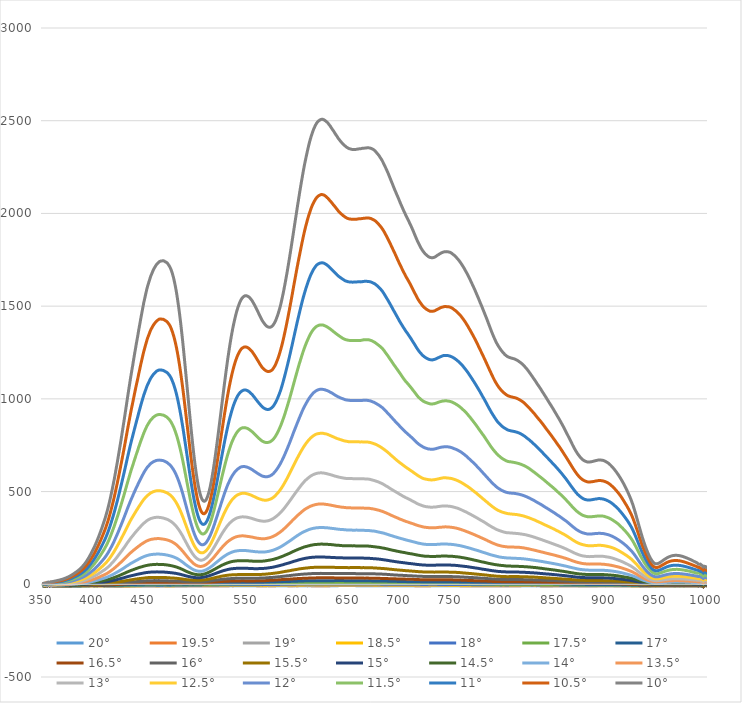
| Category | 20° | 19.5° | 19° | 18.5° | 18° | 17.5° | 17° | 16.5° | 16° | 15.5° | 15° | 14.5° | 14° | 13.5° | 13° | 12.5° | 12° | 11.5° | 11° | 10.5° | 10° |
|---|---|---|---|---|---|---|---|---|---|---|---|---|---|---|---|---|---|---|---|---|---|
| 350.0 | -10 | -11.02 | -11.71 | -10.6 | -11.24 | -12.84 | -10.41 | -9.84 | -10.38 | -9.68 | -8.54 | -9.34 | -8.19 | -7.99 | -8.82 | -6.83 | -7.26 | -1.53 | -5.43 | 0.02 | 2.93 |
| 351.0 | -9.22 | -9.49 | -9.49 | -7.64 | -9.81 | -8.31 | -7.84 | -7.64 | -9.61 | -7.09 | -6.87 | -6.73 | -6.76 | -6.06 | -5.84 | -4.16 | -2.84 | -2.92 | 0.99 | 2.59 | 5.61 |
| 352.0 | -9.07 | -8.38 | -10.74 | -9.99 | -7.34 | -9.9 | -7.33 | -8.97 | -9.09 | -8.37 | -6.91 | -6.82 | -4.83 | -6.4 | -1.57 | -4.04 | -0.53 | -0.83 | -0.29 | 3.73 | 6.51 |
| 353.0 | -8.75 | -9.77 | -7.89 | -10 | -11.17 | -8.79 | -8.24 | -8.46 | -7.64 | -8.14 | -6.86 | -8.42 | -6.86 | -5.61 | -4.22 | -3.83 | -2.38 | -0.36 | 0.94 | 6.61 | 5.08 |
| 354.0 | -11.13 | -10.84 | -10.36 | -9.51 | -10.81 | -9.68 | -8.02 | -9.39 | -7.99 | -9.81 | -8.4 | -10.52 | -7.86 | -7.68 | -4.73 | -2.63 | -4.05 | -0.04 | 0.52 | 3.36 | 6.55 |
| 355.0 | -7.14 | -8.62 | -5.9 | -6.95 | -7.66 | -5.05 | -7.15 | -7.69 | -4.98 | -7.45 | -5.7 | -5.26 | -4.68 | -1.62 | -2.18 | 1.18 | 1.76 | 1.74 | 7.07 | 8.83 | 11.26 |
| 356.0 | -5.54 | -6.26 | -5.9 | -4.74 | -5.83 | -4.41 | -5.54 | -6.29 | -5.62 | -5.87 | -5.06 | -3.06 | -3.85 | -3.06 | -0.77 | 0.75 | 2.08 | 4.98 | 3.74 | 8.46 | 11.79 |
| 357.0 | -7.53 | -7.83 | -9.19 | -6.79 | -8.82 | -6.94 | -7.97 | -8.34 | -6.84 | -7.04 | -7.78 | -4.25 | -5.36 | -5.21 | -2.69 | -2.32 | -0.36 | 2.26 | 5.22 | 7.84 | 10.57 |
| 358.0 | -4.87 | -5.07 | -5.77 | -5.09 | -6.64 | -3.98 | -7.79 | -4.24 | -4.15 | -5.12 | -3.23 | -3.58 | -2.86 | -2.5 | -1.37 | 0.8 | 1.37 | 6.04 | 6.92 | 11.02 | 13.13 |
| 359.0 | -7.29 | -7.72 | -8.25 | -6.79 | -6.98 | -6 | -7.44 | -7.22 | -4.8 | -6.59 | -6.78 | -5.27 | -5.24 | -3.77 | -2.53 | -0.76 | 0.6 | 4.78 | 5.71 | 10.49 | 13.89 |
| 360.0 | -8.21 | -8.77 | -8.54 | -7.88 | -8.45 | -8.07 | -8.2 | -7.99 | -7.18 | -6.98 | -6.59 | -6.07 | -5.13 | -4.1 | -2.24 | -0.16 | 1.67 | 5.13 | 6.71 | 10.71 | 14.66 |
| 361.0 | -8.07 | -8.67 | -8.37 | -7.85 | -8.34 | -7.85 | -8.02 | -7.88 | -6.99 | -6.86 | -6.47 | -5.84 | -4.86 | -3.81 | -1.67 | 0.41 | 2.32 | 5.8 | 7.78 | 11.82 | 15.9 |
| 362.0 | -8 | -8.61 | -8.39 | -7.87 | -8.35 | -7.83 | -8.07 | -7.97 | -6.82 | -6.91 | -6.43 | -5.75 | -4.74 | -3.53 | -1.4 | 0.72 | 2.9 | 6.63 | 8.57 | 12.82 | 17.07 |
| 363.0 | -7.93 | -8.53 | -8.19 | -7.63 | -8.4 | -7.68 | -8 | -7.79 | -6.59 | -6.7 | -6.26 | -5.63 | -4.62 | -3.18 | -1.18 | 1.3 | 3.47 | 7.39 | 9.58 | 13.9 | 18.34 |
| 364.0 | -7.99 | -8.49 | -8.31 | -7.61 | -8.3 | -7.71 | -8.08 | -7.82 | -6.63 | -6.66 | -6.15 | -5.45 | -4.51 | -2.98 | -0.87 | 1.7 | 3.99 | 8 | 10.55 | 14.75 | 19.69 |
| 365.0 | -7.8 | -8.28 | -8.14 | -7.38 | -8.13 | -7.47 | -7.99 | -7.62 | -6.52 | -6.44 | -5.87 | -5.02 | -4.2 | -2.5 | -0.27 | 2.28 | 4.8 | 8.94 | 11.62 | 16.03 | 21.07 |
| 366.0 | -7.96 | -8.36 | -8.33 | -7.53 | -8.26 | -7.67 | -8.08 | -7.69 | -6.65 | -6.43 | -5.9 | -5.08 | -4.19 | -2.47 | 0 | 2.47 | 5.25 | 9.73 | 12.33 | 17.05 | 22.22 |
| 367.0 | -8.13 | -8.55 | -8.52 | -7.69 | -8.39 | -7.87 | -8.2 | -7.64 | -6.8 | -6.52 | -5.94 | -5.23 | -4.11 | -2.4 | 0.14 | 2.72 | 5.72 | 10.37 | 13.43 | 18.09 | 23.37 |
| 368.0 | -8.21 | -8.55 | -8.49 | -7.73 | -8.42 | -7.92 | -8.2 | -7.54 | -6.84 | -6.53 | -5.78 | -5.22 | -3.94 | -2.13 | 0.5 | 3.28 | 6.47 | 11.21 | 14.43 | 19.42 | 24.88 |
| 369.0 | -8.35 | -8.64 | -8.59 | -7.83 | -8.46 | -8.13 | -8.13 | -7.66 | -6.93 | -6.58 | -5.73 | -5.25 | -3.84 | -1.9 | 0.84 | 3.74 | 7.21 | 12.1 | 15.62 | 20.7 | 26.47 |
| 370.0 | -8.43 | -8.71 | -8.58 | -7.97 | -8.54 | -8.3 | -8.18 | -7.73 | -7.03 | -6.54 | -5.69 | -5.15 | -3.75 | -1.67 | 1.22 | 4.14 | 7.93 | 13.03 | 16.86 | 22.11 | 28.16 |
| 371.0 | -8.28 | -8.61 | -8.5 | -7.96 | -8.42 | -8.35 | -7.98 | -7.62 | -6.96 | -6.44 | -5.61 | -4.84 | -3.47 | -1.26 | 1.78 | 4.94 | 8.8 | 14.15 | 18.35 | 23.85 | 30.21 |
| 372.0 | -8.3 | -8.65 | -8.51 | -7.9 | -8.43 | -8.31 | -7.93 | -7.56 | -6.93 | -6.41 | -5.41 | -4.58 | -3.09 | -0.89 | 2.32 | 5.59 | 9.7 | 15.41 | 20.04 | 25.59 | 32.4 |
| 373.0 | -8.28 | -8.62 | -8.51 | -7.88 | -8.39 | -8.35 | -7.93 | -7.45 | -6.89 | -6.43 | -5.31 | -4.4 | -2.71 | -0.48 | 2.88 | 6.48 | 10.58 | 16.75 | 21.68 | 27.48 | 34.53 |
| 374.0 | -8.31 | -8.61 | -8.47 | -7.94 | -8.38 | -8.22 | -7.86 | -7.47 | -6.82 | -6.3 | -5.12 | -4.18 | -2.39 | -0.02 | 3.49 | 7.3 | 11.68 | 18.18 | 23.08 | 29.51 | 36.93 |
| 375.0 | -8.38 | -8.55 | -8.49 | -7.96 | -8.53 | -8.18 | -7.84 | -7.42 | -6.82 | -6.31 | -5.04 | -3.95 | -2.09 | 0.46 | 4.24 | 8.05 | 12.83 | 19.58 | 24.86 | 31.92 | 39.53 |
| 376.0 | -8.39 | -8.61 | -8.72 | -8.15 | -8.71 | -8.26 | -8.03 | -7.45 | -6.96 | -6.44 | -5.15 | -3.84 | -1.92 | 0.73 | 4.97 | 8.83 | 13.99 | 21.03 | 26.6 | 34.08 | 42.01 |
| 377.0 | -8.38 | -8.5 | -8.69 | -8.18 | -8.6 | -8.13 | -8.02 | -7.47 | -6.93 | -6.41 | -4.87 | -3.5 | -1.57 | 1.26 | 5.56 | 9.7 | 15.29 | 22.67 | 28.79 | 36.78 | 45.04 |
| 378.0 | -8.36 | -8.45 | -8.72 | -8.11 | -8.57 | -8.04 | -7.92 | -7.4 | -6.89 | -6.27 | -4.64 | -3.22 | -1.06 | 1.85 | 6.34 | 10.82 | 16.52 | 24.32 | 30.92 | 39.45 | 48.13 |
| 379.0 | -8.29 | -8.39 | -8.56 | -8 | -8.45 | -7.95 | -7.76 | -7.16 | -6.73 | -6.08 | -4.36 | -2.8 | -0.54 | 2.55 | 7.21 | 12.01 | 18.15 | 26.27 | 33.34 | 42.18 | 51.51 |
| 380.0 | -8.37 | -8.41 | -8.49 | -7.93 | -8.45 | -7.85 | -7.72 | -7.09 | -6.63 | -5.86 | -3.98 | -2.48 | -0.13 | 3.21 | 8.1 | 13.15 | 19.61 | 28.21 | 35.89 | 45.12 | 55.15 |
| 381.0 | -8.41 | -8.35 | -8.46 | -8.03 | -8.35 | -7.72 | -7.57 | -7.04 | -6.48 | -5.62 | -3.71 | -2.27 | 0.37 | 3.99 | 8.98 | 14.38 | 21.26 | 30.29 | 38.53 | 47.96 | 58.83 |
| 382.0 | -8.52 | -8.36 | -8.51 | -7.99 | -8.27 | -7.64 | -7.58 | -6.99 | -6.36 | -5.38 | -3.54 | -1.94 | 0.83 | 4.62 | 9.84 | 15.62 | 22.95 | 32.54 | 41.16 | 50.94 | 62.66 |
| 383.0 | -8.5 | -8.28 | -8.34 | -7.99 | -8.16 | -7.71 | -7.53 | -6.8 | -6.2 | -5.12 | -3.21 | -1.54 | 1.37 | 5.28 | 10.89 | 17.02 | 24.72 | 34.56 | 43.81 | 54.06 | 66.44 |
| 384.0 | -8.61 | -8.41 | -8.41 | -8.2 | -8.09 | -7.74 | -7.59 | -6.82 | -6.25 | -5.12 | -3.15 | -1.19 | 1.85 | 5.94 | 11.86 | 18.16 | 26.51 | 36.75 | 46.59 | 57.65 | 70.42 |
| 385.0 | -8.67 | -8.46 | -8.39 | -8.18 | -8.11 | -7.65 | -7.48 | -6.73 | -6.12 | -4.95 | -2.95 | -0.78 | 2.41 | 6.79 | 12.91 | 19.69 | 28.43 | 39.34 | 49.58 | 61.47 | 74.77 |
| 386.0 | -8.74 | -8.59 | -8.52 | -8.35 | -8.19 | -7.84 | -7.55 | -6.66 | -6.11 | -4.84 | -2.8 | -0.51 | 2.99 | 7.51 | 13.86 | 21.07 | 30.38 | 41.78 | 52.71 | 65.35 | 79.41 |
| 387.0 | -8.73 | -8.51 | -8.52 | -8.22 | -8.08 | -7.76 | -7.42 | -6.63 | -6.01 | -4.66 | -2.56 | -0.08 | 3.63 | 8.36 | 15.02 | 22.82 | 32.4 | 44.36 | 56.09 | 69.47 | 84.38 |
| 388.0 | -8.59 | -8.29 | -8.35 | -8.12 | -7.9 | -7.59 | -7.24 | -6.56 | -5.69 | -4.34 | -1.99 | 0.58 | 4.49 | 9.61 | 16.53 | 24.81 | 34.86 | 47.45 | 59.82 | 74.12 | 90.1 |
| 389.0 | -8.47 | -8.25 | -8.26 | -8.08 | -7.74 | -7.44 | -7.1 | -6.4 | -5.42 | -3.89 | -1.61 | 1.23 | 5.34 | 10.66 | 18.16 | 26.8 | 37.5 | 50.83 | 63.76 | 78.83 | 95.84 |
| 390.0 | -8.49 | -8.25 | -8.15 | -8.12 | -7.69 | -7.39 | -7.21 | -6.29 | -5.35 | -3.6 | -1.28 | 1.82 | 6.04 | 11.72 | 19.8 | 28.84 | 40.11 | 54.4 | 68.12 | 84.13 | 102.12 |
| 391.0 | -8.55 | -8.21 | -8.14 | -8.07 | -7.62 | -7.36 | -7.17 | -6.18 | -5.19 | -3.44 | -0.84 | 2.43 | 6.93 | 12.89 | 21.48 | 31.18 | 42.99 | 58.14 | 72.71 | 89.65 | 108.72 |
| 392.0 | -8.52 | -8.18 | -8.15 | -7.98 | -7.63 | -7.26 | -7.08 | -6.03 | -5.09 | -3.14 | -0.39 | 3.12 | 7.77 | 14.27 | 23.3 | 33.52 | 46.19 | 62.31 | 77.61 | 95.75 | 115.93 |
| 393.0 | -8.39 | -8.2 | -8.07 | -7.95 | -7.54 | -7.32 | -6.98 | -5.98 | -4.91 | -2.9 | -0.07 | 3.72 | 8.56 | 15.55 | 25.41 | 36.07 | 49.4 | 66.69 | 82.79 | 102.26 | 123.86 |
| 394.0 | -8.26 | -8.26 | -7.96 | -7.86 | -7.51 | -7.21 | -6.82 | -5.86 | -4.69 | -2.57 | 0.42 | 4.5 | 9.53 | 17.02 | 27.44 | 38.77 | 52.95 | 71.4 | 88.55 | 109.32 | 132.48 |
| 395.0 | -8.23 | -8.29 | -7.92 | -7.87 | -7.41 | -7.3 | -6.88 | -5.67 | -4.53 | -2.42 | 0.88 | 5.15 | 10.46 | 18.34 | 29.75 | 41.72 | 56.75 | 76.17 | 94.82 | 116.62 | 141.45 |
| 396.0 | -8.17 | -8.25 | -7.94 | -7.79 | -7.31 | -7.23 | -6.85 | -5.56 | -4.25 | -2.14 | 1.53 | 5.99 | 11.7 | 20.1 | 31.98 | 45.13 | 60.74 | 81.65 | 101.73 | 124.71 | 151.11 |
| 397.0 | -8.24 | -8.23 | -7.72 | -7.74 | -7.2 | -7.12 | -6.61 | -5.37 | -3.93 | -1.77 | 2.21 | 6.9 | 12.98 | 21.83 | 34.35 | 48.4 | 64.97 | 87.29 | 108.75 | 133.13 | 161.36 |
| 398.0 | -8.24 | -8.27 | -7.67 | -7.64 | -7.16 | -7.14 | -6.5 | -5.17 | -3.54 | -1.3 | 2.76 | 7.79 | 14.27 | 23.71 | 37.13 | 51.89 | 69.34 | 93.18 | 116.22 | 141.89 | 171.87 |
| 399.0 | -8.31 | -8.22 | -7.74 | -7.68 | -7.12 | -7.12 | -6.49 | -5.11 | -3.32 | -0.97 | 3.39 | 8.72 | 15.49 | 25.53 | 39.81 | 55.44 | 73.82 | 99.42 | 123.66 | 150.76 | 182.78 |
| 400.0 | -8.48 | -8.3 | -7.95 | -7.8 | -7.29 | -7.34 | -6.66 | -5.23 | -3.28 | -0.72 | 3.83 | 9.52 | 16.56 | 27.2 | 42.32 | 58.88 | 78.25 | 105.79 | 131.43 | 160.33 | 193.75 |
| 401.0 | -8.47 | -8.28 | -7.99 | -7.76 | -7.25 | -7.39 | -6.69 | -5.17 | -3.22 | -0.55 | 4.34 | 10.46 | 17.95 | 29 | 45.29 | 62.71 | 83.45 | 112.53 | 139.75 | 170.31 | 205.61 |
| 402.0 | -8.4 | -8.29 | -7.96 | -7.69 | -7.19 | -7.32 | -6.5 | -5.01 | -2.93 | -0.2 | 4.96 | 11.46 | 19.45 | 31.08 | 48.21 | 66.68 | 88.79 | 119.58 | 148.3 | 180.87 | 217.96 |
| 403.0 | -8.41 | -8.27 | -7.94 | -7.64 | -7.24 | -7.37 | -6.43 | -4.99 | -2.85 | 0.1 | 5.71 | 12.48 | 20.82 | 33.15 | 51.05 | 70.89 | 94.2 | 126.75 | 157.27 | 191.89 | 230.7 |
| 404.0 | -8.53 | -8.35 | -8.03 | -7.69 | -7.24 | -7.26 | -6.36 | -4.95 | -2.72 | 0.54 | 6.35 | 13.42 | 22.29 | 35.34 | 54.11 | 75.33 | 99.79 | 134.47 | 166.56 | 203.39 | 244.4 |
| 405.0 | -8.37 | -8.23 | -8 | -7.51 | -7.2 | -7.09 | -6.2 | -4.8 | -2.35 | 1 | 7.11 | 14.57 | 23.97 | 37.71 | 57.5 | 79.89 | 105.55 | 142.55 | 176.32 | 214.93 | 258.54 |
| 406.0 | -8.26 | -8.08 | -7.93 | -7.39 | -7.06 | -7.04 | -6.1 | -4.53 | -1.92 | 1.54 | 8 | 15.75 | 25.95 | 40.25 | 61.24 | 84.8 | 111.87 | 150.82 | 186.53 | 227.12 | 273.32 |
| 407.0 | -8.34 | -8.1 | -7.89 | -7.4 | -7.04 | -6.99 | -6.06 | -4.53 | -1.69 | 2 | 8.76 | 16.79 | 27.63 | 42.68 | 64.66 | 89.42 | 118 | 159.2 | 196.92 | 239.66 | 287.87 |
| 408.0 | -8.23 | -8.14 | -7.76 | -7.41 | -6.97 | -7 | -5.99 | -4.22 | -1.4 | 2.42 | 9.64 | 18.02 | 29.37 | 45.17 | 68.5 | 94.43 | 124.43 | 167.93 | 207.63 | 252.5 | 303.32 |
| 409.0 | -8.41 | -8.38 | -7.98 | -7.56 | -7.17 | -7.14 | -6.1 | -4.26 | -1.28 | 2.71 | 10.17 | 19.13 | 30.86 | 47.51 | 72.22 | 99.48 | 131.04 | 176.97 | 218.43 | 265.85 | 319.11 |
| 410.0 | -8.56 | -8.48 | -8.13 | -7.71 | -7.38 | -7.28 | -6.2 | -4.17 | -1.02 | 2.83 | 10.72 | 20.13 | 32.48 | 49.99 | 75.7 | 104.68 | 137.57 | 185.88 | 229.81 | 279.33 | 335.62 |
| 411.0 | -8.6 | -8.49 | -8.15 | -7.7 | -7.37 | -7.24 | -5.96 | -4.05 | -0.61 | 3.31 | 11.6 | 21.49 | 34.41 | 52.77 | 79.41 | 110.11 | 144.78 | 195.41 | 241.49 | 293.5 | 352.59 |
| 412.0 | -8.48 | -8.49 | -8.11 | -7.65 | -7.32 | -7.13 | -5.72 | -3.81 | -0.28 | 3.96 | 12.57 | 22.75 | 36.3 | 55.67 | 83.49 | 115.97 | 152.41 | 205.62 | 254.24 | 308.61 | 371.05 |
| 413.0 | -8.65 | -8.51 | -8.14 | -7.69 | -7.28 | -7.15 | -5.72 | -3.66 | 0.01 | 4.31 | 13.51 | 24.09 | 38.39 | 58.55 | 88.02 | 121.91 | 160.41 | 216.21 | 267.66 | 324.49 | 390.23 |
| 414.0 | -8.79 | -8.51 | -8.25 | -7.85 | -7.36 | -7.07 | -5.66 | -3.46 | 0.37 | 5.01 | 14.56 | 25.63 | 40.63 | 61.92 | 92.6 | 128.52 | 169.32 | 228.06 | 282.08 | 341.87 | 411.16 |
| 415.0 | -9.01 | -8.55 | -8.42 | -7.97 | -7.42 | -7.01 | -5.63 | -3.32 | 0.62 | 5.58 | 15.65 | 27.13 | 42.83 | 65.33 | 97.66 | 135.58 | 178.56 | 240.25 | 297.14 | 360.32 | 433.15 |
| 416.0 | -9.01 | -8.53 | -8.42 | -7.9 | -7.42 | -6.81 | -5.32 | -3.01 | 1 | 6.25 | 16.86 | 28.88 | 45.44 | 69.3 | 103.06 | 143.01 | 188.38 | 253.5 | 313.31 | 380.03 | 456.79 |
| 417.0 | -8.84 | -8.51 | -8.38 | -8.02 | -7.35 | -6.65 | -5.09 | -2.67 | 1.49 | 7.1 | 18.12 | 30.82 | 48.16 | 73.24 | 109.06 | 151.07 | 198.92 | 267.69 | 330.7 | 400.84 | 482.42 |
| 418.0 | -8.78 | -8.5 | -8.44 | -8.01 | -7.29 | -6.54 | -4.92 | -2.44 | 1.99 | 7.75 | 19.4 | 32.5 | 50.86 | 77.29 | 114.88 | 159.43 | 209.39 | 282.11 | 348.67 | 422.15 | 508.29 |
| 419.0 | -8.77 | -8.5 | -8.39 | -8.07 | -7.32 | -6.46 | -4.82 | -2.2 | 2.4 | 8.29 | 20.58 | 34.32 | 53.51 | 81.48 | 120.92 | 167.98 | 220.44 | 296.89 | 366.71 | 444.31 | 535.1 |
| 420.0 | -8.94 | -8.65 | -8.54 | -8.22 | -7.35 | -6.53 | -4.8 | -2.1 | 2.81 | 8.95 | 21.64 | 36.15 | 56.42 | 85.77 | 127.1 | 176.42 | 231.9 | 311.57 | 386.01 | 467.38 | 562.7 |
| 421.0 | -8.92 | -8.67 | -8.46 | -8.2 | -7.26 | -6.35 | -4.59 | -1.78 | 3.42 | 9.75 | 22.97 | 38.27 | 59.62 | 90.58 | 133.64 | 185.85 | 244.12 | 327.79 | 406.04 | 492.12 | 592.92 |
| 422.0 | -9.04 | -8.79 | -8.57 | -8.26 | -7.39 | -6.37 | -4.5 | -1.53 | 3.95 | 10.56 | 24.38 | 40.33 | 62.71 | 95.38 | 140.5 | 195.78 | 256.7 | 344.58 | 426.87 | 517.96 | 623.61 |
| 423.0 | -9.25 | -8.81 | -8.62 | -8.41 | -7.45 | -6.38 | -4.54 | -1.26 | 4.33 | 11.41 | 25.77 | 42.41 | 65.64 | 100.28 | 147.42 | 205.4 | 269.04 | 361 | 447.38 | 543.47 | 654.5 |
| 424.0 | -9.21 | -8.79 | -8.65 | -8.37 | -7.36 | -6.24 | -4.27 | -0.74 | 5.12 | 12.36 | 27.17 | 44.62 | 68.97 | 105.44 | 154.76 | 215.31 | 281.98 | 378.15 | 469.21 | 570.35 | 686.9 |
| 425.0 | -9.13 | -8.8 | -8.59 | -8.29 | -7.32 | -6.09 | -4.05 | -0.3 | 5.67 | 13.32 | 28.69 | 47.14 | 72.41 | 110.41 | 162.22 | 225.4 | 295.54 | 396.19 | 491.67 | 597.69 | 720.03 |
| 426.0 | -9.28 | -8.93 | -8.59 | -8.42 | -7.34 | -6.19 | -3.93 | -0.02 | 6.11 | 14.18 | 30.21 | 49.51 | 75.62 | 115.63 | 169.59 | 235.57 | 309.04 | 414.36 | 514.56 | 625.34 | 753.63 |
| 427.0 | -9.33 | -9.04 | -8.57 | -8.5 | -7.43 | -6.1 | -3.81 | 0.22 | 6.44 | 15.01 | 31.48 | 51.75 | 78.76 | 120.65 | 176.95 | 246.04 | 322.35 | 432.47 | 537.51 | 653.32 | 787.29 |
| 428.0 | -9.12 | -8.85 | -8.49 | -8.36 | -7.21 | -5.81 | -3.44 | 0.79 | 7.16 | 15.93 | 33 | 54.39 | 82.27 | 126.04 | 184.58 | 257.12 | 336.43 | 450.96 | 560.88 | 682.07 | 822.27 |
| 429.0 | -9.2 | -8.92 | -8.59 | -8.48 | -7.25 | -5.9 | -3.32 | 1.03 | 7.62 | 16.84 | 34.29 | 56.68 | 85.74 | 131.38 | 192.12 | 267.74 | 350.26 | 469.47 | 584.53 | 711.12 | 857.51 |
| 430.0 | -9.15 | -8.77 | -8.47 | -8.36 | -7.17 | -5.76 | -3.06 | 1.45 | 8.25 | 17.73 | 35.91 | 59.05 | 89.45 | 136.57 | 199.73 | 278.48 | 364.34 | 488.22 | 608.23 | 739.86 | 892.42 |
| 431.0 | -9.09 | -8.75 | -8.37 | -8.17 | -6.96 | -5.65 | -2.84 | 1.72 | 8.76 | 18.88 | 37.76 | 61.71 | 93.39 | 142.56 | 207.74 | 289.53 | 378.87 | 508.27 | 632.82 | 770.7 | 929.16 |
| 432.0 | -9.06 | -8.74 | -8.42 | -8.07 | -6.87 | -5.47 | -2.62 | 2.14 | 9.32 | 19.82 | 39.31 | 64.11 | 97.05 | 147.94 | 215.82 | 300.79 | 393.21 | 527.4 | 657.26 | 800.83 | 966.07 |
| 433.0 | -9.08 | -8.7 | -8.45 | -8.01 | -6.88 | -5.36 | -2.49 | 2.46 | 9.87 | 20.66 | 40.92 | 66.58 | 100.63 | 153.62 | 224.14 | 311.89 | 408.11 | 547.29 | 682.06 | 831.96 | 1003.26 |
| 434.0 | -8.97 | -8.79 | -8.45 | -8.03 | -6.9 | -5.13 | -2.27 | 2.75 | 10.43 | 21.85 | 42.37 | 68.82 | 104.08 | 158.94 | 231.61 | 322.7 | 421.98 | 566.06 | 706.05 | 861.46 | 1039.29 |
| 435.0 | -8.88 | -8.63 | -8.4 | -7.91 | -6.83 | -4.95 | -2.02 | 3.24 | 11.1 | 22.79 | 43.71 | 71.03 | 107.71 | 164.16 | 239.19 | 333.22 | 435.43 | 584.69 | 729.32 | 890.54 | 1074.36 |
| 436.0 | -8.78 | -8.56 | -8.31 | -7.93 | -6.66 | -4.9 | -1.79 | 3.61 | 11.69 | 23.76 | 45.06 | 73.42 | 111.38 | 169.46 | 247.08 | 343.85 | 449.38 | 603.84 | 753.12 | 920.32 | 1110.18 |
| 437.0 | -8.73 | -8.51 | -8.27 | -7.88 | -6.57 | -4.68 | -1.6 | 3.93 | 12.25 | 24.67 | 46.47 | 75.51 | 114.71 | 174.48 | 253.93 | 353.67 | 462.28 | 621.26 | 775.59 | 948.15 | 1143.56 |
| 438.0 | -8.95 | -8.57 | -8.29 | -7.8 | -6.62 | -4.68 | -1.5 | 4.04 | 12.51 | 25.25 | 47.64 | 77.34 | 117.4 | 178.81 | 260.44 | 362.74 | 474.58 | 637.86 | 796.57 | 974.84 | 1175.53 |
| 439.0 | -8.87 | -8.38 | -8.26 | -7.72 | -6.57 | -4.6 | -1.29 | 4.33 | 13.07 | 26.25 | 49.01 | 79.58 | 120.54 | 183.79 | 267.59 | 372.26 | 487.56 | 655.07 | 818.18 | 1002.44 | 1208.97 |
| 440.0 | -8.81 | -8.35 | -8.29 | -7.62 | -6.46 | -4.47 | -1.15 | 4.61 | 13.53 | 27.14 | 50.26 | 81.56 | 123.59 | 188.14 | 274.32 | 381.37 | 499.84 | 672.09 | 839.51 | 1029.28 | 1241.9 |
| 441.0 | -8.57 | -8.31 | -8.11 | -7.44 | -6.31 | -4.31 | -0.84 | 5.12 | 14.1 | 28.01 | 51.68 | 83.74 | 126.73 | 192.47 | 280.94 | 390.74 | 512.28 | 689.48 | 860.4 | 1056.42 | 1274.85 |
| 442.0 | -8.48 | -8.2 | -8.04 | -7.4 | -6.27 | -4.18 | -0.59 | 5.54 | 14.49 | 28.82 | 53.12 | 85.73 | 129.64 | 196.87 | 287.57 | 399.73 | 524.49 | 706.1 | 881.66 | 1081.83 | 1306.61 |
| 443.0 | -8.42 | -8.04 | -7.9 | -7.31 | -6.06 | -4.02 | -0.27 | 5.89 | 15.02 | 29.54 | 54.24 | 87.62 | 132.53 | 201.11 | 293.71 | 407.95 | 535.44 | 721.97 | 901.35 | 1106.34 | 1336.6 |
| 444.0 | -8.35 | -8.09 | -7.84 | -7.29 | -6.03 | -3.88 | -0.02 | 6.11 | 15.58 | 30.23 | 55.5 | 89.58 | 135.75 | 205.37 | 300.2 | 417.1 | 547.74 | 739.34 | 923.7 | 1133.71 | 1369.85 |
| 445.0 | -8.4 | -8.19 | -7.74 | -7.38 | -6.02 | -3.8 | 0.07 | 6.2 | 15.73 | 30.87 | 56.56 | 91.35 | 138.43 | 209.35 | 306.04 | 425.17 | 558.68 | 754.89 | 943.19 | 1158.3 | 1399.63 |
| 446.0 | -8.44 | -8.2 | -7.88 | -7.36 | -5.94 | -3.72 | 0.22 | 6.25 | 16.15 | 31.49 | 57.53 | 92.96 | 141.26 | 213.76 | 312.2 | 433.98 | 569.95 | 771.04 | 964.04 | 1184.5 | 1431.14 |
| 447.0 | -8.29 | -8.02 | -7.91 | -7.21 | -5.92 | -3.5 | 0.37 | 6.54 | 16.58 | 32.11 | 58.72 | 94.51 | 143.93 | 217.37 | 317.99 | 442.09 | 580.45 | 785.74 | 983.06 | 1208.73 | 1460.84 |
| 448.0 | -8.25 | -8.07 | -7.97 | -7.23 | -5.89 | -3.43 | 0.43 | 6.73 | 17.08 | 32.59 | 59.85 | 96.17 | 146.38 | 220.86 | 323.62 | 449.76 | 591.03 | 800.74 | 1001.96 | 1232.77 | 1490.06 |
| 449.0 | -8.28 | -8.1 | -7.9 | -7.21 | -5.9 | -3.45 | 0.65 | 6.81 | 17.46 | 33.32 | 60.95 | 97.79 | 148.87 | 224.51 | 329.25 | 457.39 | 601.43 | 815.4 | 1020.36 | 1255.92 | 1519.2 |
| 450.0 | -8.14 | -7.93 | -7.79 | -7.06 | -5.84 | -3.07 | 0.81 | 7.03 | 17.99 | 34.02 | 61.95 | 99.13 | 150.95 | 227.83 | 333.63 | 463.81 | 610.86 | 828.38 | 1036.07 | 1276.07 | 1543.61 |
| 451.0 | -8.02 | -7.84 | -7.73 | -6.99 | -5.7 | -2.85 | 1 | 7.33 | 18.36 | 34.84 | 62.82 | 100.51 | 152.78 | 231.21 | 338.2 | 469.78 | 619.33 | 840.77 | 1051.52 | 1295.83 | 1568.33 |
| 452.0 | -7.89 | -7.68 | -7.66 | -7.02 | -5.55 | -2.63 | 1.24 | 7.63 | 18.83 | 35.53 | 63.65 | 101.74 | 154.71 | 233.82 | 342.66 | 475.88 | 627.95 | 852.3 | 1067.03 | 1315.18 | 1592.54 |
| 453.0 | -7.87 | -7.8 | -7.79 | -7.08 | -5.74 | -2.75 | 1.18 | 7.69 | 18.88 | 35.9 | 64.23 | 102.79 | 156.32 | 236.33 | 346.49 | 480.81 | 635.18 | 862.59 | 1079.81 | 1331.97 | 1612.67 |
| 454.0 | -7.91 | -7.82 | -7.71 | -7.16 | -5.7 | -2.66 | 1.27 | 7.89 | 19.19 | 36.2 | 64.77 | 103.82 | 157.9 | 238.31 | 349.56 | 484.94 | 640.59 | 871.05 | 1091.15 | 1346.02 | 1630.24 |
| 455.0 | -7.87 | -7.74 | -7.7 | -7.15 | -5.69 | -2.73 | 1.21 | 8.05 | 19.31 | 36.32 | 65.29 | 104.71 | 159.13 | 240.35 | 352.47 | 489.36 | 646.54 | 879.97 | 1102.46 | 1361.18 | 1648.06 |
| 456.0 | -7.84 | -7.87 | -7.69 | -7.12 | -5.67 | -2.8 | 1.25 | 8.02 | 19.31 | 36.46 | 65.82 | 105.54 | 160.06 | 242.01 | 354.87 | 493.32 | 652.16 | 887.56 | 1113.33 | 1374.6 | 1664.66 |
| 457.0 | -7.88 | -7.91 | -7.71 | -7.1 | -5.69 | -2.81 | 1.38 | 8.05 | 19.48 | 36.52 | 66.19 | 105.88 | 160.64 | 243.07 | 356.23 | 495.91 | 655.8 | 892.82 | 1121.08 | 1384.07 | 1677.42 |
| 458.0 | -8 | -7.98 | -7.71 | -7.18 | -5.77 | -3.02 | 1.31 | 8.04 | 19.6 | 36.54 | 66.5 | 106.47 | 161.32 | 243.81 | 358.02 | 499 | 659.78 | 899.12 | 1129.17 | 1394.28 | 1691.33 |
| 459.0 | -7.89 | -7.87 | -7.64 | -7.16 | -5.68 | -2.98 | 1.46 | 8.27 | 19.89 | 36.75 | 66.62 | 107 | 162.14 | 244.89 | 359.38 | 500.75 | 662.76 | 903.83 | 1135.52 | 1402.48 | 1702.29 |
| 460.0 | -8 | -8.1 | -7.79 | -7.22 | -5.77 | -3.06 | 1.27 | 8.3 | 19.71 | 36.79 | 66.56 | 107.13 | 162.22 | 245.07 | 360.08 | 502.29 | 664.9 | 907.49 | 1141.01 | 1409.7 | 1711.79 |
| 461.0 | -8.13 | -8.04 | -7.86 | -7.31 | -5.89 | -3.06 | 1.33 | 8.35 | 19.76 | 36.94 | 66.81 | 107.38 | 162.64 | 245.82 | 360.93 | 503.63 | 667.24 | 911.24 | 1146.66 | 1416.59 | 1720.88 |
| 462.0 | -8.22 | -7.99 | -7.86 | -7.3 | -5.89 | -2.95 | 1.17 | 8.22 | 19.68 | 36.93 | 67.03 | 107.45 | 162.81 | 246.36 | 360.98 | 504.35 | 668.58 | 913.38 | 1151.21 | 1421.59 | 1728.06 |
| 463.0 | -8.19 | -8.05 | -7.89 | -7.28 | -5.93 | -2.97 | 1.17 | 8.1 | 19.75 | 36.96 | 66.79 | 107.34 | 162.83 | 246.32 | 361.06 | 504.51 | 669.14 | 914.63 | 1153.69 | 1426 | 1733.65 |
| 464.0 | -8.2 | -8.02 | -7.89 | -7.31 | -5.95 | -2.87 | 1.14 | 8.07 | 19.78 | 37.1 | 66.66 | 107.34 | 162.8 | 246.4 | 360.85 | 504.57 | 669.81 | 915.73 | 1155.91 | 1429.74 | 1739.45 |
| 465.0 | -8.13 | -7.91 | -7.89 | -7.2 | -5.92 | -2.89 | 1.13 | 8.05 | 19.64 | 37.03 | 66.44 | 107.22 | 162.44 | 245.87 | 360.29 | 504 | 669.15 | 915.19 | 1155.96 | 1430.59 | 1741.73 |
| 466.0 | -8.13 | -7.88 | -7.95 | -7.19 | -5.86 | -2.96 | 1.09 | 8.08 | 19.61 | 36.92 | 66.4 | 106.84 | 162.06 | 245.11 | 359.39 | 503.57 | 668.68 | 914.8 | 1155.76 | 1430.54 | 1744.06 |
| 467.0 | -8.1 | -7.83 | -7.83 | -7.14 | -5.95 | -2.83 | 1.23 | 8.18 | 19.49 | 36.86 | 66.27 | 106.61 | 161.38 | 244.13 | 358.34 | 502.1 | 667.58 | 913.05 | 1154.21 | 1428.97 | 1744.09 |
| 468.0 | -8.06 | -7.88 | -7.77 | -7.19 | -5.88 | -2.87 | 1.18 | 8.12 | 19.45 | 36.79 | 66.06 | 106.45 | 161.04 | 243.57 | 357.44 | 501.07 | 666.82 | 912.37 | 1153.52 | 1429.11 | 1744.99 |
| 469.0 | -8.02 | -7.78 | -7.78 | -7.13 | -5.72 | -2.8 | 1.25 | 8.17 | 19.31 | 36.78 | 65.73 | 105.98 | 160.31 | 242.68 | 355.5 | 499.04 | 664.64 | 910.05 | 1150.63 | 1426.19 | 1743.03 |
| 470.0 | -8.03 | -7.88 | -7.91 | -7.3 | -5.84 | -2.85 | 0.94 | 7.99 | 19.11 | 36.47 | 65.29 | 105.27 | 159.11 | 241.4 | 353.54 | 496.49 | 661.69 | 906.64 | 1147.32 | 1422.15 | 1738.78 |
| 471.0 | -8.16 | -8.04 | -8.05 | -7.34 | -5.86 | -2.99 | 0.88 | 7.92 | 18.88 | 36.06 | 65.01 | 104.73 | 158.36 | 240.28 | 352.05 | 494.7 | 659.14 | 903.63 | 1144.6 | 1419.15 | 1736.71 |
| 472.0 | -8.29 | -8.24 | -8.16 | -7.49 | -5.92 | -3.21 | 0.71 | 7.61 | 18.7 | 35.57 | 64.45 | 104.05 | 157.34 | 238.88 | 350.02 | 492.14 | 655.65 | 899.47 | 1140.63 | 1414.55 | 1732.26 |
| 473.0 | -8.41 | -8.39 | -8.21 | -7.59 | -6.07 | -3.32 | 0.63 | 7.37 | 18.39 | 35.09 | 63.7 | 103.1 | 155.85 | 237.02 | 347.19 | 488.64 | 651.04 | 893.96 | 1134.19 | 1407.25 | 1724.04 |
| 474.0 | -8.5 | -8.32 | -8.08 | -7.64 | -6 | -3.15 | 0.73 | 7.22 | 18.39 | 34.75 | 63.29 | 102.17 | 154.52 | 235.27 | 344.18 | 484.95 | 646.37 | 887.95 | 1127.94 | 1399.64 | 1716.38 |
| 475.0 | -8.38 | -8.23 | -8.12 | -7.51 | -5.92 | -3.15 | 0.7 | 7.18 | 18.27 | 34.48 | 62.75 | 101.08 | 153.09 | 232.93 | 340.74 | 480.67 | 641 | 880.44 | 1119.06 | 1389.37 | 1705.58 |
| 476.0 | -8.47 | -8.12 | -8.1 | -7.47 | -5.88 | -3.17 | 0.9 | 7.13 | 18.24 | 34.29 | 62.18 | 100.06 | 151.6 | 230.51 | 337.12 | 475.61 | 634.81 | 871.81 | 1108.5 | 1376.22 | 1691.98 |
| 477.0 | -8.49 | -8.06 | -8.09 | -7.47 | -5.84 | -3.2 | 0.87 | 6.99 | 18.13 | 33.86 | 61.54 | 98.85 | 149.72 | 227.57 | 332.92 | 469.65 | 626.92 | 861.07 | 1095.18 | 1360.51 | 1674.79 |
| 478.0 | -8.5 | -8.12 | -8.08 | -7.36 | -5.87 | -3.24 | 0.74 | 6.84 | 17.8 | 33.43 | 60.76 | 97.58 | 147.78 | 224.34 | 328.24 | 462.95 | 618.72 | 849.62 | 1081.01 | 1343.5 | 1654.66 |
| 479.0 | -8.53 | -8.09 | -8.13 | -7.27 | -5.79 | -3.17 | 0.85 | 6.74 | 17.65 | 33.21 | 59.93 | 96.11 | 145.57 | 220.91 | 323.04 | 455.01 | 608.9 | 835.82 | 1064.13 | 1323.08 | 1630.62 |
| 480.0 | -8.48 | -7.97 | -8.1 | -7.16 | -5.79 | -3.08 | 0.88 | 6.6 | 17.4 | 32.76 | 59.12 | 94.52 | 143.03 | 216.81 | 317.15 | 446.98 | 598.13 | 820.81 | 1045.47 | 1300.34 | 1603.59 |
| 481.0 | -8.27 | -7.89 | -8.01 | -7.05 | -5.63 | -3.02 | 1.07 | 6.56 | 17.26 | 32.24 | 58.18 | 92.89 | 140.55 | 212.67 | 310.66 | 437.77 | 586.17 | 804.42 | 1024.65 | 1274.66 | 1572.69 |
| 482.0 | -8.2 | -7.9 | -7.81 | -6.89 | -5.51 | -3.02 | 1.04 | 6.55 | 17.05 | 31.67 | 57.09 | 90.87 | 137.61 | 207.88 | 303.39 | 427.83 | 572.85 | 785.62 | 1000.72 | 1245.58 | 1537.07 |
| 483.0 | -8.13 | -7.82 | -7.65 | -6.88 | -5.5 | -3 | 1.17 | 6.54 | 16.83 | 31.15 | 55.84 | 88.81 | 134.29 | 202.63 | 295.94 | 417.22 | 558.53 | 765.62 | 974.68 | 1214.01 | 1498.68 |
| 484.0 | -8.17 | -7.83 | -7.61 | -6.98 | -5.5 | -2.95 | 1.12 | 6.56 | 16.45 | 30.44 | 54.63 | 86.89 | 130.96 | 197.02 | 287.78 | 405.53 | 542.91 | 743.95 | 947.02 | 1179.53 | 1456.68 |
| 485.0 | -8.14 | -7.87 | -7.53 | -7.02 | -5.54 | -2.99 | 0.98 | 6.31 | 15.96 | 29.68 | 53.42 | 84.5 | 127.22 | 191.06 | 279.02 | 392.89 | 526.46 | 720.51 | 917.06 | 1142.05 | 1411.15 |
| 486.0 | -8.29 | -7.98 | -7.52 | -6.99 | -5.6 | -2.92 | 0.87 | 6.11 | 15.63 | 28.89 | 51.9 | 82.01 | 123.14 | 184.82 | 269.49 | 379.48 | 508.49 | 695.84 | 884.82 | 1102.04 | 1361.95 |
| 487.0 | -8.3 | -7.91 | -7.49 | -6.81 | -5.67 | -2.87 | 0.84 | 5.93 | 15.38 | 28.13 | 50.33 | 79.7 | 119.12 | 178.66 | 260.29 | 365.64 | 490.33 | 670.06 | 852.22 | 1061.19 | 1311.17 |
| 488.0 | -8.22 | -7.9 | -7.46 | -6.75 | -5.59 | -3.03 | 0.68 | 5.79 | 15.1 | 27.22 | 48.88 | 76.97 | 114.96 | 171.96 | 249.91 | 351.17 | 470.38 | 642.64 | 816.74 | 1017.12 | 1256.53 |
| 489.0 | -8.34 | -7.98 | -7.46 | -6.77 | -5.65 | -3.14 | 0.62 | 5.67 | 14.65 | 26.44 | 47.23 | 74.17 | 110.53 | 165.19 | 239.38 | 336.13 | 449.89 | 613.89 | 779.76 | 970.48 | 1199.38 |
| 490.0 | -8.4 | -8 | -7.38 | -6.72 | -5.72 | -3.26 | 0.68 | 5.5 | 14.29 | 25.66 | 45.76 | 71.53 | 106.22 | 158.42 | 229.23 | 321.28 | 429.45 | 585.15 | 743.15 | 924.32 | 1142.16 |
| 491.0 | -8.41 | -8.02 | -7.33 | -6.56 | -5.63 | -3.27 | 0.73 | 5.37 | 13.87 | 24.85 | 44.32 | 68.86 | 102.18 | 151.5 | 218.81 | 306.07 | 408.77 | 556.19 | 705.47 | 877.19 | 1084 |
| 492.0 | -8.37 | -7.86 | -7.15 | -6.48 | -5.46 | -3.05 | 0.75 | 5.27 | 13.56 | 24.37 | 43.01 | 66.65 | 98.38 | 144.68 | 208.56 | 291.21 | 388.29 | 527.27 | 668.41 | 829.98 | 1025.29 |
| 493.0 | -8.29 | -7.7 | -6.88 | -6.25 | -5.31 | -2.8 | 0.92 | 5.43 | 13.32 | 23.93 | 41.91 | 64.42 | 94.43 | 138.1 | 198.49 | 276.64 | 368.58 | 498.72 | 631.2 | 782.99 | 966.58 |
| 494.0 | -8.37 | -7.65 | -6.87 | -6.13 | -5.15 | -2.67 | 0.92 | 5.39 | 12.92 | 23.32 | 40.79 | 62.15 | 90.7 | 131.78 | 188.7 | 262.24 | 348.63 | 470.4 | 593.87 | 735.53 | 908.18 |
| 495.0 | -8.17 | -7.63 | -6.87 | -6.03 | -5.04 | -2.67 | 0.93 | 5.41 | 12.74 | 22.89 | 39.5 | 60.05 | 87.11 | 125.83 | 179.42 | 248.6 | 329.51 | 443.16 | 557.85 | 689.84 | 850.91 |
| 496.0 | -8.21 | -7.73 | -6.83 | -6.15 | -5.09 | -2.75 | 0.89 | 5.22 | 12.45 | 22.44 | 38.37 | 58.13 | 83.58 | 120.36 | 170.65 | 235.71 | 311.6 | 417.65 | 524.02 | 646.99 | 796.77 |
| 497.0 | -8.13 | -7.84 | -6.77 | -6.14 | -4.99 | -2.62 | 0.8 | 5.18 | 12.2 | 21.98 | 37.51 | 56.35 | 80.42 | 115.09 | 162.56 | 223.39 | 294.09 | 392.97 | 491.41 | 605.72 | 744.15 |
| 498.0 | -8.09 | -7.89 | -6.73 | -6.1 | -4.94 | -2.44 | 0.88 | 5.21 | 12.12 | 21.67 | 36.7 | 54.95 | 77.57 | 110.45 | 155.15 | 211.91 | 278.07 | 370.56 | 461.39 | 567.09 | 694.6 |
| 499.0 | -8.02 | -7.67 | -6.68 | -6.07 | -4.78 | -2.25 | 1.09 | 5.36 | 12.24 | 21.49 | 36.23 | 53.95 | 75.41 | 106.6 | 148.94 | 202.06 | 263.68 | 349.79 | 434.03 | 531.65 | 649.67 |
| 500.0 | -7.94 | -7.72 | -6.69 | -6.12 | -4.73 | -2.18 | 0.99 | 5.39 | 12.17 | 21.2 | 35.75 | 52.91 | 73.47 | 103.24 | 143.27 | 193.36 | 250.95 | 331.36 | 409.03 | 499.57 | 608.12 |
| 501.0 | -7.99 | -7.9 | -6.66 | -6.2 | -4.7 | -2.18 | 0.92 | 5.48 | 12.27 | 21.15 | 35.56 | 52.14 | 72.04 | 100.68 | 138.72 | 186.02 | 240.19 | 315.53 | 387.59 | 471.17 | 571.5 |
| 502.0 | -8.1 | -7.86 | -6.7 | -6.21 | -4.7 | -2.08 | 1.03 | 5.6 | 12.32 | 21.11 | 35.41 | 51.68 | 70.97 | 98.51 | 135.07 | 179.76 | 231.3 | 301.42 | 368.54 | 446.06 | 538.51 |
| 503.0 | -8.14 | -7.9 | -6.93 | -6.37 | -4.79 | -2.06 | 1.01 | 5.59 | 12.32 | 21.23 | 35.54 | 51.6 | 70.29 | 96.99 | 132.18 | 174.71 | 223.83 | 289.99 | 352.6 | 424.83 | 511.15 |
| 504.0 | -8.22 | -8.04 | -7.01 | -6.33 | -4.81 | -2.01 | 1.12 | 5.65 | 12.53 | 21.4 | 35.67 | 51.72 | 70.04 | 96.24 | 130.48 | 171.29 | 218.09 | 281.43 | 340.22 | 407.63 | 488.54 |
| 505.0 | -8.23 | -8 | -7.04 | -6.2 | -4.69 | -1.92 | 1.17 | 5.74 | 12.78 | 21.85 | 36.23 | 51.99 | 70.2 | 96.37 | 129.79 | 169.5 | 214.75 | 275.28 | 330.77 | 394.57 | 470.48 |
| 506.0 | -8.11 | -7.98 | -7.05 | -6.06 | -4.5 | -1.77 | 1.54 | 6.17 | 13.3 | 22.34 | 36.97 | 52.8 | 70.99 | 97.13 | 130.41 | 169.41 | 212.93 | 272.03 | 325.22 | 385.76 | 457.86 |
| 507.0 | -8 | -7.97 | -7.01 | -6.07 | -4.34 | -1.74 | 1.85 | 6.59 | 13.75 | 22.98 | 37.85 | 53.8 | 72.2 | 98.59 | 131.96 | 170.51 | 213.46 | 271.02 | 322.87 | 381.13 | 450.63 |
| 508.0 | -7.8 | -7.92 | -6.85 | -5.98 | -4.1 | -1.51 | 2.28 | 7.13 | 14.25 | 23.7 | 39.1 | 55.27 | 74.11 | 100.7 | 134.32 | 173.06 | 215.41 | 272.83 | 323.53 | 380.44 | 447.64 |
| 509.0 | -7.78 | -7.87 | -6.82 | -6.1 | -3.99 | -1.35 | 2.6 | 7.49 | 14.75 | 24.51 | 40.24 | 56.96 | 76.13 | 103.44 | 138.01 | 177.02 | 219.32 | 277.16 | 327.59 | 383.88 | 449.96 |
| 510.0 | -7.87 | -7.85 | -6.9 | -6.03 | -3.89 | -1.18 | 2.87 | 7.66 | 15.34 | 25.22 | 41.4 | 58.82 | 78.53 | 106.48 | 142.03 | 182.06 | 225.1 | 283.52 | 334.43 | 390.97 | 456.3 |
| 511.0 | -7.67 | -7.72 | -6.8 | -5.91 | -3.68 | -0.9 | 3.17 | 8.15 | 16.18 | 26.34 | 43.09 | 61.06 | 81.56 | 110.61 | 147.32 | 188.27 | 233.26 | 292.53 | 344.34 | 401.95 | 468.25 |
| 512.0 | -7.71 | -7.69 | -6.81 | -5.96 | -3.56 | -0.72 | 3.49 | 8.65 | 16.8 | 27.51 | 44.52 | 63.47 | 84.91 | 115.07 | 153.34 | 195.86 | 242.37 | 303.91 | 357.1 | 416.66 | 484.09 |
| 513.0 | -7.58 | -7.69 | -6.89 | -5.86 | -3.53 | -0.66 | 3.84 | 9.13 | 17.5 | 28.62 | 46.22 | 65.97 | 87.98 | 120.15 | 160.3 | 204.03 | 252.64 | 317.1 | 372.37 | 434.52 | 504.07 |
| 514.0 | -7.64 | -7.64 | -7 | -5.93 | -3.5 | -0.54 | 4.07 | 9.46 | 18.17 | 29.74 | 48.04 | 68.42 | 91.82 | 125.22 | 167.43 | 213.55 | 264.44 | 331.77 | 390.23 | 455.66 | 528.2 |
| 515.0 | -7.52 | -7.51 | -7 | -5.91 | -3.51 | -0.42 | 4.41 | 9.95 | 19.04 | 31.02 | 50.01 | 71.29 | 95.69 | 130.75 | 175.57 | 224.03 | 277.8 | 348.74 | 410.63 | 480.02 | 555.81 |
| 516.0 | -7.71 | -7.64 | -7.04 | -5.86 | -3.45 | -0.32 | 4.62 | 10.46 | 19.73 | 32.17 | 52.01 | 74.32 | 99.61 | 136.44 | 184.18 | 234.92 | 291.93 | 367.09 | 432.71 | 506.17 | 586.93 |
| 517.0 | -7.81 | -7.67 | -7.09 | -5.78 | -3.44 | -0.08 | 4.96 | 11.02 | 20.44 | 33.53 | 54 | 77.41 | 104.17 | 142.75 | 193.16 | 246.72 | 306.98 | 387.28 | 456.99 | 535.33 | 620.97 |
| 518.0 | -7.97 | -7.78 | -7.17 | -5.77 | -3.42 | 0.12 | 5.33 | 11.4 | 21.14 | 34.77 | 56.03 | 80.58 | 108.84 | 149.34 | 202.46 | 259.03 | 323.1 | 408.24 | 483.09 | 566.24 | 657.63 |
| 519.0 | -8.01 | -7.78 | -7.18 | -5.61 | -3.44 | 0.25 | 5.59 | 11.83 | 21.88 | 36.15 | 58.19 | 83.48 | 113.62 | 156.03 | 211.85 | 271.92 | 339.86 | 430 | 509.67 | 598.88 | 696.56 |
| 520.0 | -8.01 | -7.84 | -7.13 | -5.55 | -3.42 | 0.44 | 5.88 | 12.45 | 22.72 | 37.54 | 60.28 | 86.52 | 118.22 | 162.81 | 221.37 | 285.13 | 356.87 | 452.79 | 537.37 | 633.17 | 737.1 |
| 521.0 | -8.05 | -7.77 | -7.1 | -5.49 | -3.37 | 0.6 | 6.31 | 12.94 | 23.27 | 38.73 | 62.23 | 89.69 | 122.6 | 169.42 | 230.76 | 298.46 | 373.96 | 475.94 | 566.07 | 668.4 | 779.02 |
| 522.0 | -8 | -7.69 | -7.13 | -5.38 | -3.26 | 0.86 | 6.68 | 13.39 | 23.99 | 39.88 | 64.19 | 92.71 | 127.13 | 176.37 | 240.56 | 311.77 | 390.97 | 499.25 | 595.52 | 704.69 | 822.19 |
| 523.0 | -7.96 | -7.69 | -7.02 | -5.33 | -3.18 | 1.12 | 6.89 | 13.8 | 24.79 | 41.1 | 66.31 | 95.64 | 131.74 | 183.12 | 250.08 | 325.15 | 407.83 | 522.87 | 625.24 | 740.86 | 866.65 |
| 524.0 | -7.84 | -7.53 | -6.75 | -5.15 | -2.88 | 1.42 | 7.53 | 14.32 | 25.79 | 42.46 | 68.43 | 98.76 | 136.34 | 189.65 | 259.78 | 338.42 | 425.08 | 546.6 | 654.82 | 777.28 | 910.88 |
| 525.0 | -7.83 | -7.5 | -6.78 | -5.14 | -2.79 | 1.52 | 7.76 | 14.76 | 26.4 | 43.62 | 70.25 | 101.52 | 140.67 | 196.04 | 269.04 | 351.24 | 442.46 | 570.18 | 683.79 | 813.97 | 955.42 |
| 526.0 | -7.76 | -7.42 | -6.79 | -5.05 | -2.69 | 1.74 | 8.05 | 15.26 | 27.18 | 44.58 | 72.01 | 104.22 | 144.91 | 202.3 | 278.09 | 363.72 | 459.04 | 593.16 | 713.09 | 849.93 | 1000 |
| 527.0 | -7.86 | -7.43 | -6.89 | -4.98 | -2.68 | 1.9 | 8.15 | 15.65 | 27.88 | 45.65 | 73.71 | 106.83 | 148.74 | 208.39 | 286.65 | 375.92 | 475.66 | 615.6 | 741.93 | 885.87 | 1044.37 |
| 528.0 | -7.95 | -7.43 | -7.01 | -4.99 | -2.74 | 2.01 | 8.23 | 15.95 | 28.45 | 46.51 | 75.1 | 109.18 | 152.51 | 214.14 | 294.88 | 387.89 | 491.69 | 637.73 | 769.93 | 921.08 | 1087.8 |
| 529.0 | -8.12 | -7.4 | -7.16 | -5.16 | -2.8 | 1.98 | 8.19 | 16.08 | 28.85 | 47.31 | 76.58 | 111.44 | 156.01 | 219.67 | 302.8 | 399.04 | 507.18 | 659.14 | 797.43 | 955.49 | 1130.91 |
| 530.0 | -8.24 | -7.52 | -7.2 | -5.11 | -2.76 | 1.97 | 8.26 | 16.31 | 29.18 | 48.09 | 78.09 | 113.6 | 159.56 | 224.79 | 310.27 | 409.55 | 522.07 | 679.5 | 823.78 | 988.74 | 1172.23 |
| 531.0 | -8.05 | -7.42 | -7.02 | -4.93 | -2.59 | 2.15 | 8.38 | 16.82 | 29.56 | 48.94 | 79.62 | 115.77 | 162.85 | 229.47 | 317.62 | 419.74 | 535.77 | 699.13 | 849.12 | 1020.23 | 1212.25 |
| 532.0 | -8.17 | -7.4 | -7.15 | -5.03 | -2.73 | 2.11 | 8.47 | 16.91 | 29.66 | 49.45 | 80.61 | 117.69 | 165.76 | 233.77 | 323.92 | 429.21 | 548.07 | 717.29 | 873.17 | 1050.44 | 1249.59 |
| 533.0 | -8.06 | -7.18 | -6.91 | -4.84 | -2.67 | 2.31 | 8.66 | 17.22 | 30.25 | 50.03 | 81.99 | 119.42 | 168.28 | 237.89 | 329.86 | 438.05 | 559.94 | 734.15 | 895.41 | 1078.24 | 1285.47 |
| 534.0 | -8.19 | -7.19 | -6.83 | -4.87 | -2.74 | 2.24 | 8.71 | 17.47 | 30.54 | 50.43 | 82.99 | 120.86 | 170.67 | 241.21 | 335.09 | 446.29 | 570.98 | 750.08 | 915.73 | 1104.46 | 1319.48 |
| 535.0 | -8.2 | -7.19 | -6.83 | -4.88 | -2.74 | 2.23 | 8.94 | 17.68 | 30.89 | 50.89 | 83.66 | 122.37 | 172.9 | 244.89 | 340.44 | 453.85 | 581.31 | 765.1 | 935.54 | 1129.4 | 1351.51 |
| 536.0 | -8.21 | -7.35 | -6.83 | -4.91 | -2.75 | 2.18 | 8.93 | 17.89 | 31.12 | 51.11 | 84.3 | 123.46 | 174.82 | 248.24 | 344.61 | 459.92 | 589.97 | 777.85 | 953.15 | 1151.98 | 1380.46 |
| 537.0 | -8.1 | -7.22 | -6.7 | -4.89 | -2.68 | 2.3 | 9.03 | 17.82 | 31.39 | 51.3 | 84.8 | 124.35 | 176.89 | 250.9 | 348.29 | 465.97 | 598.07 | 790.02 | 969.48 | 1173.13 | 1407.27 |
| 538.0 | -7.89 | -7.03 | -6.58 | -4.74 | -2.52 | 2.52 | 9.18 | 17.92 | 31.74 | 51.46 | 85.39 | 125.07 | 178.34 | 253.3 | 351.81 | 471.55 | 605.56 | 800.48 | 984.04 | 1192.05 | 1431.8 |
| 539.0 | -7.82 | -6.87 | -6.5 | -4.69 | -2.35 | 2.48 | 9.15 | 18.13 | 32.02 | 51.76 | 85.79 | 125.59 | 179.41 | 255.41 | 354.8 | 476.07 | 611.98 | 810.23 | 996.78 | 1209.2 | 1454.58 |
| 540.0 | -7.76 | -6.77 | -6.43 | -4.85 | -2.23 | 2.5 | 9.26 | 18.24 | 32.12 | 52.01 | 85.94 | 126.33 | 180.29 | 257.05 | 357.31 | 479.98 | 617.56 | 818.54 | 1008.73 | 1224.44 | 1475 |
| 541.0 | -7.69 | -6.77 | -6.36 | -4.91 | -2.16 | 2.48 | 9.3 | 18.16 | 32.05 | 52.21 | 86.01 | 126.61 | 180.91 | 258.33 | 359.2 | 483.18 | 621.97 | 825.86 | 1018.49 | 1237.67 | 1492.89 |
| 542.0 | -7.72 | -6.68 | -6.34 | -4.88 | -2.19 | 2.47 | 9.25 | 18.24 | 32.28 | 52.42 | 86.19 | 126.98 | 181.63 | 259.42 | 360.74 | 485.31 | 626 | 831.72 | 1026.55 | 1249.13 | 1508.32 |
| 543.0 | -7.75 | -6.74 | -6.37 | -4.99 | -2.28 | 2.38 | 9.21 | 18.2 | 32.32 | 52.7 | 86.17 | 127.14 | 182.09 | 260.18 | 361.79 | 487.44 | 629.88 | 836.93 | 1033.57 | 1258.92 | 1522.53 |
| 544.0 | -7.53 | -6.58 | -6.26 | -4.79 | -2.12 | 2.53 | 9.39 | 18.4 | 32.46 | 52.95 | 86.44 | 127.52 | 182.44 | 260.89 | 362.88 | 489.27 | 632.79 | 840.83 | 1038.69 | 1266.93 | 1533.92 |
| 545.0 | -7.6 | -6.73 | -6.26 | -4.81 | -2.24 | 2.51 | 9.21 | 18.44 | 32.32 | 52.67 | 86.29 | 127.48 | 182.28 | 261.27 | 363.54 | 490.36 | 634.25 | 843.18 | 1042.96 | 1272.69 | 1542.64 |
| 546.0 | -7.7 | -6.74 | -6.29 | -4.85 | -2.33 | 2.52 | 8.98 | 18.48 | 32.38 | 52.69 | 86.23 | 127.53 | 182.21 | 261.17 | 363.61 | 490.98 | 634.73 | 844.42 | 1045.86 | 1276.4 | 1548.83 |
| 547.0 | -7.81 | -6.8 | -6.21 | -4.93 | -2.33 | 2.4 | 9 | 18.44 | 32.24 | 52.65 | 86.17 | 127.39 | 181.92 | 260.89 | 363.38 | 491 | 635.19 | 844.87 | 1047.56 | 1279.2 | 1553.42 |
| 548.0 | -7.82 | -6.73 | -6.08 | -5.04 | -2.3 | 2.42 | 9.07 | 18.32 | 32.01 | 52.54 | 86.16 | 127.17 | 181.81 | 260.12 | 362.96 | 490.53 | 634.43 | 844.51 | 1047.98 | 1280.34 | 1555.84 |
| 549.0 | -7.79 | -6.7 | -6.17 | -5.04 | -2.23 | 2.4 | 9 | 18.28 | 31.93 | 52.52 | 86.31 | 127.08 | 181.61 | 259.42 | 362.4 | 489.3 | 633.17 | 843.1 | 1047.18 | 1279.59 | 1556.21 |
| 550.0 | -7.66 | -6.65 | -6.18 | -4.9 | -2.16 | 2.39 | 9.03 | 18.22 | 32.27 | 52.58 | 86.06 | 126.73 | 181.18 | 258.59 | 361.6 | 487.95 | 631.52 | 841.16 | 1045.21 | 1277.75 | 1554.93 |
| 551.0 | -7.69 | -6.56 | -6.19 | -4.8 | -2.23 | 2.55 | 9.06 | 18.19 | 32.33 | 52.57 | 85.81 | 126.47 | 180.6 | 257.93 | 360.36 | 486.34 | 629.56 | 838.56 | 1042.42 | 1274.69 | 1552.25 |
| 552.0 | -7.84 | -6.6 | -6.34 | -5.01 | -2.37 | 2.46 | 9.13 | 18.08 | 32.35 | 52.52 | 85.64 | 126 | 179.8 | 257.18 | 359.15 | 484.74 | 626.99 | 835.23 | 1038.37 | 1271.07 | 1548.22 |
| 553.0 | -7.9 | -6.69 | -6.21 | -5.01 | -2.29 | 2.62 | 9.13 | 18.26 | 32.53 | 52.55 | 85.48 | 125.48 | 179.01 | 256.19 | 357.8 | 482.78 | 624.32 | 831.17 | 1033.39 | 1265.72 | 1542.38 |
| 554.0 | -7.96 | -6.77 | -6.35 | -5.07 | -2.27 | 2.64 | 9.08 | 18.26 | 32.52 | 52.51 | 85.19 | 125.27 | 178.49 | 255.2 | 356.34 | 480.4 | 621.26 | 826.89 | 1028.27 | 1260.1 | 1535.9 |
| 555.0 | -7.97 | -6.85 | -6.4 | -5.02 | -2.18 | 2.86 | 9.15 | 18.12 | 32.6 | 52.58 | 84.77 | 124.92 | 178.01 | 254.47 | 354.61 | 477.86 | 617.97 | 822.39 | 1023.12 | 1253.72 | 1528.1 |
| 556.0 | -7.87 | -7 | -6.41 | -5.04 | -2.14 | 2.91 | 9.03 | 18.21 | 32.59 | 52.48 | 84.52 | 124.47 | 177.16 | 253.04 | 352.45 | 475.15 | 613.98 | 817.29 | 1015.97 | 1245.76 | 1518.46 |
| 557.0 | -7.85 | -6.99 | -6.33 | -4.99 | -1.94 | 3.09 | 9.2 | 18.19 | 32.68 | 52.66 | 84.29 | 124.29 | 176.61 | 251.83 | 350.9 | 472.78 | 610.28 | 811.88 | 1009.22 | 1237.57 | 1508.8 |
| 558.0 | -7.88 | -7.06 | -6.46 | -5.03 | -1.94 | 3.15 | 9.29 | 18.39 | 32.58 | 52.81 | 84.15 | 124.23 | 175.84 | 250.68 | 349.12 | 470.04 | 606.65 | 806.44 | 1001.94 | 1228.93 | 1498.33 |
| 559.0 | -8.07 | -7.25 | -6.61 | -5.19 | -1.96 | 2.97 | 9.29 | 18.46 | 32.47 | 52.92 | 84.04 | 124.14 | 175.42 | 249.46 | 347.34 | 467.35 | 602.76 | 801.11 | 994.79 | 1219.76 | 1487.45 |
| 560.0 | -8.01 | -7.23 | -6.53 | -5.14 | -1.97 | 3.14 | 9.5 | 18.55 | 32.7 | 53.07 | 84.2 | 124.17 | 174.99 | 248.46 | 345.61 | 464.82 | 599.21 | 795.17 | 987.68 | 1210.83 | 1475.9 |
| 561.0 | -7.98 | -7.23 | -6.45 | -5.06 | -1.85 | 3.34 | 9.62 | 18.74 | 33.1 | 53.25 | 84.42 | 124.07 | 174.68 | 247.73 | 344.27 | 462.71 | 595.65 | 790.06 | 980.8 | 1201.9 | 1464.39 |
| 562.0 | -8.07 | -7.31 | -6.59 | -5 | -1.9 | 3.39 | 9.6 | 18.78 | 33.21 | 53.22 | 84.63 | 124.11 | 174.3 | 246.92 | 343.17 | 460.29 | 592.14 | 784.66 | 974.22 | 1192.36 | 1452.75 |
| 563.0 | -8.12 | -7.35 | -6.56 | -4.99 | -1.83 | 3.47 | 9.74 | 18.91 | 33.41 | 53.36 | 84.98 | 124.23 | 174.07 | 246.44 | 342.21 | 458.79 | 589.12 | 779.97 | 967.94 | 1183.5 | 1441.7 |
| 564.0 | -8.3 | -7.4 | -6.51 | -4.94 | -1.79 | 3.63 | 9.87 | 19.17 | 33.63 | 53.42 | 85.39 | 124.69 | 173.94 | 245.87 | 341.26 | 456.86 | 585.88 | 775.29 | 961.59 | 1175.07 | 1430.31 |
| 565.0 | -8.57 | -7.54 | -6.6 | -5.1 | -1.89 | 3.57 | 9.84 | 19.15 | 33.81 | 53.53 | 85.2 | 124.75 | 173.75 | 245.62 | 340.64 | 455.14 | 583.42 | 771.39 | 956.15 | 1167.55 | 1420.3 |
| 566.0 | -8.49 | -7.39 | -6.61 | -4.99 | -1.72 | 3.7 | 10.12 | 19.43 | 34.03 | 54.06 | 85.53 | 125.21 | 173.97 | 245.61 | 340.19 | 454.28 | 581.97 | 768.94 | 951.55 | 1162.1 | 1412.26 |
| 567.0 | -8.42 | -7.37 | -6.55 | -5.06 | -1.62 | 3.82 | 10.43 | 19.54 | 34.13 | 54.28 | 86.02 | 125.8 | 174.32 | 245.97 | 340.33 | 453.62 | 580.86 | 766.52 | 948.32 | 1157.44 | 1404.69 |
| 568.0 | -8.31 | -7.36 | -6.62 | -4.91 | -1.58 | 4.01 | 10.62 | 19.7 | 34.58 | 54.74 | 86.44 | 126.54 | 174.79 | 246.35 | 340.59 | 453.4 | 579.68 | 765 | 945.47 | 1152.87 | 1397.81 |
| 569.0 | -8.2 | -7.3 | -6.66 | -4.75 | -1.42 | 4.17 | 10.88 | 20.13 | 35.1 | 55.28 | 87.08 | 127.43 | 175.58 | 247.51 | 341.05 | 453.78 | 579.76 | 764.47 | 943.52 | 1149.98 | 1392.66 |
| 570.0 | -8.12 | -7.21 | -6.46 | -4.63 | -1.32 | 4.32 | 11.21 | 20.36 | 35.58 | 55.87 | 87.85 | 128.35 | 176.42 | 248.68 | 342.1 | 454.65 | 580.5 | 764.53 | 942.68 | 1147.94 | 1388.7 |
| 571.0 | -8.04 | -7.25 | -6.26 | -4.5 | -1.18 | 4.57 | 11.48 | 20.92 | 35.8 | 56.37 | 88.63 | 129.48 | 177.54 | 250.04 | 343.48 | 456.14 | 582.02 | 765.89 | 943.23 | 1147.86 | 1386.86 |
| 572.0 | -7.94 | -7.26 | -6.25 | -4.44 | -1.11 | 4.68 | 11.57 | 21.22 | 36.18 | 56.8 | 89.48 | 130.38 | 178.68 | 251.26 | 345.48 | 457.95 | 583.48 | 767.32 | 944.41 | 1148.28 | 1385.83 |
| 573.0 | -7.89 | -7.29 | -6.16 | -4.4 | -0.94 | 4.79 | 11.79 | 21.5 | 36.61 | 57.41 | 90.21 | 131.31 | 180.16 | 252.92 | 347.43 | 460.16 | 586.48 | 770.27 | 947.79 | 1150.84 | 1386.94 |
| 574.0 | -7.84 | -7.34 | -6.21 | -4.32 | -0.91 | 4.81 | 11.98 | 21.68 | 36.9 | 58.02 | 91.09 | 132.46 | 181.75 | 254.99 | 349.96 | 462.66 | 589.41 | 774.32 | 951.71 | 1154.25 | 1390.29 |
| 575.0 | -7.87 | -7.38 | -6.22 | -4.34 | -0.87 | 4.89 | 12.33 | 21.88 | 37.19 | 58.68 | 91.85 | 133.46 | 183.2 | 257.29 | 352.72 | 465.93 | 593.79 | 779.09 | 956.97 | 1159.75 | 1395.04 |
| 576.0 | -7.84 | -7.41 | -6.14 | -4.34 | -0.75 | 5.04 | 12.43 | 22.32 | 37.72 | 59.28 | 93.09 | 134.97 | 185.13 | 259.65 | 356.19 | 470.22 | 599.21 | 784.92 | 963.52 | 1167.59 | 1402.39 |
| 577.0 | -7.9 | -7.24 | -6.13 | -4.23 | -0.72 | 5.04 | 12.72 | 22.6 | 38.31 | 60.07 | 94.42 | 136.67 | 187.33 | 262.52 | 360.1 | 475.01 | 605.45 | 792.3 | 972.58 | 1176.87 | 1412.27 |
| 578.0 | -8.08 | -7.25 | -6.16 | -4.14 | -0.82 | 5.14 | 12.87 | 22.9 | 38.76 | 60.66 | 95.68 | 138.3 | 189.41 | 265.37 | 364.06 | 480.5 | 612.34 | 801.01 | 982.09 | 1187.96 | 1423.71 |
| 579.0 | -7.99 | -7.14 | -5.94 | -3.93 | -0.64 | 5.32 | 13.13 | 23.37 | 39.4 | 61.56 | 97.14 | 139.85 | 191.82 | 269.03 | 368.66 | 486.7 | 619.78 | 810.47 | 993.94 | 1201.33 | 1438.22 |
| 580.0 | -8.11 | -7.13 | -5.97 | -3.9 | -0.62 | 5.49 | 13.3 | 23.74 | 40.12 | 62.16 | 98.31 | 141.63 | 194.23 | 272.65 | 373.09 | 492.66 | 627.88 | 820.66 | 1006.46 | 1215.84 | 1453.73 |
| 581.0 | -8.19 | -7.21 | -6.06 | -3.87 | -0.57 | 5.57 | 13.4 | 24.15 | 40.67 | 63.06 | 99.75 | 143.59 | 196.8 | 276.47 | 378.11 | 499.49 | 636.41 | 832.75 | 1019.85 | 1231.92 | 1471.45 |
| 582.0 | -8.21 | -7.23 | -6.11 | -3.74 | -0.49 | 5.71 | 13.63 | 24.53 | 41.05 | 63.87 | 101.11 | 145.62 | 199.69 | 280.36 | 383.3 | 506.5 | 645.65 | 845.07 | 1034.6 | 1249.36 | 1490.58 |
| 583.0 | -8.21 | -7.22 | -6 | -3.68 | -0.39 | 5.79 | 13.84 | 24.95 | 41.73 | 64.81 | 102.53 | 147.59 | 202.7 | 284.47 | 388.82 | 514.24 | 655.76 | 857.93 | 1050.56 | 1268.92 | 1512.5 |
| 584.0 | -8.01 | -7.16 | -5.93 | -3.63 | -0.22 | 6.07 | 14.04 | 25.39 | 42.34 | 66.06 | 104.13 | 149.7 | 206.03 | 288.9 | 395.08 | 522.45 | 666.34 | 872.44 | 1068.75 | 1289.62 | 1536.6 |
| 585.0 | -7.96 | -7.17 | -6.01 | -3.71 | -0.2 | 6.06 | 14.26 | 25.55 | 42.87 | 67.1 | 105.49 | 151.73 | 209.37 | 293.71 | 401.21 | 531.53 | 678.11 | 887.56 | 1087.71 | 1312.1 | 1562.46 |
| 586.0 | -7.97 | -7.11 | -5.99 | -3.71 | -0.06 | 6.09 | 14.47 | 25.94 | 43.52 | 68.07 | 107.35 | 154.35 | 212.9 | 298.66 | 407.67 | 540.66 | 689.83 | 903.69 | 1108.11 | 1336.33 | 1590.02 |
| 587.0 | -8.04 | -7.1 | -5.93 | -3.74 | 0.06 | 6.18 | 14.6 | 26.17 | 44.29 | 69.11 | 109.04 | 156.75 | 216.5 | 303.84 | 414.74 | 550.36 | 702.32 | 919.92 | 1129.01 | 1361.47 | 1618.72 |
| 588.0 | -7.97 | -7.05 | -5.89 | -3.62 | 0.21 | 6.37 | 14.94 | 26.8 | 45.15 | 70.19 | 110.68 | 159.18 | 220.28 | 309.47 | 422.34 | 560.35 | 715.3 | 937.96 | 1150.79 | 1387.59 | 1649.15 |
| 589.0 | -8.09 | -7.18 | -5.99 | -3.77 | 0.22 | 6.35 | 15.03 | 27.14 | 45.72 | 70.93 | 112.26 | 161.32 | 223.82 | 314.79 | 429.45 | 570.45 | 728.2 | 955.83 | 1172.4 | 1414.96 | 1680.1 |
| 590.0 | -8.18 | -7.27 | -5.95 | -3.76 | 0.15 | 6.45 | 15.15 | 27.3 | 46.3 | 71.79 | 113.74 | 163.77 | 227.42 | 319.98 | 437.01 | 581.03 | 741.75 | 974.04 | 1195.26 | 1442.75 | 1712.5 |
| 591.0 | -8.33 | -7.38 | -5.86 | -3.79 | 0.2 | 6.61 | 15.31 | 27.69 | 46.7 | 72.66 | 115.26 | 166 | 231.06 | 325.23 | 444.41 | 591.57 | 755.33 | 992.26 | 1218.1 | 1471.32 | 1746.15 |
| 592.0 | -8.4 | -7.36 | -5.97 | -3.95 | 0.18 | 6.73 | 15.51 | 27.88 | 47.34 | 73.67 | 117.03 | 168.57 | 234.82 | 331 | 451.96 | 602.59 | 769.3 | 1010.96 | 1242.07 | 1500.33 | 1780.02 |
| 593.0 | -8.38 | -7.39 | -5.85 | -3.96 | 0.4 | 6.86 | 15.74 | 28.35 | 48.1 | 74.88 | 118.71 | 171.18 | 238.67 | 336.84 | 459.61 | 613.89 | 783.84 | 1031 | 1266.5 | 1530.33 | 1815.25 |
| 594.0 | -8.3 | -7.35 | -5.88 | -3.92 | 0.52 | 6.98 | 15.93 | 28.8 | 48.76 | 76.04 | 120.59 | 174.01 | 242.62 | 342.65 | 467.44 | 624.89 | 797.9 | 1050.56 | 1290.62 | 1560.58 | 1850.83 |
| 595.0 | -8.18 | -7.22 | -5.77 | -3.85 | 0.71 | 7.24 | 16.18 | 29.23 | 49.5 | 77.09 | 122.48 | 176.69 | 246.71 | 348.23 | 475.43 | 636.04 | 813.17 | 1071.19 | 1315.8 | 1591.86 | 1887.12 |
| 596.0 | -8.19 | -7.34 | -5.87 | -3.92 | 0.64 | 7.28 | 16.24 | 29.59 | 50.05 | 77.87 | 124.26 | 179.15 | 250.66 | 353.4 | 483.05 | 647.24 | 827.22 | 1090.96 | 1340.54 | 1622.35 | 1923.24 |
| 597.0 | -8.17 | -7.14 | -5.83 | -3.8 | 0.72 | 7.37 | 16.57 | 30.02 | 50.66 | 78.91 | 125.78 | 181.63 | 254.61 | 358.9 | 490.82 | 658.28 | 841.33 | 1111.27 | 1365.59 | 1652.45 | 1959.43 |
| 598.0 | -8.24 | -7.34 | -5.88 | -3.75 | 0.85 | 7.59 | 16.73 | 30.28 | 51.14 | 79.86 | 127.27 | 184.01 | 258.3 | 364.25 | 498.21 | 668.96 | 855.09 | 1130.88 | 1389.6 | 1682.57 | 1994.96 |
| 599.0 | -8.08 | -7.23 | -5.83 | -3.68 | 0.98 | 7.73 | 16.9 | 30.62 | 51.73 | 80.85 | 129.13 | 186.35 | 262.2 | 369.54 | 505.86 | 680.02 | 869.28 | 1150.55 | 1414.59 | 1712.52 | 2031.56 |
| 600.0 | -8.13 | -7.25 | -5.94 | -3.72 | 1.06 | 7.87 | 17.11 | 30.95 | 52.47 | 81.82 | 130.79 | 188.89 | 265.79 | 374.61 | 513.15 | 690.08 | 882.57 | 1169.86 | 1437.74 | 1741 | 2065.94 |
| 601.0 | -8.03 | -7.14 | -5.81 | -3.64 | 1.23 | 7.99 | 17.33 | 31.17 | 52.94 | 83.07 | 132.37 | 191 | 269.21 | 379.34 | 520.75 | 700.35 | 896.28 | 1188.91 | 1461.16 | 1769.32 | 2100.68 |
| 602.0 | -8.01 | -7.17 | -5.8 | -3.63 | 1.29 | 8 | 17.53 | 31.35 | 53.34 | 83.75 | 133.66 | 193.04 | 272.76 | 384 | 527.83 | 710.33 | 909.39 | 1206.49 | 1484.23 | 1796.54 | 2134.22 |
| 603.0 | -8.05 | -7.18 | -5.84 | -3.59 | 1.33 | 8.06 | 17.68 | 31.61 | 53.96 | 84.49 | 135.17 | 195.23 | 276.05 | 388.9 | 535.24 | 720.09 | 922.53 | 1224.33 | 1506.7 | 1824.28 | 2167.29 |
| 604.0 | -8.04 | -7.13 | -5.87 | -3.47 | 1.29 | 8.21 | 18.05 | 31.91 | 54.39 | 85.23 | 136.61 | 197.63 | 279.07 | 393.75 | 541.9 | 729.55 | 935.49 | 1242.27 | 1528.72 | 1850.82 | 2199.46 |
| 605.0 | -8.15 | -7.11 | -5.88 | -3.34 | 1.34 | 8.25 | 18.26 | 32.2 | 54.7 | 85.83 | 137.72 | 199.48 | 281.85 | 398.15 | 548.15 | 738.81 | 947.24 | 1258.93 | 1549.15 | 1876.89 | 2230.52 |
| 606.0 | -8.1 | -7.01 | -5.73 | -3.19 | 1.57 | 8.43 | 18.42 | 32.67 | 55.27 | 86.55 | 139.08 | 201.47 | 284.53 | 402.47 | 554.55 | 746.95 | 958.34 | 1274.26 | 1568.49 | 1901.49 | 2259.97 |
| 607.0 | -8.05 | -7.18 | -5.8 | -3.1 | 1.61 | 8.54 | 18.53 | 32.86 | 55.52 | 87.17 | 140.16 | 202.96 | 286.95 | 406.09 | 560.31 | 755.22 | 968.72 | 1289.25 | 1587.04 | 1924.47 | 2287.01 |
| 608.0 | -8.09 | -7.2 | -5.91 | -3.13 | 1.45 | 8.58 | 18.43 | 33.02 | 55.73 | 87.55 | 141.08 | 204.29 | 289.47 | 409.37 | 565.3 | 762.84 | 978.71 | 1303.08 | 1604.51 | 1945.58 | 2312.93 |
| 609.0 | -8.12 | -7.26 | -5.95 | -3.07 | 1.52 | 8.61 | 18.49 | 33.12 | 56.14 | 88.21 | 142.13 | 205.65 | 291.76 | 412.46 | 569.86 | 769.73 | 988.55 | 1315.85 | 1620.95 | 1966.23 | 2337.98 |
| 610.0 | -8.1 | -7.21 | -5.85 | -3.03 | 1.55 | 8.71 | 18.62 | 33.25 | 56.51 | 88.95 | 143.1 | 207.37 | 294.08 | 415.55 | 574.66 | 776.69 | 997.74 | 1328.14 | 1637.15 | 1985.03 | 2362.01 |
| 611.0 | -8.11 | -7.21 | -5.84 | -2.9 | 1.55 | 8.69 | 18.69 | 33.59 | 56.8 | 89.55 | 143.86 | 208.52 | 296.07 | 418.24 | 579.05 | 782.76 | 1006.17 | 1339.72 | 1652.07 | 2002.55 | 2384.18 |
| 612.0 | -7.93 | -7.18 | -5.85 | -2.72 | 1.68 | 8.79 | 18.77 | 33.94 | 57.35 | 90.27 | 144.71 | 210.2 | 298.11 | 421.11 | 583.17 | 788.58 | 1013.75 | 1350.71 | 1665.93 | 2018.98 | 2404.52 |
| 613.0 | -8.09 | -7.34 | -5.94 | -2.67 | 1.7 | 8.76 | 18.72 | 34.03 | 57.5 | 90.55 | 145.09 | 211.13 | 299.42 | 423.1 | 586.7 | 793.43 | 1020.8 | 1360.31 | 1677.74 | 2034.09 | 2422.21 |
| 614.0 | -8.08 | -7.33 | -5.92 | -2.67 | 1.67 | 8.8 | 18.85 | 34.06 | 57.82 | 90.83 | 145.73 | 212.18 | 300.77 | 425.13 | 589.56 | 797.67 | 1027.37 | 1368.41 | 1688.76 | 2047.4 | 2438.83 |
| 615.0 | -8.15 | -7.32 | -5.88 | -2.62 | 1.63 | 8.78 | 18.87 | 34.24 | 57.93 | 91.15 | 146 | 213.23 | 302 | 426.88 | 592.27 | 801.79 | 1033.23 | 1375.97 | 1698.82 | 2058.73 | 2453.93 |
| 616.0 | -8.2 | -7.37 | -5.9 | -2.68 | 1.58 | 8.69 | 18.83 | 34.33 | 58.01 | 91.47 | 146.36 | 214.02 | 302.93 | 428.4 | 594.4 | 805.33 | 1037.5 | 1381.2 | 1707.04 | 2068.57 | 2466.2 |
| 617.0 | -8.18 | -7.32 | -5.76 | -2.58 | 1.67 | 8.75 | 19.01 | 34.55 | 58.39 | 91.86 | 146.73 | 214.63 | 304.04 | 430 | 596.48 | 808.46 | 1042.03 | 1387 | 1715.02 | 2078.11 | 2477.62 |
| 618.0 | -8.24 | -7.39 | -5.77 | -2.65 | 1.66 | 8.74 | 18.99 | 34.62 | 58.56 | 92.16 | 147.17 | 215.04 | 304.67 | 431.07 | 598.07 | 810.53 | 1045.31 | 1391.39 | 1721.35 | 2085.63 | 2487.27 |
| 619.0 | -8.22 | -7.37 | -5.67 | -2.81 | 1.65 | 8.76 | 18.98 | 34.7 | 58.58 | 92.32 | 147.4 | 215.42 | 305.17 | 432 | 599.43 | 812.01 | 1047.89 | 1394.15 | 1726.03 | 2091.57 | 2494.31 |
| 620.0 | -8.24 | -7.42 | -5.71 | -2.98 | 1.56 | 8.69 | 19.06 | 34.79 | 58.76 | 92.48 | 147.45 | 215.78 | 305.58 | 432.8 | 600.09 | 812.75 | 1049.73 | 1396.57 | 1729.07 | 2095.4 | 2499.39 |
| 621.0 | -8.29 | -7.45 | -5.64 | -3.02 | 1.48 | 8.59 | 19.05 | 34.58 | 58.62 | 92.34 | 147.37 | 216.14 | 305.64 | 433.15 | 600.76 | 813.86 | 1051.32 | 1397.93 | 1731.65 | 2098.81 | 2503.66 |
| 622.0 | -8.2 | -7.45 | -5.66 | -2.97 | 1.44 | 8.64 | 19.18 | 34.76 | 58.87 | 92.19 | 147.33 | 216.72 | 305.72 | 433.64 | 601.05 | 814.42 | 1051.55 | 1398.7 | 1733.09 | 2101.29 | 2506.66 |
| 623.0 | -8.21 | -7.47 | -5.74 | -3.03 | 1.26 | 8.65 | 19.23 | 34.78 | 58.78 | 92.16 | 147.16 | 216.82 | 305.58 | 433.46 | 600.89 | 814.77 | 1051.57 | 1398.83 | 1733.5 | 2102.01 | 2507.69 |
| 624.0 | -8.23 | -7.52 | -5.76 | -3.15 | 1.19 | 8.58 | 19.28 | 34.62 | 58.5 | 92.18 | 146.86 | 216.51 | 305.68 | 432.92 | 600.34 | 814.32 | 1051.09 | 1398.18 | 1733.29 | 2100.97 | 2507.32 |
| 625.0 | -8.1 | -7.42 | -5.61 | -3.17 | 1.36 | 8.58 | 19.16 | 34.76 | 58.67 | 92.39 | 146.7 | 216.18 | 305.72 | 432.42 | 599.84 | 813.33 | 1050.12 | 1396.4 | 1732.11 | 2099.32 | 2505.18 |
| 626.0 | -8.05 | -7.6 | -5.76 | -3.32 | 1.26 | 8.51 | 19.08 | 34.66 | 58.78 | 92.24 | 146.55 | 216.05 | 305.38 | 431.89 | 598.75 | 811.81 | 1049.09 | 1394.04 | 1729.02 | 2095.95 | 2501.81 |
| 627.0 | -7.99 | -7.58 | -5.73 | -3.28 | 1.24 | 8.57 | 19.1 | 34.59 | 58.65 | 92.04 | 146.37 | 215.69 | 305.18 | 430.95 | 597.54 | 811.05 | 1046.83 | 1391.59 | 1726.07 | 2091.87 | 2497.33 |
| 628.0 | -7.96 | -7.31 | -5.56 | -3.2 | 1.29 | 8.65 | 19.16 | 34.6 | 58.68 | 92.25 | 146.23 | 215.4 | 304.92 | 430.35 | 596.24 | 809.84 | 1045.19 | 1388.61 | 1722.1 | 2086.89 | 2492.8 |
| 629.0 | -7.83 | -7.33 | -5.46 | -3.12 | 1.4 | 8.67 | 19.31 | 34.6 | 58.59 | 92.04 | 145.91 | 215.24 | 304.16 | 429.61 | 594.76 | 807.59 | 1042.64 | 1385.26 | 1717.76 | 2081.61 | 2487.4 |
| 630.0 | -7.72 | -7.33 | -5.4 | -3 | 1.37 | 8.67 | 19.41 | 34.67 | 58.62 | 91.91 | 145.6 | 215.03 | 303.47 | 428.51 | 593.26 | 805.21 | 1039.92 | 1381.42 | 1712.53 | 2074.85 | 2479.83 |
| 631.0 | -7.68 | -7.27 | -5.35 | -2.92 | 1.38 | 8.77 | 19.43 | 34.8 | 58.47 | 91.89 | 145.21 | 214.53 | 302.83 | 427.59 | 591.79 | 802.92 | 1036.88 | 1377.73 | 1707.44 | 2068.94 | 2473.03 |
| 632.0 | -7.51 | -7.13 | -5.35 | -2.92 | 1.54 | 8.86 | 19.6 | 34.79 | 58.52 | 91.9 | 145.03 | 214.27 | 302.16 | 426.4 | 590.23 | 800.42 | 1033.86 | 1373.5 | 1701.77 | 2062.65 | 2464.61 |
| 633.0 | -7.6 | -7.1 | -5.44 | -3.11 | 1.33 | 8.82 | 19.6 | 34.59 | 58.43 | 91.6 | 144.65 | 213.28 | 301.36 | 425.25 | 588.54 | 797.93 | 1031.15 | 1369.13 | 1695.98 | 2056 | 2455.78 |
| 634.0 | -7.55 | -6.96 | -5.35 | -3.15 | 1.33 | 8.74 | 19.63 | 34.61 | 58.25 | 91.34 | 144.33 | 212.73 | 300.87 | 424.19 | 586.71 | 795.7 | 1027.43 | 1364.6 | 1690.17 | 2048.54 | 2448.23 |
| 635.0 | -7.45 | -6.86 | -5.33 | -3.07 | 1.44 | 8.79 | 19.71 | 34.63 | 58.08 | 91.31 | 144.03 | 212.42 | 300.21 | 423.15 | 585.08 | 793.48 | 1023.9 | 1360.17 | 1684.93 | 2042.24 | 2440.14 |
| 636.0 | -7.44 | -6.89 | -5.39 | -3.12 | 1.43 | 9 | 19.77 | 34.38 | 58.19 | 91.09 | 143.87 | 211.62 | 299.23 | 421.95 | 583.2 | 790.56 | 1020.26 | 1355.88 | 1678.97 | 2035.53 | 2430.88 |
| 637.0 | -7.52 | -6.9 | -5.4 | -3.2 | 1.47 | 9.06 | 19.84 | 34.28 | 58.23 | 90.64 | 143.57 | 210.77 | 298.65 | 420.75 | 581.88 | 788.29 | 1017.1 | 1351.68 | 1673.62 | 2028.35 | 2422.7 |
| 638.0 | -7.49 | -6.89 | -5.39 | -3.16 | 1.55 | 9.04 | 19.73 | 34.19 | 58.02 | 90.58 | 143.27 | 210.57 | 297.84 | 419.69 | 580.48 | 785.91 | 1013.9 | 1347.63 | 1667.81 | 2021.27 | 2414.52 |
| 639.0 | -7.3 | -6.71 | -5.3 | -3.01 | 1.76 | 9.09 | 19.89 | 34.25 | 58.07 | 90.54 | 143.15 | 210.42 | 297.21 | 418.91 | 578.83 | 784.11 | 1010.79 | 1343.24 | 1662.89 | 2014.06 | 2405.51 |
| 640.0 | -7.13 | -6.51 | -5.26 | -2.81 | 1.68 | 9.17 | 19.91 | 34.28 | 58.22 | 90.49 | 143 | 209.91 | 296.56 | 418.03 | 577.53 | 782.31 | 1008.65 | 1339.61 | 1658.68 | 2008 | 2398.45 |
| 641.0 | -7.04 | -6.51 | -5.17 | -2.71 | 1.85 | 9.31 | 19.94 | 34.26 | 58.06 | 90.22 | 142.77 | 209.5 | 296 | 417.06 | 576.51 | 780.38 | 1005.76 | 1335.69 | 1654.57 | 2002.99 | 2391.4 |
| 642.0 | -7.07 | -6.43 | -5.23 | -2.74 | 1.75 | 9.26 | 19.95 | 34.39 | 57.92 | 90.33 | 142.55 | 208.88 | 295.69 | 416.15 | 575.26 | 778.69 | 1003.47 | 1331.98 | 1650.95 | 1997.49 | 2384.74 |
| 643.0 | -7.02 | -6.41 | -5.23 | -2.76 | 1.75 | 9.38 | 19.79 | 34.38 | 57.55 | 90.39 | 142.47 | 208.36 | 295.44 | 415.43 | 574.18 | 777.02 | 1001.56 | 1328.11 | 1646.89 | 1992.51 | 2378.65 |
| 644.0 | -7.03 | -6.29 | -5.08 | -2.71 | 1.86 | 9.51 | 19.81 | 34.51 | 57.62 | 90.26 | 142.35 | 207.91 | 295.1 | 414.97 | 573.38 | 775.01 | 999.59 | 1325.12 | 1643.22 | 1987.84 | 2373.2 |
| 645.0 | -7.04 | -6.24 | -5.06 | -2.71 | 1.75 | 9.41 | 19.71 | 34.55 | 57.65 | 90.16 | 142.27 | 207.68 | 294.17 | 414.57 | 572.1 | 773.36 | 997.31 | 1322.19 | 1639.44 | 1983.91 | 2367.59 |
| 646.0 | -7.17 | -6.37 | -5.2 | -2.71 | 1.73 | 9.57 | 19.7 | 34.31 | 57.56 | 89.98 | 142.19 | 207.46 | 293.8 | 413.83 | 571.29 | 772.4 | 995.47 | 1320.25 | 1636.26 | 1979.92 | 2362.93 |
| 647.0 | -7.21 | -6.23 | -5.08 | -2.71 | 1.73 | 9.6 | 19.66 | 34.2 | 57.57 | 89.88 | 141.94 | 207.29 | 293.31 | 412.96 | 570.77 | 771.3 | 994 | 1318.48 | 1634.72 | 1976.52 | 2357.99 |
| 648.0 | -7.12 | -6.16 | -5.06 | -2.79 | 1.77 | 9.64 | 19.59 | 34.19 | 57.65 | 89.97 | 141.95 | 207.18 | 292.94 | 412.71 | 570.23 | 770.41 | 993.5 | 1317.22 | 1632.86 | 1973.53 | 2354.89 |
| 649.0 | -7.08 | -6.21 | -5.15 | -2.83 | 1.79 | 9.62 | 19.58 | 34.2 | 57.65 | 89.65 | 141.86 | 207.26 | 292.98 | 412.17 | 570.06 | 769.13 | 992.25 | 1315.97 | 1631.22 | 1971.78 | 2351.4 |
| 650.0 | -7.06 | -6.23 | -5.14 | -2.87 | 1.94 | 9.73 | 19.57 | 34.19 | 57.84 | 89.78 | 142.02 | 207.31 | 292.71 | 412.1 | 570.29 | 768.64 | 991.86 | 1315.25 | 1630.6 | 1970.18 | 2348.66 |
| 651.0 | -7.08 | -6.07 | -5.04 | -2.92 | 1.9 | 9.79 | 19.65 | 34.18 | 57.7 | 89.96 | 142.08 | 207.29 | 292.61 | 412.16 | 570.24 | 768.93 | 991.49 | 1314.81 | 1630.26 | 1969.7 | 2347.73 |
| 652.0 | -7.01 | -6 | -5.03 | -2.9 | 2.01 | 9.71 | 19.75 | 34.17 | 57.66 | 90.02 | 142.12 | 207.23 | 292.35 | 411.96 | 570.17 | 768.73 | 991.72 | 1314.44 | 1629.98 | 1968.78 | 2345.9 |
| 653.0 | -7.18 | -6.02 | -5 | -2.96 | 1.91 | 9.69 | 19.51 | 34.05 | 57.49 | 89.94 | 141.93 | 207.09 | 291.91 | 412 | 569.81 | 768.58 | 991.17 | 1314.42 | 1629.28 | 1967.94 | 2344.82 |
| 654.0 | -7.12 | -6.06 | -5 | -2.91 | 2.09 | 9.66 | 19.49 | 33.92 | 57.51 | 89.92 | 141.78 | 207.34 | 291.75 | 411.87 | 569.55 | 768.66 | 990.82 | 1314.3 | 1629.62 | 1968.06 | 2344.88 |
| 655.0 | -7.03 | -6.08 | -5.04 | -2.8 | 2.08 | 9.77 | 19.51 | 33.96 | 57.64 | 90.31 | 141.99 | 207.32 | 291.85 | 411.74 | 569.65 | 768.3 | 990.98 | 1314.37 | 1630.07 | 1968.5 | 2344.79 |
| 656.0 | -7.26 | -6.19 | -5.19 | -2.9 | 1.95 | 9.65 | 19.35 | 33.87 | 57.5 | 90.09 | 141.86 | 207.02 | 292.02 | 411.79 | 569.79 | 768.13 | 990.71 | 1314.21 | 1630.11 | 1968.45 | 2345.09 |
| 657.0 | -7.34 | -6.27 | -5.22 | -2.96 | 1.91 | 9.47 | 19.24 | 33.93 | 57.22 | 90.04 | 141.71 | 206.88 | 292.21 | 411.69 | 569.5 | 768.15 | 990.92 | 1314.16 | 1630.47 | 1968.64 | 2345.83 |
| 658.0 | -7.36 | -6.29 | -5.31 | -2.93 | 1.85 | 9.39 | 19.16 | 33.85 | 57.23 | 90.15 | 141.44 | 206.95 | 291.98 | 411.61 | 569.21 | 768.35 | 991.15 | 1314.41 | 1631.04 | 1970.22 | 2346.91 |
| 659.0 | -7.34 | -6.16 | -5.31 | -2.8 | 1.87 | 9.46 | 19.23 | 33.81 | 57.46 | 90.29 | 141.48 | 206.95 | 291.99 | 411.45 | 569.47 | 768.35 | 991.55 | 1314.64 | 1631.35 | 1970.73 | 2347.99 |
| 660.0 | -7.49 | -6.31 | -5.34 | -2.98 | 1.7 | 9.47 | 19.19 | 33.65 | 57.35 | 90.06 | 141.5 | 206.66 | 291.72 | 411.09 | 569.35 | 767.85 | 991.75 | 1314.93 | 1631.4 | 1971.49 | 2348.7 |
| 661.0 | -7.54 | -6.36 | -5.38 | -3.04 | 1.81 | 9.39 | 19.13 | 33.5 | 57.13 | 89.76 | 141.34 | 206.66 | 291.53 | 410.78 | 568.94 | 767.89 | 991.05 | 1315.09 | 1630.79 | 1971.76 | 2349.05 |
| 662.0 | -7.57 | -6.3 | -5.43 | -2.98 | 1.66 | 9.3 | 19.05 | 33.53 | 57.31 | 89.7 | 141.18 | 206.6 | 291.35 | 410.69 | 568.93 | 768.09 | 991.38 | 1316.3 | 1631.29 | 1972.06 | 2350.24 |
| 663.0 | -7.59 | -6.38 | -5.45 | -2.98 | 1.66 | 9.37 | 18.92 | 33.39 | 57.33 | 89.85 | 141.18 | 206.39 | 291.2 | 410.98 | 568.81 | 767.88 | 991.83 | 1317.36 | 1632.52 | 1973.14 | 2351.84 |
| 664.0 | -7.78 | -6.47 | -5.5 | -3.06 | 1.52 | 9.2 | 18.93 | 33.33 | 57.4 | 89.88 | 141.08 | 206.27 | 290.97 | 410.81 | 568.66 | 767.62 | 991.91 | 1318.68 | 1633.4 | 1973.65 | 2351.79 |
| 665.0 | -7.62 | -6.53 | -5.61 | -3.04 | 1.55 | 9.07 | 18.67 | 33.13 | 57.24 | 89.66 | 140.85 | 206.34 | 290.62 | 410.5 | 568.39 | 767.58 | 992.24 | 1319.04 | 1633.79 | 1974.46 | 2352.34 |
| 666.0 | -7.56 | -6.54 | -5.6 | -3.01 | 1.78 | 9.12 | 18.63 | 33.24 | 57.43 | 89.62 | 140.78 | 206.46 | 290.64 | 410.37 | 568.18 | 767.49 | 992.45 | 1319.39 | 1634.13 | 1974.79 | 2353.19 |
| 667.0 | -7.47 | -6.46 | -5.43 | -3.01 | 1.67 | 9.04 | 18.7 | 33.31 | 57.41 | 89.7 | 140.61 | 206.2 | 290.34 | 410.19 | 567.76 | 767.04 | 992.08 | 1319.08 | 1633.82 | 1975.07 | 2353.57 |
| 668.0 | -7.38 | -6.46 | -5.36 | -2.84 | 1.74 | 8.96 | 18.76 | 33.38 | 57.39 | 89.71 | 140.53 | 206.08 | 290.21 | 410.25 | 567.42 | 766.83 | 991.61 | 1318.89 | 1633.13 | 1975.45 | 2354.3 |
| 669.0 | -7.53 | -6.56 | -5.5 | -2.84 | 1.55 | 8.85 | 18.72 | 33.17 | 57.16 | 89.62 | 140.18 | 205.69 | 290 | 409.72 | 566.94 | 765.99 | 990.41 | 1318.3 | 1632.67 | 1975.14 | 2353.6 |
| 670.0 | -7.61 | -6.64 | -5.43 | -2.91 | 1.4 | 8.7 | 18.63 | 33.03 | 57.15 | 89.42 | 139.79 | 205.19 | 289.14 | 409.32 | 565.88 | 765.05 | 989.77 | 1316.71 | 1631.89 | 1973.94 | 2352.89 |
| 671.0 | -7.74 | -6.69 | -5.6 | -3.01 | 1.29 | 8.4 | 18.54 | 32.96 | 56.88 | 89.33 | 139.29 | 204.57 | 288.72 | 408.31 | 564.38 | 763.78 | 988.11 | 1315.07 | 1629.97 | 1972.55 | 2350.97 |
| 672.0 | -7.8 | -6.85 | -5.75 | -3.16 | 1.25 | 8.18 | 18.26 | 32.71 | 56.57 | 88.78 | 138.65 | 203.69 | 287.74 | 407.31 | 562.85 | 762.04 | 985.52 | 1312.99 | 1628.07 | 1969.91 | 2348.79 |
| 673.0 | -7.69 | -6.87 | -5.73 | -3.16 | 1.22 | 8.21 | 18.21 | 32.6 | 56.61 | 88.5 | 138.41 | 203.26 | 287.37 | 406.59 | 561.29 | 760.21 | 983.45 | 1310.14 | 1624.89 | 1967.21 | 2346.22 |
| 674.0 | -7.66 | -6.93 | -5.81 | -3.25 | 1.21 | 8.24 | 18.17 | 32.56 | 56.5 | 88.03 | 138.2 | 202.67 | 286.93 | 405.57 | 559.82 | 758.36 | 981.38 | 1307.15 | 1622.62 | 1964.24 | 2342.35 |
| 675.0 | -7.61 | -6.92 | -5.71 | -3.24 | 1.08 | 8.24 | 18.09 | 32.64 | 56.3 | 87.85 | 137.81 | 202.12 | 286.12 | 404.41 | 558.22 | 756.25 | 978.46 | 1304.15 | 1619.54 | 1960.89 | 2337.61 |
| 676.0 | -7.78 | -7.08 | -5.79 | -3.42 | 0.98 | 8.1 | 17.9 | 32.36 | 56 | 87.31 | 137.24 | 201.27 | 284.92 | 402.96 | 556.16 | 753.92 | 975.11 | 1299.78 | 1615.23 | 1956.34 | 2331.32 |
| 677.0 | -7.73 | -7.11 | -5.71 | -3.38 | 0.84 | 8.09 | 17.89 | 32.25 | 55.86 | 87.13 | 136.46 | 200.52 | 283.47 | 401.49 | 554.21 | 750.98 | 972.08 | 1295.66 | 1610.63 | 1950.98 | 2324.22 |
| 678.0 | -7.57 | -7.05 | -5.65 | -3.14 | 0.96 | 8.2 | 17.85 | 32.14 | 55.98 | 86.77 | 136.1 | 199.87 | 282.37 | 400.35 | 552.66 | 748.27 | 968.66 | 1291.37 | 1605.85 | 1945.12 | 2318.28 |
| 679.0 | -7.51 | -6.96 | -5.55 | -3.08 | 0.9 | 8.17 | 17.85 | 32.05 | 55.78 | 86.67 | 135.63 | 199.28 | 281.21 | 398.9 | 550.3 | 745.35 | 965.45 | 1287.44 | 1600.5 | 1939.02 | 2311.24 |
| 680.0 | -7.54 | -7.03 | -5.52 | -3.18 | 0.87 | 8.11 | 17.78 | 31.9 | 55.36 | 86.04 | 135.08 | 198.26 | 280.05 | 397.1 | 547.57 | 741.94 | 961.55 | 1282.71 | 1594.52 | 1932.77 | 2302.44 |
| 681.0 | -7.54 | -7.09 | -5.58 | -3.21 | 0.68 | 7.93 | 17.57 | 31.71 | 54.97 | 85.65 | 134.13 | 197.15 | 278.66 | 395.28 | 545.32 | 738.52 | 957.3 | 1277.82 | 1588.29 | 1925.62 | 2293.93 |
| 682.0 | -7.48 | -7.13 | -5.6 | -3.2 | 0.59 | 7.92 | 17.52 | 31.68 | 54.86 | 85.52 | 133.42 | 196.2 | 277.75 | 393.59 | 543.06 | 734.75 | 953.55 | 1273.06 | 1581.9 | 1918.18 | 2285.2 |
| 683.0 | -7.5 | -7.17 | -5.55 | -3.22 | 0.52 | 7.83 | 17.34 | 31.44 | 54.38 | 85.24 | 132.56 | 195.13 | 276.29 | 391.51 | 539.85 | 730.85 | 948.58 | 1266.14 | 1574.02 | 1909.73 | 2273.99 |
| 684.0 | -7.39 | -7.06 | -5.43 | -3.1 | 0.64 | 7.91 | 17.32 | 31.41 | 54.16 | 84.49 | 131.82 | 194.34 | 274.94 | 389.12 | 536.62 | 726.71 | 943.04 | 1259.31 | 1565.19 | 1900.39 | 2262.39 |
| 685.0 | -7.31 | -6.98 | -5.44 | -3.1 | 0.66 | 7.85 | 17.14 | 31.08 | 53.83 | 83.87 | 130.93 | 193.13 | 272.96 | 386.9 | 533.02 | 722.82 | 937.54 | 1251.12 | 1555.82 | 1890.1 | 2250.94 |
| 686.0 | -7.4 | -7.01 | -5.46 | -3.06 | 0.67 | 7.76 | 17.22 | 31.03 | 53.66 | 83.55 | 130.24 | 191.85 | 271.51 | 384.66 | 529.76 | 718.3 | 931.47 | 1243.85 | 1546.79 | 1879.93 | 2239.08 |
| 687.0 | -7.44 | -6.98 | -5.44 | -3.14 | 0.58 | 7.65 | 17.02 | 30.8 | 53.15 | 83 | 129.3 | 190.58 | 269.63 | 382 | 526.83 | 713.86 | 925.46 | 1236.27 | 1537.98 | 1869.16 | 2226.96 |
| 688.0 | -7.49 | -6.98 | -5.65 | -3.2 | 0.57 | 7.44 | 16.78 | 30.53 | 52.79 | 82.31 | 128.35 | 189.4 | 267.74 | 379.78 | 523.41 | 709.41 | 919.62 | 1228.57 | 1528.41 | 1858.16 | 2214.47 |
| 689.0 | -7.57 | -7 | -5.77 | -3.32 | 0.38 | 7.34 | 16.57 | 30.36 | 52.36 | 81.65 | 127.38 | 187.85 | 265.91 | 377.23 | 519.81 | 704.49 | 913.58 | 1220.39 | 1518.93 | 1847 | 2200.58 |
| 690.0 | -7.54 | -6.97 | -5.78 | -3.32 | 0.29 | 7.25 | 16.33 | 30.11 | 51.95 | 81.07 | 126.28 | 186.39 | 263.99 | 374.43 | 516.04 | 699.25 | 907.67 | 1211.96 | 1509.01 | 1835.74 | 2186.93 |
| 691.0 | -7.47 | -6.97 | -5.83 | -3.27 | 0.31 | 7.28 | 16.18 | 29.99 | 51.41 | 80.73 | 125.55 | 185.23 | 262.47 | 371.81 | 512.53 | 694.39 | 901.68 | 1204.55 | 1498.94 | 1824.25 | 2172.77 |
| 692.0 | -7.41 | -6.92 | -5.72 | -3.32 | 0.24 | 7.32 | 16.16 | 29.87 | 51.03 | 80.13 | 124.72 | 183.97 | 260.79 | 369.38 | 509.15 | 689.79 | 895.37 | 1196.12 | 1489 | 1812.36 | 2159.74 |
| 693.0 | -7.45 | -6.83 | -5.63 | -3.24 | 0.21 | 7.3 | 16.17 | 29.67 | 50.79 | 79.56 | 123.86 | 182.86 | 259.1 | 367.11 | 505.85 | 684.89 | 889.38 | 1187.64 | 1478.56 | 1800.76 | 2145.29 |
| 694.0 | -7.66 | -6.84 | -5.73 | -3.38 | 0.17 | 7.25 | 15.92 | 29.46 | 50.29 | 78.95 | 123.06 | 181.62 | 257.19 | 364.42 | 502.66 | 679.82 | 883.15 | 1179.9 | 1469.3 | 1788.91 | 2131.45 |
| 695.0 | -7.71 | -6.8 | -5.61 | -3.33 | 0.17 | 7.15 | 15.91 | 29.35 | 50.18 | 78.52 | 122.18 | 180.57 | 255.55 | 362.24 | 499.6 | 675.05 | 877.17 | 1172.3 | 1459.32 | 1777.47 | 2118.67 |
| 696.0 | -7.79 | -6.9 | -5.69 | -3.41 | 0.13 | 7.01 | 15.75 | 29.08 | 49.79 | 77.91 | 121.31 | 179.1 | 253.89 | 359.83 | 496.18 | 670.26 | 871.38 | 1164.32 | 1449.23 | 1765.01 | 2105.42 |
| 697.0 | -7.7 | -6.72 | -5.5 | -3.34 | 0.21 | 6.93 | 15.63 | 29.12 | 49.45 | 77.52 | 120.47 | 178.07 | 252.21 | 357.55 | 492.88 | 665.63 | 865.84 | 1156.89 | 1439.53 | 1752.43 | 2092.88 |
| 698.0 | -7.6 | -6.64 | -5.46 | -3.35 | 0.29 | 6.9 | 15.55 | 29.03 | 49.23 | 76.93 | 119.92 | 177.11 | 250.68 | 354.98 | 489.61 | 661.37 | 859.92 | 1149.04 | 1429.37 | 1740.63 | 2080.14 |
| 699.0 | -7.71 | -6.69 | -5.36 | -3.51 | 0.1 | 6.74 | 15.39 | 28.85 | 48.81 | 76.51 | 118.96 | 175.93 | 249.09 | 352.43 | 485.97 | 657.05 | 853.92 | 1141.06 | 1419.24 | 1728.92 | 2066.48 |
| 700.0 | -7.65 | -6.71 | -5.41 | -3.5 | 0.21 | 6.68 | 15.26 | 28.77 | 48.58 | 75.84 | 118.25 | 174.64 | 247.59 | 350.29 | 482.85 | 652.84 | 847.9 | 1133.04 | 1409.91 | 1717.45 | 2053.11 |
| 701.0 | -7.61 | -6.66 | -5.54 | -3.52 | 0.24 | 6.63 | 15.04 | 28.71 | 48.39 | 75.58 | 117.59 | 173.73 | 245.84 | 348.34 | 479.9 | 648.86 | 841.88 | 1124.9 | 1401.24 | 1706.06 | 2040.71 |
| 702.0 | -7.58 | -6.59 | -5.51 | -3.56 | 0.24 | 6.53 | 14.9 | 28.51 | 48.14 | 74.98 | 116.97 | 172.91 | 244.51 | 346.11 | 476.49 | 644.5 | 836.52 | 1116.54 | 1391.87 | 1694.77 | 2027.96 |
| 703.0 | -7.63 | -6.6 | -5.45 | -3.6 | 0.3 | 6.52 | 14.8 | 28.28 | 47.79 | 74.36 | 116.29 | 171.91 | 242.83 | 343.73 | 473.2 | 640.45 | 830.81 | 1108.57 | 1383.23 | 1683.69 | 2015.36 |
| 704.0 | -7.64 | -6.55 | -5.47 | -3.65 | 0.36 | 6.49 | 14.69 | 28.07 | 47.41 | 73.94 | 115.56 | 170.94 | 241.28 | 341.67 | 470.54 | 636.18 | 825.79 | 1101.49 | 1374.9 | 1673.11 | 2003.81 |
| 705.0 | -7.78 | -6.73 | -5.69 | -3.9 | 0.11 | 6.12 | 14.44 | 27.78 | 47.14 | 73.52 | 114.64 | 169.57 | 239.5 | 339.55 | 467.43 | 632.15 | 820.6 | 1094.11 | 1366.02 | 1661.88 | 1991.71 |
| 706.0 | -7.84 | -6.87 | -5.65 | -3.82 | 0.08 | 6.03 | 14.31 | 27.71 | 46.86 | 73.01 | 114 | 168.47 | 238.33 | 337.75 | 464.99 | 628.14 | 815.59 | 1088.1 | 1358.67 | 1652.35 | 1981.02 |
| 707.0 | -7.96 | -6.92 | -5.74 | -3.96 | -0.16 | 5.84 | 14.1 | 27.36 | 46.46 | 72.68 | 113.21 | 167.32 | 236.67 | 335.91 | 462.24 | 624.57 | 810.65 | 1082 | 1350.82 | 1642.99 | 1969.54 |
| 708.0 | -7.9 | -6.97 | -5.76 | -3.92 | -0.25 | 5.79 | 14.11 | 27.17 | 46.21 | 72.37 | 112.58 | 166.23 | 235.36 | 334.12 | 459.28 | 620.9 | 805.72 | 1075.43 | 1342.59 | 1633.5 | 1958.31 |
| 709.0 | -7.85 | -7.05 | -5.64 | -3.9 | -0.2 | 5.82 | 14.06 | 27.1 | 45.89 | 71.97 | 112.08 | 165.36 | 234.05 | 332.09 | 456.78 | 617.05 | 800.75 | 1068.95 | 1334.54 | 1623.2 | 1946.33 |
| 710.0 | -7.83 | -7.01 | -5.62 | -3.87 | -0.16 | 5.84 | 14.08 | 27.03 | 45.57 | 71.58 | 111.46 | 164.53 | 232.65 | 330.32 | 453.9 | 613.36 | 795.78 | 1062.16 | 1326.36 | 1612.99 | 1935.14 |
| 711.0 | -7.83 | -7.09 | -5.55 | -3.85 | -0.11 | 5.78 | 14.07 | 26.94 | 45.49 | 71.04 | 110.97 | 163.81 | 231.2 | 328.58 | 450.78 | 609.7 | 790.93 | 1055.28 | 1317.44 | 1602.11 | 1922.28 |
| 712.0 | -7.88 | -7.09 | -5.6 | -4 | -0.22 | 5.66 | 13.97 | 26.77 | 45.23 | 70.62 | 110.19 | 162.71 | 229.82 | 326.73 | 447.94 | 605.78 | 785.12 | 1047.69 | 1308.71 | 1591.04 | 1910.12 |
| 713.0 | -7.88 | -7.17 | -5.66 | -3.88 | -0.26 | 5.68 | 13.8 | 26.42 | 45.1 | 70.15 | 109.46 | 161.56 | 228.38 | 324.84 | 445.17 | 601.48 | 779.7 | 1040.87 | 1299.89 | 1579.93 | 1896.75 |
| 714.0 | -7.91 | -7.27 | -5.8 | -4.04 | -0.35 | 5.56 | 13.46 | 26.17 | 44.76 | 69.77 | 108.68 | 160.45 | 226.98 | 322.5 | 442.21 | 597.51 | 774.56 | 1033.69 | 1291.26 | 1569.08 | 1883.48 |
| 715.0 | -7.77 | -7.3 | -5.79 | -4 | -0.32 | 5.41 | 13.43 | 25.95 | 44.44 | 69.29 | 107.87 | 159.28 | 225.49 | 320.68 | 438.94 | 593.84 | 769.17 | 1026.33 | 1281.88 | 1558.66 | 1870.06 |
| 716.0 | -7.7 | -7.35 | -5.94 | -4 | -0.28 | 5.22 | 13.32 | 25.62 | 43.92 | 68.92 | 107.13 | 158.01 | 223.75 | 318.59 | 435.73 | 590 | 763.92 | 1018.72 | 1273.12 | 1547.79 | 1857.43 |
| 717.0 | -7.81 | -7.28 | -6 | -4.01 | -0.34 | 5.17 | 13.34 | 25.45 | 43.68 | 68.39 | 106.6 | 157.14 | 222.32 | 316.63 | 433.19 | 586.17 | 759.09 | 1012.18 | 1264.65 | 1537.61 | 1845.17 |
| 718.0 | -7.73 | -7.39 | -5.99 | -3.98 | -0.38 | 5.25 | 13.27 | 25.25 | 43.61 | 68.04 | 106.1 | 156.34 | 221.15 | 315.12 | 430.89 | 582.88 | 754.73 | 1006.56 | 1257.04 | 1529.02 | 1833.98 |
| 719.0 | -7.81 | -7.47 | -6.08 | -4.09 | -0.46 | 5.13 | 13 | 24.98 | 43.32 | 67.61 | 105.49 | 155.1 | 220.23 | 313.75 | 428.49 | 579.49 | 750.78 | 1001.39 | 1250.28 | 1520.94 | 1823.09 |
| 720.0 | -7.8 | -7.48 | -6.32 | -4.17 | -0.59 | 5.1 | 12.88 | 24.89 | 43.02 | 67.37 | 105.04 | 154.35 | 218.99 | 312.44 | 426.79 | 576.52 | 747.37 | 996.39 | 1244.13 | 1513.53 | 1813.15 |
| 721.0 | -7.98 | -7.6 | -6.26 | -4.3 | -0.66 | 5.01 | 12.77 | 24.7 | 42.78 | 67.08 | 104.53 | 153.65 | 217.92 | 310.89 | 424.63 | 573.28 | 743.79 | 991.97 | 1237.73 | 1505.66 | 1804.17 |
| 722.0 | -8.03 | -7.66 | -6.24 | -4.28 | -0.75 | 4.88 | 12.62 | 24.54 | 42.52 | 66.64 | 104.15 | 152.93 | 217.22 | 309.42 | 422.67 | 570.91 | 740.61 | 988.13 | 1232.57 | 1498.85 | 1795.99 |
| 723.0 | -8.16 | -7.76 | -6.35 | -4.33 | -0.78 | 4.92 | 12.52 | 24.37 | 42.19 | 66.36 | 103.73 | 151.98 | 216.19 | 308.21 | 421 | 569.07 | 737.69 | 984.93 | 1227.77 | 1493.7 | 1789.04 |
| 724.0 | -8.18 | -7.75 | -6.47 | -4.31 | -0.8 | 4.93 | 12.54 | 24.33 | 42.05 | 66.3 | 103.49 | 151.52 | 215.52 | 307.63 | 419.87 | 567.94 | 735.34 | 982.23 | 1224.03 | 1488.84 | 1782.31 |
| 725.0 | -8.15 | -7.81 | -6.59 | -4.34 | -0.74 | 4.87 | 12.46 | 24.33 | 42.24 | 66.06 | 103.23 | 151.1 | 215.11 | 306.85 | 418.53 | 566.66 | 733.35 | 980.14 | 1220.3 | 1484.27 | 1777.29 |
| 726.0 | -7.96 | -7.64 | -6.36 | -4.1 | -0.57 | 5 | 12.62 | 24.49 | 42.32 | 66.09 | 103.27 | 150.91 | 214.96 | 306.42 | 417.98 | 565.64 | 731.73 | 978.22 | 1217.56 | 1481.04 | 1772.69 |
| 727.0 | -7.96 | -7.58 | -6.38 | -4.19 | -0.49 | 5 | 12.62 | 24.39 | 42.15 | 65.99 | 103.21 | 150.57 | 214.62 | 305.62 | 417.14 | 564.6 | 729.98 | 976.03 | 1214.53 | 1477.33 | 1767.62 |
| 728.0 | -7.88 | -7.47 | -6.17 | -4.07 | -0.35 | 5.17 | 12.66 | 24.54 | 42.16 | 65.91 | 103.17 | 150.52 | 214.54 | 305.16 | 416.39 | 563.71 | 729.15 | 974.14 | 1212.61 | 1474.72 | 1764.58 |
| 729.0 | -7.87 | -7.31 | -6.13 | -4.01 | -0.24 | 5.28 | 12.68 | 24.56 | 42.2 | 65.77 | 103.2 | 150.46 | 214.29 | 304.9 | 416.06 | 563.16 | 728.8 | 972.95 | 1210.92 | 1472.41 | 1762.32 |
| 730.0 | -7.95 | -7.19 | -6.23 | -4.18 | -0.3 | 5.22 | 12.57 | 24.47 | 42.08 | 65.68 | 102.96 | 150.13 | 214.2 | 304.71 | 415.63 | 562.93 | 728.25 | 972.3 | 1210.32 | 1471.97 | 1761.53 |
| 731.0 | -7.9 | -7.18 | -6.21 | -4.28 | -0.26 | 5.26 | 12.57 | 24.42 | 42.12 | 65.71 | 102.86 | 150.17 | 214.17 | 304.51 | 415.7 | 563.02 | 728.41 | 972.32 | 1209.92 | 1472.13 | 1760.91 |
| 732.0 | -7.93 | -7.16 | -6.31 | -4.38 | -0.28 | 5.12 | 12.53 | 24.42 | 41.96 | 65.61 | 102.85 | 150.1 | 214.23 | 304.49 | 416.26 | 563.32 | 728.48 | 973.29 | 1211.34 | 1473.04 | 1761.95 |
| 733.0 | -7.95 | -7.13 | -6.27 | -4.29 | -0.31 | 5.06 | 12.61 | 24.34 | 41.98 | 65.49 | 102.88 | 150.05 | 214.26 | 304.46 | 416.54 | 563.93 | 729.54 | 974.1 | 1212.73 | 1474.24 | 1763.43 |
| 734.0 | -7.99 | -7.08 | -6.35 | -4.37 | -0.35 | 5.04 | 12.61 | 24.56 | 41.98 | 65.71 | 103.09 | 150.4 | 214.58 | 304.85 | 416.81 | 565.11 | 730.79 | 975.57 | 1214.53 | 1476.6 | 1766.25 |
| 735.0 | -8.02 | -7.08 | -6.26 | -4.32 | -0.39 | 5.08 | 12.63 | 24.78 | 41.9 | 65.74 | 103.53 | 150.6 | 214.95 | 305.48 | 417.4 | 566.13 | 732.2 | 977.47 | 1216.69 | 1479.91 | 1770.28 |
| 736.0 | -8.02 | -7.06 | -6.21 | -4.35 | -0.52 | 5.17 | 12.62 | 24.91 | 42.14 | 65.89 | 103.96 | 150.88 | 215.46 | 306.21 | 418.55 | 567.54 | 734.02 | 979.79 | 1219.69 | 1482.76 | 1774.25 |
| 737.0 | -7.98 | -6.93 | -6.12 | -4.38 | -0.65 | 5.24 | 12.57 | 24.88 | 42.32 | 65.97 | 104.23 | 151.24 | 215.86 | 306.78 | 419.52 | 568.58 | 735.46 | 981.73 | 1222.22 | 1485.28 | 1777.17 |
| 738.0 | -7.9 | -6.92 | -6.06 | -4.44 | -0.65 | 5.25 | 12.44 | 24.93 | 42.33 | 66.2 | 104.37 | 151.45 | 216.22 | 307.44 | 420 | 570.11 | 737.1 | 983.76 | 1224.6 | 1488.29 | 1781.11 |
| 739.0 | -7.81 | -6.7 | -6.06 | -4.39 | -0.61 | 5.31 | 12.58 | 24.91 | 42.26 | 66.3 | 104.52 | 151.73 | 216.63 | 308.04 | 420.94 | 571.09 | 738.42 | 985.24 | 1227.24 | 1491.49 | 1784.32 |
| 740.0 | -7.8 | -6.6 | -5.99 | -4.38 | -0.66 | 5.37 | 12.72 | 24.96 | 42.35 | 66.52 | 104.55 | 151.96 | 216.77 | 308.1 | 421.49 | 572.46 | 739.58 | 986.82 | 1229.41 | 1493.32 | 1787.75 |
| 741.0 | -7.8 | -6.59 | -5.87 | -4.32 | -0.62 | 5.34 | 12.69 | 24.83 | 42.42 | 66.38 | 104.63 | 152.04 | 217.07 | 308.46 | 421.67 | 573.49 | 740.37 | 988.06 | 1231.67 | 1494.96 | 1789.73 |
| 742.0 | -7.72 | -6.51 | -5.93 | -4.25 | -0.71 | 5.36 | 12.66 | 24.86 | 42.33 | 66.25 | 104.6 | 152.23 | 217.22 | 308.81 | 422.17 | 574.44 | 740.96 | 988.8 | 1233.72 | 1496.53 | 1792.07 |
| 743.0 | -7.67 | -6.54 | -5.85 | -4.38 | -0.81 | 5.41 | 12.75 | 24.77 | 42.28 | 66.26 | 104.29 | 152.03 | 217.18 | 309.47 | 422.25 | 574.5 | 741.68 | 989.18 | 1233.91 | 1497.56 | 1792.94 |
| 744.0 | -7.56 | -6.53 | -5.77 | -4.35 | -0.79 | 5.35 | 12.81 | 24.85 | 42.36 | 66.31 | 104.12 | 152.34 | 217.33 | 309.9 | 422.34 | 574.56 | 741.89 | 989.46 | 1234.29 | 1497.79 | 1793.49 |
| 745.0 | -7.62 | -6.53 | -5.67 | -4.45 | -0.83 | 5.21 | 12.73 | 24.88 | 42.21 | 66.25 | 104.03 | 152.1 | 217.13 | 309.44 | 422.01 | 573.66 | 741.88 | 989.36 | 1233.81 | 1497.3 | 1794.04 |
| 746.0 | -7.64 | -6.43 | -5.62 | -4.42 | -1.09 | 5.27 | 12.77 | 24.78 | 41.99 | 66.11 | 104.11 | 151.8 | 216.63 | 309.16 | 421.6 | 573.25 | 741.37 | 988.43 | 1233.62 | 1497.12 | 1793.41 |
| 747.0 | -7.83 | -6.6 | -5.79 | -4.62 | -1.21 | 5.17 | 12.59 | 24.32 | 41.62 | 65.58 | 103.74 | 151.64 | 216.23 | 308.77 | 421.26 | 572.58 | 740.64 | 987.65 | 1232.44 | 1496.43 | 1792.19 |
| 748.0 | -7.75 | -6.54 | -5.87 | -4.63 | -1.34 | 5.11 | 12.53 | 24.22 | 41.63 | 65.42 | 103.5 | 151.48 | 215.74 | 308.26 | 420.47 | 571.96 | 739.69 | 986.75 | 1230.9 | 1495.31 | 1790.91 |
| 749.0 | -7.63 | -6.48 | -5.89 | -4.62 | -1.32 | 5.14 | 12.62 | 24.1 | 41.62 | 65.33 | 103.44 | 151.43 | 215.51 | 307.75 | 420 | 571.21 | 738.48 | 985.04 | 1228.94 | 1492.94 | 1788.49 |
| 750.0 | -7.76 | -6.59 | -6 | -4.71 | -1.46 | 4.95 | 12.38 | 23.95 | 41.39 | 65.18 | 102.93 | 150.84 | 215.06 | 307 | 418.78 | 570.08 | 736.46 | 983.24 | 1226.56 | 1490.38 | 1784.89 |
| 751.0 | -7.74 | -6.77 | -6.04 | -4.69 | -1.5 | 4.89 | 12.28 | 23.84 | 41.27 | 65.06 | 102.73 | 150.53 | 214.52 | 306.24 | 417.48 | 568.52 | 734.59 | 980.72 | 1223.76 | 1486.93 | 1780.38 |
| 752.0 | -7.9 | -6.92 | -6.15 | -4.73 | -1.65 | 4.68 | 11.97 | 23.66 | 41.05 | 64.84 | 102.62 | 149.86 | 213.87 | 305.32 | 416.03 | 566.72 | 732.06 | 978 | 1220.71 | 1482.6 | 1776.01 |
| 753.0 | -7.85 | -6.87 | -6.06 | -4.65 | -1.61 | 4.7 | 12.06 | 23.54 | 40.87 | 64.74 | 102.17 | 149.28 | 213.07 | 304.34 | 414.55 | 564.96 | 730.33 | 974.98 | 1217.07 | 1478.3 | 1771.63 |
| 754.0 | -7.77 | -6.93 | -6.07 | -4.66 | -1.54 | 4.62 | 11.92 | 23.43 | 40.78 | 64.57 | 101.86 | 148.9 | 212.27 | 303.5 | 412.94 | 562.87 | 728.04 | 972.04 | 1213.12 | 1474.65 | 1766.06 |
| 755.0 | -7.83 | -7.1 | -6.1 | -4.64 | -1.57 | 4.43 | 11.74 | 23.16 | 40.51 | 63.89 | 101.33 | 148.11 | 211.22 | 301.86 | 411.46 | 560.58 | 725.51 | 968.35 | 1208.92 | 1469.73 | 1759.68 |
| 756.0 | -7.76 | -7.01 | -5.98 | -4.6 | -1.49 | 4.42 | 11.81 | 22.91 | 40.53 | 63.75 | 100.83 | 147.75 | 210.32 | 300.52 | 409.53 | 558.34 | 722.88 | 965.03 | 1204.1 | 1464.1 | 1753.53 |
| 757.0 | -7.78 | -7.03 | -6.02 | -4.51 | -1.5 | 4.39 | 11.68 | 22.71 | 40.25 | 63.56 | 100.1 | 147.12 | 209.28 | 298.97 | 407.51 | 555.78 | 719.89 | 960.86 | 1199.16 | 1458.69 | 1746.95 |
| 758.0 | -7.93 | -7.28 | -6.1 | -4.6 | -1.61 | 4.3 | 11.43 | 22.55 | 39.88 | 63.03 | 99.46 | 146.25 | 208.44 | 297.33 | 404.94 | 553.14 | 716.58 | 956.68 | 1194.02 | 1452.8 | 1739.4 |
| 759.0 | -7.83 | -7.26 | -5.97 | -4.48 | -1.51 | 4.21 | 11.51 | 22.44 | 39.67 | 62.64 | 99 | 145.45 | 207.34 | 295.74 | 402.82 | 550.22 | 713.56 | 951.92 | 1189 | 1446.38 | 1731.5 |
| 760.0 | -8.21 | -7.56 | -6.32 | -4.79 | -1.72 | 3.89 | 11.16 | 21.99 | 39.23 | 61.85 | 98.25 | 144.09 | 205.74 | 293.57 | 399.99 | 546.83 | 709.37 | 946.58 | 1182.69 | 1438.94 | 1723.03 |
| 761.0 | -8.14 | -7.6 | -6.42 | -4.78 | -1.82 | 3.72 | 11.17 | 21.83 | 38.89 | 61.35 | 97.71 | 143.45 | 204.47 | 291.9 | 397.4 | 543.58 | 705.36 | 941.74 | 1176.24 | 1431.52 | 1714.39 |
| 762.0 | -8 | -7.48 | -6.31 | -4.78 | -1.65 | 3.82 | 11.32 | 21.79 | 38.67 | 61.01 | 96.99 | 142.44 | 203.27 | 290 | 395.06 | 540.21 | 701.46 | 937.08 | 1169.39 | 1424.46 | 1705.68 |
| 763.0 | -8.01 | -7.54 | -6.31 | -4.79 | -1.6 | 3.75 | 11.17 | 21.5 | 38.25 | 60.62 | 96.34 | 141.4 | 201.79 | 287.81 | 392.38 | 536.18 | 696.84 | 931.56 | 1162.2 | 1416.3 | 1695.21 |
| 764.0 | -8.17 | -7.6 | -6.47 | -4.77 | -1.67 | 3.59 | 10.88 | 21.25 | 37.97 | 59.86 | 95.69 | 140.49 | 200.15 | 285.45 | 389.89 | 532.77 | 692.2 | 925.8 | 1155.52 | 1407.68 | 1685.67 |
| 765.0 | -8.19 | -7.49 | -6.53 | -4.78 | -1.69 | 3.6 | 10.74 | 21.1 | 37.7 | 59.63 | 95.17 | 139.32 | 198.69 | 283.3 | 386.93 | 529.43 | 687.55 | 919.88 | 1147.98 | 1398.48 | 1675.51 |
| 766.0 | -8.25 | -7.58 | -6.59 | -4.88 | -1.85 | 3.47 | 10.51 | 20.8 | 37.33 | 59.05 | 94.28 | 138.11 | 197.28 | 281.35 | 384.11 | 525.75 | 682.12 | 913.21 | 1140.32 | 1389.89 | 1664.83 |
| 767.0 | -8.24 | -7.68 | -6.64 | -4.84 | -1.74 | 3.3 | 10.42 | 20.57 | 37.05 | 58.61 | 93.26 | 136.85 | 195.81 | 279.12 | 381.32 | 521.68 | 677.06 | 906.69 | 1131.92 | 1379.44 | 1653.49 |
| 768.0 | -8.19 | -7.68 | -6.5 | -4.89 | -1.79 | 3.31 | 10.26 | 20.55 | 36.87 | 58.29 | 92.58 | 135.59 | 194.13 | 276.95 | 378.29 | 517.68 | 671.95 | 899.92 | 1124.14 | 1370.07 | 1642.44 |
| 769.0 | -8.2 | -7.72 | -6.47 | -4.89 | -1.81 | 3.2 | 10.2 | 20.5 | 36.59 | 57.81 | 91.73 | 134.6 | 192.61 | 274.81 | 375.47 | 513.32 | 666.91 | 893.03 | 1115.46 | 1360.29 | 1630.54 |
| 770.0 | -8.33 | -7.81 | -6.58 | -4.98 | -1.94 | 3.06 | 9.81 | 20.17 | 36.24 | 57.17 | 90.67 | 133.04 | 190.62 | 272.43 | 372.09 | 508.98 | 661.74 | 885.89 | 1106.97 | 1350.26 | 1618.7 |
| 771.0 | -8.32 | -7.82 | -6.39 | -5.02 | -2.05 | 3.04 | 9.67 | 19.95 | 35.96 | 56.68 | 90.11 | 131.99 | 189.08 | 270.17 | 369.15 | 504.59 | 656.65 | 878.56 | 1098.47 | 1340.32 | 1607.06 |
| 772.0 | -8.26 | -7.78 | -6.35 | -4.98 | -2.08 | 3 | 9.52 | 19.57 | 35.58 | 56.02 | 89.02 | 130.54 | 187.34 | 267.84 | 366.15 | 500.24 | 651.36 | 871.59 | 1089.8 | 1329.74 | 1594.89 |
| 773.0 | -8.18 | -7.65 | -6.24 | -4.92 | -2.05 | 2.99 | 9.49 | 19.34 | 35.32 | 55.57 | 88.14 | 129.33 | 185.73 | 265.45 | 363.19 | 496.12 | 646.06 | 864.3 | 1081.15 | 1319.19 | 1582.49 |
| 774.0 | -8.16 | -7.73 | -6.31 | -5.02 | -2.14 | 2.9 | 9.19 | 19.12 | 35.1 | 54.96 | 87.57 | 128.19 | 184.12 | 262.94 | 360.02 | 491.64 | 640.1 | 856.93 | 1071.98 | 1308.54 | 1569.3 |
| 775.0 | -8.2 | -7.73 | -6.29 | -4.96 | -2.28 | 2.97 | 9.03 | 18.96 | 34.67 | 54.48 | 86.62 | 126.89 | 182.55 | 260.38 | 356.85 | 487.01 | 633.94 | 849.19 | 1062.83 | 1297.04 | 1556.57 |
| 776.0 | -8.12 | -7.56 | -6.18 | -5.05 | -2.24 | 2.9 | 8.95 | 18.77 | 34.27 | 54.01 | 85.77 | 125.58 | 180.89 | 258.26 | 353.53 | 482.2 | 628.12 | 841.34 | 1053.37 | 1285.48 | 1543.63 |
| 777.0 | -8.18 | -7.68 | -6.34 | -5.05 | -2.31 | 2.77 | 8.71 | 18.54 | 33.78 | 53.4 | 84.75 | 124.16 | 179.1 | 255.87 | 350.29 | 477.79 | 622.22 | 833.38 | 1044.48 | 1274.14 | 1530.09 |
| 778.0 | -8.2 | -7.66 | -6.22 | -5.11 | -2.35 | 2.55 | 8.63 | 18.39 | 33.3 | 52.74 | 83.85 | 122.85 | 177.33 | 253.12 | 346.91 | 473.07 | 616.39 | 825.89 | 1034.84 | 1262.36 | 1516.5 |
| 779.0 | -8.12 | -7.61 | -6.24 | -5.15 | -2.39 | 2.28 | 8.61 | 18.07 | 32.92 | 52.31 | 82.72 | 121.47 | 175.38 | 250.62 | 343.99 | 468.47 | 610.51 | 818.16 | 1024.98 | 1251.02 | 1503.83 |
| 780.0 | -8.34 | -7.76 | -6.43 | -5.33 | -2.57 | 2.2 | 8.2 | 17.76 | 32.39 | 51.61 | 81.56 | 120.28 | 173.42 | 247.94 | 340.76 | 463.4 | 604.01 | 810.2 | 1014.83 | 1239.43 | 1490.02 |
| 781.0 | -8.04 | -7.64 | -6.2 | -5.1 | -2.47 | 2.18 | 8.18 | 17.74 | 32.23 | 51.21 | 80.81 | 119.36 | 171.87 | 245.68 | 337.65 | 459.19 | 598.31 | 803.17 | 1005.42 | 1227.85 | 1476.37 |
| 782.0 | -8.06 | -7.51 | -6.03 | -5.11 | -2.34 | 2.25 | 7.9 | 17.56 | 32.03 | 50.73 | 80.18 | 118.22 | 170.19 | 243.46 | 334.59 | 454.47 | 592.42 | 795.43 | 995.84 | 1216.52 | 1462.41 |
| 783.0 | -8.1 | -7.54 | -6.15 | -5.06 | -2.39 | 2.01 | 7.49 | 17.35 | 31.6 | 50.14 | 79.31 | 116.95 | 168.4 | 240.72 | 330.89 | 449.66 | 586.06 | 786.81 | 985.69 | 1204.41 | 1448.74 |
| 784.0 | -8.19 | -7.52 | -6.24 | -5.19 | -2.54 | 1.89 | 7.29 | 17.11 | 31.32 | 49.56 | 78.45 | 115.65 | 166.77 | 238.22 | 327.27 | 445.45 | 580.16 | 778.6 | 975.43 | 1192.38 | 1435.01 |
| 785.0 | -8.21 | -7.49 | -6.23 | -5.31 | -2.69 | 1.73 | 7.23 | 16.93 | 30.77 | 49.07 | 77.5 | 114.3 | 164.94 | 235.27 | 323.44 | 440.54 | 573.9 | 770.31 | 964.91 | 1179.96 | 1420.61 |
| 786.0 | -8.28 | -7.64 | -6.32 | -5.36 | -2.92 | 1.52 | 7 | 16.61 | 30.24 | 48.19 | 76.54 | 112.89 | 163.18 | 232.5 | 320.06 | 435.51 | 567.6 | 761.73 | 954.6 | 1167.86 | 1405.57 |
| 787.0 | -8.08 | -7.59 | -6.32 | -5.28 | -2.91 | 1.38 | 6.86 | 16.32 | 29.95 | 47.55 | 75.65 | 111.87 | 161.36 | 230.02 | 316.68 | 431.08 | 561.89 | 753.6 | 944.66 | 1155.81 | 1391.21 |
| 788.0 | -8.17 | -7.61 | -6.33 | -5.48 | -3.09 | 1.24 | 6.55 | 15.97 | 29.48 | 46.83 | 74.77 | 110.87 | 159.44 | 227.46 | 313.22 | 426.66 | 555.82 | 745.3 | 934.92 | 1144.21 | 1376.54 |
| 789.0 | -8.05 | -7.5 | -6.46 | -5.42 | -3 | 1.07 | 6.43 | 15.79 | 29.14 | 46.39 | 73.92 | 109.75 | 157.93 | 224.75 | 310.01 | 422.32 | 549.98 | 737.71 | 925.1 | 1132.25 | 1362.04 |
| 790.0 | -8 | -7.44 | -6.47 | -5.48 | -2.93 | 1.08 | 6.26 | 15.57 | 28.78 | 45.88 | 73.14 | 108.6 | 156.42 | 222.26 | 306.84 | 418.02 | 544.53 | 730.06 | 916.38 | 1120.41 | 1348.35 |
| 791.0 | -7.98 | -7.36 | -6.41 | -5.48 | -3 | 1.03 | 6.24 | 15.35 | 28.33 | 45.5 | 72.47 | 107.58 | 155.06 | 220.09 | 303.87 | 413.98 | 539.17 | 723.39 | 907.61 | 1109.17 | 1335.25 |
| 792.0 | -7.92 | -7.26 | -6.5 | -5.41 | -2.89 | 0.93 | 6.4 | 15.31 | 27.99 | 44.92 | 71.7 | 106.53 | 153.72 | 217.91 | 301.01 | 409.99 | 533.89 | 716.69 | 899.07 | 1098.27 | 1322.78 |
| 793.0 | -8 | -7.3 | -6.62 | -5.56 | -2.97 | 0.7 | 6.25 | 15.23 | 27.65 | 44.33 | 71.16 | 105.67 | 152.2 | 215.56 | 298.11 | 406.37 | 528.97 | 710.32 | 890.8 | 1088.66 | 1310.82 |
| 794.0 | -7.97 | -7.31 | -6.73 | -5.6 | -3.08 | 0.57 | 6.05 | 14.97 | 27.23 | 43.71 | 70.35 | 104.93 | 150.75 | 213.65 | 295.35 | 402.88 | 524.28 | 704.1 | 882.64 | 1079.49 | 1299.68 |
| 795.0 | -8.02 | -7.44 | -6.84 | -5.71 | -3.19 | 0.45 | 5.97 | 14.76 | 26.82 | 43.29 | 69.59 | 104.01 | 149.42 | 211.69 | 292.92 | 399.7 | 519.93 | 698.43 | 875.19 | 1070.83 | 1290.24 |
| 796.0 | -8 | -7.47 | -6.8 | -5.73 | -3.09 | 0.35 | 5.89 | 14.57 | 26.67 | 42.86 | 69.13 | 103.36 | 147.9 | 210.07 | 290.92 | 397.05 | 516.31 | 693.4 | 869.04 | 1062.91 | 1281.14 |
| 797.0 | -7.99 | -7.47 | -6.79 | -5.57 | -3.19 | 0.4 | 5.89 | 14.5 | 26.6 | 42.8 | 68.59 | 102.77 | 146.88 | 208.61 | 288.8 | 394.63 | 512.8 | 688.62 | 863.58 | 1055.86 | 1272.89 |
| 798.0 | -7.86 | -7.39 | -6.74 | -5.55 | -3.19 | 0.43 | 5.87 | 14.33 | 26.46 | 42.51 | 68.36 | 102.05 | 146.14 | 207.15 | 286.99 | 392.21 | 509.47 | 684.18 | 857.92 | 1049.18 | 1264.83 |
| 799.0 | -8.05 | -7.52 | -6.93 | -5.67 | -3.26 | 0.38 | 5.61 | 13.99 | 26.29 | 42.11 | 67.87 | 101.32 | 145.05 | 205.82 | 285.04 | 389.85 | 506.03 | 679.77 | 852.98 | 1043 | 1257.56 |
| 800.0 | -7.96 | -7.42 | -6.82 | -5.48 | -3.1 | 0.68 | 5.61 | 14.18 | 26.22 | 41.78 | 67.91 | 101.16 | 144.4 | 204.89 | 283.27 | 388.18 | 503.6 | 676.1 | 848.61 | 1037.49 | 1250.65 |
| 801.0 | -7.9 | -7.39 | -6.83 | -5.5 | -3.15 | 0.55 | 5.6 | 14 | 26.11 | 41.71 | 67.69 | 100.4 | 143.95 | 204 | 281.59 | 386.63 | 500.9 | 673.08 | 844.89 | 1032.41 | 1244.66 |
| 802.0 | -8.09 | -7.39 | -6.9 | -5.63 | -3.22 | 0.54 | 5.56 | 13.84 | 25.81 | 41.49 | 67.31 | 99.78 | 143.33 | 203.18 | 280.32 | 384.9 | 498.73 | 669.76 | 841.19 | 1027.92 | 1238.69 |
| 803.0 | -8.21 | -7.54 | -6.98 | -5.68 | -3.25 | 0.47 | 5.54 | 13.77 | 25.54 | 41.34 | 66.78 | 99.01 | 142.68 | 202.33 | 279.07 | 383.4 | 496.75 | 666.54 | 838.11 | 1023.66 | 1234.14 |
| 804.0 | -8.38 | -7.61 | -7.08 | -5.87 | -3.45 | 0.47 | 5.54 | 13.54 | 25.43 | 41.25 | 66.51 | 98.76 | 142.13 | 201.8 | 278.17 | 382.03 | 495.33 | 664.35 | 834.62 | 1019.76 | 1229.71 |
| 805.0 | -8.29 | -7.57 | -6.9 | -5.77 | -3.39 | 0.48 | 5.75 | 13.52 | 25.41 | 41.23 | 66.32 | 98.31 | 141.71 | 201.38 | 277.78 | 380.83 | 494 | 662.49 | 831.98 | 1016.7 | 1226.41 |
| 806.0 | -8.09 | -7.49 | -6.79 | -5.7 | -3.19 | 0.61 | 5.8 | 13.44 | 25.5 | 41.32 | 66.38 | 98.12 | 141.58 | 201.37 | 277.41 | 380.2 | 493.11 | 661.24 | 830.09 | 1014.82 | 1223.98 |
| 807.0 | -8.01 | -7.4 | -6.66 | -5.58 | -2.95 | 0.61 | 5.81 | 13.4 | 25.58 | 41.52 | 66.14 | 98.14 | 141.3 | 201.22 | 277.02 | 379.57 | 492.35 | 660.6 | 828.83 | 1012.87 | 1222.36 |
| 808.0 | -8.19 | -7.37 | -6.72 | -5.62 | -2.96 | 0.65 | 5.89 | 13.4 | 25.62 | 41.49 | 66.09 | 97.89 | 141.04 | 200.86 | 276.59 | 378.95 | 491.66 | 660 | 827.18 | 1011.11 | 1220.19 |
| 809.0 | -8.08 | -7.3 | -6.66 | -5.43 | -2.84 | 0.71 | 6.01 | 13.54 | 25.68 | 41.63 | 66.17 | 97.76 | 141.09 | 200.72 | 276.4 | 378.44 | 491.35 | 659.19 | 826.33 | 1009.88 | 1218.92 |
| 810.0 | -8.27 | -7.4 | -6.65 | -5.57 | -3.02 | 0.61 | 5.99 | 13.37 | 25.47 | 41.49 | 66.04 | 97.52 | 140.74 | 200.55 | 275.53 | 377.64 | 490.88 | 657.95 | 825.16 | 1008.1 | 1217.27 |
| 811.0 | -8.28 | -7.36 | -6.65 | -5.51 | -3.15 | 0.58 | 5.95 | 13.17 | 25.39 | 41.48 | 66 | 97.27 | 140.45 | 200.45 | 275.13 | 377.26 | 490.52 | 657.16 | 824.18 | 1007.32 | 1215.84 |
| 812.0 | -8.24 | -7.4 | -6.61 | -5.5 | -3.09 | 0.58 | 5.91 | 13.15 | 25.37 | 41.4 | 65.95 | 97.22 | 140.13 | 200.21 | 274.86 | 376.83 | 489.75 | 655.96 | 822.8 | 1005.89 | 1213.56 |
| 813.0 | -8.25 | -7.53 | -6.53 | -5.56 | -3.13 | 0.61 | 5.81 | 13.03 | 25.48 | 41.46 | 65.86 | 97.07 | 139.75 | 200.02 | 274.22 | 376.23 | 488.66 | 654.75 | 821.08 | 1004.16 | 1210.59 |
| 814.0 | -8.12 | -7.39 | -6.39 | -5.4 | -3 | 0.78 | 5.87 | 13.16 | 25.5 | 41.53 | 65.98 | 97.04 | 139.66 | 199.92 | 273.74 | 375.64 | 487.81 | 653.32 | 819.64 | 1001.89 | 1207.9 |
| 815.0 | -8.22 | -7.45 | -6.31 | -5.42 | -2.94 | 0.74 | 5.86 | 13.12 | 25.54 | 41.47 | 65.9 | 96.71 | 139.29 | 199.36 | 273.31 | 374.57 | 486.64 | 651.96 | 817.61 | 999.31 | 1204.63 |
| 816.0 | -8.24 | -7.26 | -6.19 | -5.33 | -2.83 | 0.77 | 5.76 | 13.09 | 25.49 | 41.32 | 65.58 | 96.48 | 138.87 | 199.23 | 272.46 | 373.48 | 485.32 | 650.12 | 815.44 | 996.08 | 1200.33 |
| 817.0 | -8.12 | -7.24 | -6.15 | -5.31 | -2.86 | 0.71 | 5.8 | 13.13 | 25.43 | 41.18 | 65.46 | 95.96 | 138.82 | 198.61 | 271.66 | 372.41 | 483.92 | 648.3 | 812.62 | 993.05 | 1196.79 |
| 818.0 | -8.09 | -7.23 | -6.2 | -5.43 | -2.85 | 0.65 | 5.74 | 13.03 | 25.24 | 40.91 | 65.37 | 95.78 | 138.3 | 197.89 | 270.98 | 371.14 | 482.43 | 646.33 | 809.77 | 989.44 | 1192.36 |
| 819.0 | -8.11 | -7.15 | -6.32 | -5.43 | -2.88 | 0.8 | 5.8 | 13.09 | 25.17 | 40.9 | 65.17 | 95.63 | 137.74 | 197.18 | 269.99 | 369.8 | 480.69 | 644.28 | 806.75 | 985.67 | 1187.49 |
| 820.0 | -7.94 | -7.01 | -6.26 | -5.33 | -2.78 | 0.79 | 6.01 | 13.13 | 25.14 | 40.9 | 64.94 | 95.42 | 137.34 | 196.59 | 269.27 | 368.67 | 479 | 641.7 | 802.87 | 981.55 | 1181.91 |
| 821.0 | -7.99 | -7.02 | -6.32 | -5.44 | -2.96 | 0.61 | 6.02 | 12.98 | 25.04 | 40.8 | 64.62 | 94.91 | 136.88 | 195.59 | 268.4 | 366.76 | 476.75 | 639.27 | 799.66 | 977.37 | 1176.27 |
| 822.0 | -8.03 | -6.99 | -6.34 | -5.36 | -2.99 | 0.5 | 6.1 | 12.94 | 24.86 | 40.51 | 64.21 | 94.65 | 136.04 | 194.57 | 267.42 | 364.9 | 474.75 | 636.54 | 795.38 | 972.19 | 1170.01 |
| 823.0 | -7.86 | -6.97 | -6.23 | -5.34 | -2.9 | 0.51 | 6.12 | 12.97 | 24.97 | 40.48 | 63.88 | 94.26 | 135.43 | 193.59 | 265.99 | 363.43 | 472.42 | 633.37 | 790.79 | 966.25 | 1163.98 |
| 824.0 | -7.87 | -7 | -6.39 | -5.31 | -3.05 | 0.34 | 5.98 | 12.72 | 24.8 | 40.18 | 63.46 | 93.95 | 134.58 | 192.31 | 264.46 | 361.38 | 469.91 | 630.22 | 786.15 | 960.47 | 1156.8 |
| 825.0 | -7.83 | -6.99 | -6.33 | -5.27 | -2.95 | 0.21 | 5.91 | 12.76 | 24.57 | 39.89 | 63.25 | 93.46 | 133.89 | 191.27 | 263.19 | 359.53 | 467.21 | 626.96 | 782.46 | 954.88 | 1149.85 |
| 826.0 | -7.75 | -7 | -6.47 | -5.28 | -2.99 | 0.21 | 5.65 | 12.72 | 24.35 | 39.73 | 63.01 | 93.09 | 133.24 | 189.98 | 261.6 | 357.55 | 464.89 | 623.25 | 777.86 | 949.67 | 1142.03 |
| 827.0 | -7.99 | -7.08 | -6.55 | -5.23 | -3.14 | 0.06 | 5.43 | 12.62 | 24.16 | 39.48 | 62.64 | 92.64 | 132.39 | 188.77 | 260.14 | 355.27 | 461.86 | 619.17 | 773.17 | 943.2 | 1134.23 |
| 828.0 | -8.05 | -7.19 | -6.72 | -5.45 | -3.3 | 0.07 | 5.34 | 12.46 | 23.97 | 39.04 | 62.34 | 92.03 | 131.57 | 187.37 | 258.64 | 353.18 | 459.15 | 614.86 | 768.14 | 937.23 | 1126.41 |
| 829.0 | -7.88 | -7.16 | -6.65 | -5.42 | -3.3 | 0.09 | 5.28 | 12.5 | 23.83 | 39 | 62.06 | 91.52 | 130.77 | 186.14 | 256.99 | 350.8 | 456.28 | 610.59 | 763.24 | 930.87 | 1118.63 |
| 830.0 | -7.86 | -7.17 | -6.83 | -5.47 | -3.19 | 0.06 | 5.21 | 12.35 | 23.68 | 38.8 | 61.7 | 90.99 | 129.97 | 184.98 | 255.04 | 348.68 | 453.14 | 606.67 | 757.97 | 924.52 | 1110.4 |
| 831.0 | -7.67 | -7.15 | -6.85 | -5.41 | -3.08 | 0.25 | 5.18 | 12.29 | 23.72 | 38.58 | 61.28 | 90.57 | 129.29 | 183.63 | 253.57 | 346.53 | 450.25 | 602.82 | 752.83 | 918.43 | 1102.36 |
| 832.0 | -7.72 | -7.2 | -6.85 | -5.41 | -3.13 | 0.19 | 5.17 | 12.31 | 23.58 | 38.12 | 60.83 | 89.96 | 128.38 | 182.38 | 251.61 | 344.18 | 446.88 | 598.39 | 747.25 | 911.42 | 1094.17 |
| 833.0 | -7.78 | -7.26 | -6.95 | -5.54 | -3.29 | -0.08 | 5.02 | 12.24 | 23.33 | 37.66 | 60.49 | 89.33 | 127.47 | 180.96 | 249.58 | 341.14 | 443.42 | 594.16 | 741.86 | 904.38 | 1085.68 |
| 834.0 | -7.8 | -7.09 | -7.01 | -5.54 | -3.36 | -0.24 | 4.92 | 12.06 | 23.17 | 37.39 | 60.04 | 88.71 | 126.67 | 179.43 | 247.66 | 338.85 | 440.53 | 589.76 | 736.78 | 897.55 | 1077.31 |
| 835.0 | -7.87 | -7.17 | -7.03 | -5.68 | -3.42 | -0.37 | 4.8 | 11.9 | 22.96 | 37.03 | 59.45 | 87.77 | 125.7 | 178.12 | 245.97 | 336.2 | 437.39 | 585.32 | 731.16 | 891.02 | 1069.25 |
| 836.0 | -7.8 | -7.24 | -7.16 | -5.73 | -3.58 | -0.47 | 4.68 | 11.76 | 22.74 | 36.68 | 58.88 | 87.09 | 124.86 | 176.87 | 244.08 | 333.89 | 434.27 | 581.14 | 726.23 | 884.56 | 1061.24 |
| 837.0 | -7.84 | -7.36 | -7.32 | -5.78 | -3.72 | -0.53 | 4.7 | 11.66 | 22.55 | 36.52 | 58.52 | 86.45 | 124.1 | 175.36 | 242.46 | 331.39 | 431.2 | 576.95 | 720.75 | 877.96 | 1052.9 |
| 838.0 | -8.06 | -7.44 | -7.57 | -5.96 | -3.83 | -0.53 | 4.61 | 11.4 | 22.28 | 36.14 | 58.02 | 85.82 | 123.01 | 174.11 | 240.25 | 328.83 | 427.93 | 572.45 | 715.09 | 870.84 | 1043.88 |
| 839.0 | -8.16 | -7.42 | -7.6 | -6 | -3.91 | -0.6 | 4.47 | 11.27 | 22.07 | 35.9 | 57.5 | 84.92 | 122.23 | 172.91 | 238.26 | 326.17 | 424.42 | 568.12 | 708.74 | 864.1 | 1035.1 |
| 840.0 | -8.27 | -7.53 | -7.5 | -6.06 | -3.95 | -0.89 | 4.21 | 10.96 | 21.82 | 35.36 | 57 | 84.08 | 121.04 | 171.31 | 236.38 | 323.41 | 420.65 | 563.26 | 702.44 | 856.3 | 1026.6 |
| 841.0 | -8.26 | -7.61 | -7.47 | -6.13 | -4.01 | -0.93 | 4.12 | 10.91 | 21.53 | 34.92 | 56.67 | 83.35 | 120.04 | 169.76 | 234.27 | 320.74 | 417.12 | 558.94 | 697.07 | 848.89 | 1018.02 |
| 842.0 | -8.41 | -7.7 | -7.57 | -6.35 | -4.13 | -1.11 | 3.79 | 10.68 | 21.25 | 34.58 | 56.07 | 82.58 | 119.03 | 168.42 | 232.31 | 318.08 | 413.6 | 554.11 | 690.82 | 841.08 | 1009.26 |
| 843.0 | -8.32 | -7.68 | -7.51 | -6.36 | -4.09 | -1.07 | 3.64 | 10.53 | 21.24 | 34.37 | 55.79 | 82 | 118.11 | 167.06 | 230.26 | 315.81 | 410.5 | 549.3 | 685.09 | 833.99 | 1000.32 |
| 844.0 | -8.36 | -7.69 | -7.6 | -6.32 | -4.17 | -1.12 | 3.58 | 10.35 | 20.88 | 34.01 | 55.32 | 81.29 | 117.32 | 165.76 | 228.44 | 312.96 | 407.16 | 544.68 | 679.71 | 827.03 | 991.32 |
| 845.0 | -8.33 | -7.71 | -7.52 | -6.39 | -4.14 | -1.11 | 3.59 | 10.34 | 20.68 | 33.67 | 54.88 | 80.57 | 116.33 | 164.36 | 226.44 | 310.62 | 403.64 | 540.22 | 673.96 | 819.71 | 982.27 |
| 846.0 | -8.26 | -7.65 | -7.41 | -6.27 | -4.2 | -1.02 | 3.7 | 10.12 | 20.59 | 33.35 | 54.44 | 79.85 | 115.23 | 163.02 | 224.46 | 308.04 | 400.16 | 535.39 | 667.88 | 812.35 | 973.42 |
| 847.0 | -8.35 | -7.6 | -7.39 | -6.25 | -4.22 | -1.15 | 3.64 | 9.86 | 20.41 | 32.92 | 53.85 | 79.17 | 114.2 | 161.84 | 222.42 | 305.48 | 396.57 | 530.94 | 662.17 | 804.74 | 965.19 |
| 848.0 | -8.22 | -7.6 | -7.36 | -6.28 | -4.23 | -1.15 | 3.64 | 9.73 | 20.24 | 32.6 | 53.19 | 78.49 | 113.2 | 160.46 | 220.2 | 302.96 | 393.11 | 526.39 | 656.07 | 797.42 | 956.01 |
| 849.0 | -8.21 | -7.59 | -7.21 | -6.2 | -4.17 | -1.21 | 3.55 | 9.6 | 20.06 | 32.3 | 52.7 | 77.8 | 112.18 | 159.08 | 218.35 | 300.15 | 389.69 | 521.72 | 650.45 | 789.74 | 947.23 |
| 850.0 | -8.25 | -7.65 | -7.2 | -6.25 | -4.19 | -1.29 | 3.47 | 9.34 | 19.91 | 31.88 | 52.27 | 77.06 | 111.12 | 157.79 | 216.28 | 297.56 | 386.21 | 516.9 | 644.69 | 781.98 | 937.8 |
| 851.0 | -8.23 | -7.67 | -7.06 | -6.22 | -4.3 | -1.23 | 3.41 | 9.3 | 19.65 | 31.57 | 51.85 | 76.38 | 110.08 | 156.16 | 214.24 | 294.7 | 382.6 | 511.89 | 638.63 | 774.62 | 928.42 |
| 852.0 | -8.4 | -7.71 | -7.08 | -6.2 | -4.42 | -1.43 | 3.37 | 9.26 | 19.31 | 31.09 | 51.38 | 75.41 | 108.96 | 154.75 | 212.16 | 291.68 | 378.62 | 506.58 | 632.51 | 766.39 | 919.36 |
| 853.0 | -8.48 | -7.77 | -7.02 | -6.3 | -4.51 | -1.6 | 3.09 | 9.06 | 18.88 | 30.64 | 50.83 | 74.67 | 107.87 | 153.13 | 210.21 | 288.96 | 374.89 | 501.53 | 626.23 | 758.37 | 909.63 |
| 854.0 | -8.45 | -7.83 | -6.99 | -6.35 | -4.47 | -1.53 | 3.03 | 8.8 | 18.59 | 30.35 | 50.06 | 73.78 | 106.8 | 151.67 | 208.12 | 286.46 | 371.36 | 496.45 | 620.01 | 750.74 | 900.13 |
| 855.0 | -8.41 | -7.95 | -7.04 | -6.43 | -4.51 | -1.61 | 2.8 | 8.67 | 18.07 | 29.89 | 49.47 | 72.83 | 105.59 | 150.22 | 206.13 | 283.49 | 367.82 | 491.52 | 613.64 | 743.46 | 891.24 |
| 856.0 | -8.5 | -7.94 | -7.05 | -6.39 | -4.67 | -1.66 | 2.72 | 8.37 | 17.88 | 29.67 | 48.83 | 72.19 | 104.47 | 148.77 | 203.89 | 280.47 | 363.96 | 486.59 | 607.28 | 735.46 | 881.36 |
| 857.0 | -8.51 | -7.88 | -6.93 | -6.37 | -4.68 | -1.62 | 2.7 | 8.22 | 17.68 | 29.37 | 48.4 | 71.39 | 103.32 | 147.24 | 201.79 | 277.36 | 359.98 | 481.5 | 600.66 | 726.74 | 871.34 |
| 858.0 | -8.48 | -7.91 | -6.89 | -6.44 | -4.74 | -1.72 | 2.44 | 8.11 | 17.44 | 28.99 | 47.91 | 70.64 | 102.06 | 145.78 | 199.29 | 274.56 | 355.93 | 475.76 | 594.03 | 718.5 | 861.46 |
| 859.0 | -8.38 | -7.71 | -6.71 | -6.29 | -4.65 | -1.81 | 2.24 | 8.07 | 17.26 | 28.74 | 47.35 | 69.93 | 101.08 | 144.05 | 197.14 | 271.46 | 351.84 | 470.5 | 587.07 | 709.86 | 851.24 |
| 860.0 | -8.36 | -7.83 | -6.63 | -6.32 | -4.67 | -1.9 | 2.13 | 7.86 | 16.99 | 28.26 | 46.94 | 69.1 | 99.56 | 142.07 | 194.75 | 268.58 | 347.88 | 464.96 | 580.1 | 700.83 | 840.43 |
| 861.0 | -8.31 | -7.87 | -6.66 | -6.28 | -4.72 | -1.98 | 2.08 | 7.86 | 16.67 | 28.05 | 46.17 | 68.18 | 98.51 | 140.54 | 192.25 | 265.24 | 344.18 | 459.25 | 573.18 | 692.51 | 829.76 |
| 862.0 | -8.37 | -7.88 | -6.67 | -6.25 | -4.73 | -2.11 | 1.88 | 7.77 | 16.53 | 27.6 | 45.5 | 67.32 | 97.33 | 138.99 | 189.87 | 261.85 | 340.23 | 453.62 | 565.85 | 683.94 | 819.05 |
| 863.0 | -8.33 | -7.87 | -6.65 | -6.14 | -4.66 | -2.12 | 1.76 | 7.58 | 16.22 | 27.12 | 44.9 | 66.34 | 95.94 | 136.88 | 187.06 | 258.48 | 335.88 | 447.73 | 558.22 | 675.1 | 808.01 |
| 864.0 | -8.33 | -7.98 | -6.69 | -6.3 | -4.81 | -2.25 | 1.57 | 7.35 | 15.92 | 26.64 | 44.25 | 65.29 | 94.6 | 135.11 | 184.62 | 254.68 | 331.14 | 441.71 | 550.64 | 666.27 | 797.35 |
| 865.0 | -8.43 | -8.06 | -6.76 | -6.42 | -4.95 | -2.29 | 1.29 | 7.05 | 15.56 | 26.1 | 43.52 | 64.23 | 92.97 | 133 | 181.82 | 251.1 | 326.35 | 435.78 | 542.7 | 657.16 | 786.42 |
| 866.0 | -8.28 | -7.83 | -6.7 | -6.33 | -4.85 | -2.3 | 1.21 | 6.94 | 15.41 | 25.83 | 43.02 | 63.37 | 91.83 | 131.14 | 179.21 | 247.48 | 321.59 | 429.62 | 535.18 | 648.74 | 775.74 |
| 867.0 | -8.37 | -7.94 | -6.85 | -6.56 | -4.98 | -2.46 | 0.88 | 6.76 | 14.92 | 25.35 | 42.29 | 62.46 | 90.53 | 128.77 | 176.37 | 243.72 | 316.93 | 423.43 | 527.31 | 639.35 | 764.43 |
| 868.0 | -8.39 | -7.98 | -6.86 | -6.61 | -5.01 | -2.55 | 0.68 | 6.66 | 14.59 | 24.89 | 41.6 | 61.56 | 89.02 | 126.71 | 173.77 | 240.02 | 312.23 | 417.1 | 519.91 | 630.48 | 753.01 |
| 869.0 | -8.39 | -7.97 | -6.85 | -6.67 | -5.07 | -2.64 | 0.53 | 6.41 | 14.34 | 24.4 | 41 | 60.46 | 87.84 | 124.78 | 171.24 | 236.57 | 307.76 | 411.32 | 512.71 | 621.61 | 742.36 |
| 870.0 | -8.37 | -7.93 | -6.93 | -6.61 | -5.13 | -2.77 | 0.38 | 6.29 | 14.02 | 24.04 | 40.36 | 59.6 | 86.62 | 123.2 | 168.52 | 233.46 | 303.51 | 405.52 | 505.43 | 613.38 | 731.83 |
| 871.0 | -8.47 | -7.91 | -7.05 | -6.71 | -5.26 | -2.94 | 0.14 | 6.1 | 13.48 | 23.61 | 39.59 | 58.75 | 85.41 | 121.24 | 166.09 | 230.07 | 299.1 | 400.13 | 498.28 | 605.44 | 722.16 |
| 872.0 | -8.54 | -7.99 | -7.2 | -6.94 | -5.43 | -3.24 | -0.09 | 5.79 | 13.1 | 22.94 | 38.74 | 57.79 | 84.04 | 119.66 | 163.93 | 226.87 | 295.19 | 395.13 | 491.62 | 597.46 | 713.28 |
| 873.0 | -8.45 | -7.96 | -7.19 | -7.02 | -5.53 | -3.31 | -0.29 | 5.6 | 12.75 | 22.6 | 38.18 | 57.17 | 82.82 | 118.1 | 161.67 | 224.29 | 291.5 | 390.67 | 485.7 | 590.38 | 704.45 |
| 874.0 | -8.32 | -8 | -7.27 | -6.98 | -5.41 | -3.36 | -0.25 | 5.45 | 12.69 | 22.35 | 37.65 | 56.48 | 81.81 | 116.79 | 159.56 | 221.56 | 288.18 | 386.52 | 480.47 | 584.03 | 696.73 |
| 875.0 | -8.31 | -8.05 | -7.37 | -6.95 | -5.4 | -3.38 | -0.31 | 5.44 | 12.54 | 22.08 | 37.31 | 55.86 | 80.82 | 115.53 | 157.65 | 219.24 | 285.05 | 382.54 | 475.76 | 578.48 | 689.68 |
| 876.0 | -8.33 | -8.07 | -7.36 | -6.9 | -5.31 | -3.32 | -0.4 | 5.32 | 12.51 | 21.83 | 36.9 | 55.28 | 79.95 | 114.29 | 156.01 | 217.38 | 282.31 | 378.88 | 471.07 | 572.78 | 682.89 |
| 877.0 | -8.26 | -8.08 | -7.43 | -6.9 | -5.27 | -3.37 | -0.46 | 5.29 | 12.26 | 21.54 | 36.72 | 54.87 | 79.28 | 112.9 | 154.48 | 215.45 | 279.75 | 375.35 | 466.97 | 567.87 | 677.14 |
| 878.0 | -8.22 | -8.03 | -7.49 | -6.89 | -5.11 | -3.33 | -0.46 | 5.2 | 12.11 | 21.29 | 36.48 | 54.45 | 78.75 | 112.04 | 153.16 | 213.93 | 277.76 | 372.27 | 463.54 | 563.99 | 672.29 |
| 879.0 | -8.13 | -7.79 | -7.29 | -6.76 | -4.89 | -3.19 | -0.37 | 5.29 | 12.24 | 21.29 | 36.32 | 54.09 | 78.38 | 111.27 | 152.49 | 212.45 | 276.28 | 370.25 | 460.48 | 560.56 | 668.26 |
| 880.0 | -8.15 | -7.85 | -7.38 | -6.82 | -4.99 | -3.21 | -0.44 | 5.11 | 12.01 | 21.06 | 36.04 | 53.7 | 77.7 | 110.69 | 151.58 | 211.33 | 274.65 | 368.27 | 457.99 | 557.77 | 665.41 |
| 881.0 | -8.08 | -7.81 | -7.43 | -6.86 | -4.96 | -3.24 | -0.55 | 5 | 11.93 | 20.87 | 35.54 | 53.29 | 77.29 | 110.14 | 150.64 | 209.99 | 273.29 | 366.73 | 456.61 | 555.68 | 662.83 |
| 882.0 | -8.07 | -7.76 | -7.43 | -6.93 | -5.02 | -3.26 | -0.64 | 4.79 | 11.88 | 20.54 | 35.47 | 53.11 | 76.79 | 109.42 | 150.02 | 209.22 | 272.01 | 365.41 | 455.25 | 553.6 | 660.6 |
| 883.0 | -7.97 | -7.72 | -7.45 | -6.96 | -5.14 | -3.19 | -0.71 | 4.66 | 11.82 | 20.48 | 35.27 | 52.87 | 76.46 | 108.93 | 149.46 | 208.42 | 270.93 | 364.29 | 454.42 | 552.12 | 659.3 |
| 884.0 | -7.84 | -7.67 | -7.38 | -6.89 | -5.03 | -3.09 | -0.6 | 4.7 | 11.74 | 20.54 | 35.21 | 52.69 | 76.29 | 109.03 | 149.29 | 208.02 | 270.83 | 363.98 | 454.24 | 551.72 | 659.36 |
| 885.0 | -7.94 | -7.63 | -7.47 | -6.93 | -5.11 | -3.12 | -0.7 | 4.56 | 11.39 | 20.33 | 34.92 | 52.59 | 76.04 | 108.69 | 149.09 | 207.77 | 270.62 | 363.74 | 454.46 | 551.72 | 659.52 |
| 886.0 | -7.82 | -7.54 | -7.39 | -6.85 | -4.98 | -3.12 | -0.58 | 4.75 | 11.64 | 20.41 | 35.04 | 52.77 | 76.16 | 108.88 | 149.52 | 207.73 | 270.98 | 364.07 | 455.29 | 552.4 | 660.58 |
| 887.0 | -7.99 | -7.81 | -7.45 | -6.9 | -5.19 | -3.33 | -0.7 | 4.58 | 11.52 | 20.23 | 34.94 | 52.69 | 76.07 | 108.88 | 149.7 | 207.79 | 271.62 | 364.58 | 455.99 | 552.7 | 661.53 |
| 888.0 | -7.98 | -7.76 | -7.32 | -6.82 | -5.15 | -3.29 | -0.68 | 4.63 | 11.71 | 20.19 | 35.03 | 52.61 | 76.07 | 109.16 | 150.11 | 208.2 | 272.08 | 365.18 | 457.27 | 553.96 | 662.83 |
| 889.0 | -8.03 | -7.84 | -7.26 | -6.79 | -5.18 | -3.29 | -0.64 | 4.53 | 11.8 | 20.2 | 35.13 | 52.65 | 76.15 | 109.26 | 150.45 | 208.48 | 272.61 | 365.76 | 458.29 | 554.72 | 664.38 |
| 890.0 | -7.99 | -7.81 | -7.29 | -6.85 | -5.17 | -3.39 | -0.61 | 4.55 | 11.67 | 20.23 | 35.19 | 52.67 | 75.97 | 109.42 | 150.61 | 208.9 | 273.36 | 366.35 | 459.22 | 556.05 | 665.84 |
| 891.0 | -8.05 | -7.83 | -7.32 | -6.94 | -5.25 | -3.45 | -0.8 | 4.53 | 11.69 | 20.08 | 35.29 | 52.66 | 76.01 | 109.36 | 151.09 | 209.22 | 273.8 | 367.1 | 459.97 | 557.15 | 667.31 |
| 892.0 | -7.98 | -7.86 | -7.32 | -7.01 | -5.23 | -3.41 | -0.88 | 4.61 | 11.75 | 19.97 | 35.27 | 52.71 | 76.14 | 109.39 | 151.21 | 209.69 | 274.05 | 367.62 | 460.79 | 558 | 668.47 |
| 893.0 | -7.98 | -7.81 | -7.12 | -6.9 | -5.13 | -3.32 | -0.84 | 4.74 | 11.82 | 20.14 | 35.42 | 52.94 | 76.33 | 109.46 | 151.39 | 210.16 | 274.56 | 368.46 | 461.88 | 559.04 | 669.71 |
| 894.0 | -8.01 | -7.88 | -7.11 | -6.83 | -5.09 | -3.31 | -0.88 | 4.71 | 11.88 | 20.2 | 35.46 | 52.89 | 76.3 | 109.34 | 151.56 | 210.16 | 274.88 | 368.76 | 462.14 | 559.53 | 670.24 |
| 895.0 | -8.13 | -7.85 | -7.18 | -6.86 | -5.17 | -3.29 | -0.91 | 4.67 | 11.78 | 20.19 | 35.46 | 52.83 | 76.22 | 109.08 | 151.52 | 210.11 | 274.84 | 368.91 | 462.04 | 559.68 | 670.36 |
| 896.0 | -8.1 | -7.75 | -7.12 | -6.91 | -5.14 | -3.36 | -0.94 | 4.56 | 11.73 | 20.07 | 35.27 | 52.66 | 76.17 | 108.77 | 151.35 | 209.87 | 274.34 | 368.49 | 461.2 | 559.16 | 669.83 |
| 897.0 | -8.17 | -7.77 | -7.14 | -6.94 | -5.31 | -3.43 | -1.03 | 4.56 | 11.61 | 19.99 | 35.02 | 52.74 | 75.86 | 108.41 | 150.98 | 209.08 | 273.86 | 368.14 | 460.59 | 558.14 | 669.12 |
| 898.0 | -8.18 | -7.74 | -7.02 | -6.85 | -5.35 | -3.46 | -1.05 | 4.52 | 11.65 | 19.77 | 34.74 | 52.47 | 75.66 | 108.35 | 150.71 | 208.72 | 273.55 | 367.51 | 459.87 | 557.22 | 668.13 |
| 899.0 | -8.22 | -7.76 | -7.1 | -6.86 | -5.44 | -3.6 | -1.17 | 4.41 | 11.53 | 19.67 | 34.49 | 52.07 | 75.3 | 107.69 | 150.09 | 208.07 | 272.65 | 366.3 | 458.13 | 555.66 | 666.34 |
| 900.0 | -8.31 | -7.9 | -7.27 | -6.97 | -5.7 | -3.78 | -1.28 | 4.12 | 11.21 | 19.28 | 34.22 | 51.48 | 74.7 | 106.88 | 149.09 | 206.91 | 271.2 | 364.69 | 456.4 | 553.57 | 663.51 |
| 901.0 | -8.23 | -7.9 | -7.22 | -6.88 | -5.66 | -3.77 | -1.22 | 4.15 | 11.2 | 19.23 | 34.02 | 51.2 | 74.33 | 106.2 | 148.16 | 205.82 | 270.03 | 362.69 | 454.54 | 551.32 | 660.38 |
| 902.0 | -8.25 | -7.88 | -7.19 | -6.8 | -5.71 | -3.68 | -1.16 | 4.14 | 11.11 | 19.15 | 33.88 | 50.98 | 73.98 | 105.61 | 147.36 | 204.84 | 268.75 | 360.76 | 451.83 | 548.66 | 657.05 |
| 903.0 | -8.31 | -7.84 | -7.21 | -6.73 | -5.68 | -3.7 | -1.18 | 4.07 | 10.99 | 19.12 | 33.52 | 50.68 | 73.59 | 104.95 | 146.56 | 203.52 | 267.24 | 358.85 | 449.09 | 545.53 | 653.32 |
| 904.0 | -8.39 | -7.87 | -7.2 | -6.71 | -5.6 | -3.74 | -1.09 | 3.93 | 10.79 | 19.01 | 33.32 | 50.28 | 73.08 | 104.13 | 145.42 | 202.25 | 265.54 | 356.41 | 446.3 | 541.96 | 649.03 |
| 905.0 | -8.47 | -7.88 | -7.24 | -6.77 | -5.76 | -3.94 | -1.22 | 3.77 | 10.63 | 18.67 | 32.95 | 49.82 | 72.36 | 103 | 144.32 | 200.67 | 263.07 | 353.34 | 442.81 | 537.42 | 643.72 |
| 906.0 | -8.29 | -7.77 | -7.21 | -6.67 | -5.61 | -3.84 | -1.21 | 3.87 | 10.63 | 18.62 | 32.73 | 49.34 | 71.82 | 102.21 | 142.93 | 199.15 | 260.91 | 350.65 | 439.13 | 532.68 | 638.18 |
| 907.0 | -8.31 | -7.79 | -7.23 | -6.61 | -5.72 | -3.85 | -1.25 | 3.72 | 10.31 | 18.37 | 32.28 | 48.86 | 71.08 | 101.01 | 141.18 | 197.22 | 258.41 | 347.44 | 434.81 | 527.79 | 632.38 |
| 908.0 | -8.19 | -7.69 | -7.2 | -6.59 | -5.64 | -3.76 | -1.41 | 3.63 | 10.12 | 18.13 | 31.88 | 48.33 | 70.29 | 100.02 | 139.53 | 195.12 | 255.4 | 343.86 | 430.37 | 522.58 | 625.92 |
| 909.0 | -8.22 | -7.81 | -7.42 | -6.65 | -5.67 | -3.93 | -1.51 | 3.43 | 9.74 | 17.84 | 31.15 | 47.71 | 69.42 | 98.67 | 137.75 | 192.74 | 252.7 | 340.29 | 425.7 | 517.14 | 619.27 |
| 910.0 | -8.23 | -7.87 | -7.61 | -6.81 | -5.81 | -4.04 | -1.63 | 3.23 | 9.4 | 17.47 | 30.56 | 46.99 | 68.57 | 97.25 | 135.62 | 190.31 | 249.65 | 336.55 | 420.73 | 510.87 | 612.21 |
| 911.0 | -8.22 | -7.78 | -7.54 | -6.68 | -5.75 | -3.88 | -1.57 | 3.24 | 9.31 | 17.2 | 30.09 | 46.59 | 67.95 | 95.92 | 133.84 | 187.74 | 246.34 | 332.54 | 415.65 | 504.58 | 604.92 |
| 912.0 | -8.15 | -7.69 | -7.42 | -6.48 | -5.66 | -3.77 | -1.36 | 3.13 | 9.17 | 17.02 | 29.57 | 45.91 | 66.94 | 94.66 | 131.79 | 185 | 242.84 | 328.4 | 410.25 | 498.12 | 596.98 |
| 913.0 | -8.23 | -7.72 | -7.43 | -6.37 | -5.7 | -3.86 | -1.47 | 2.86 | 8.92 | 16.75 | 29.16 | 44.97 | 65.76 | 93.22 | 129.89 | 182.14 | 239.72 | 323.84 | 404.67 | 491.28 | 589.06 |
| 914.0 | -8.37 | -7.79 | -7.53 | -6.44 | -5.78 | -4.05 | -1.61 | 2.46 | 8.66 | 16.41 | 28.53 | 43.91 | 64.55 | 91.62 | 127.63 | 178.68 | 235.75 | 318.48 | 398.2 | 484.05 | 580.11 |
| 915.0 | -8.38 | -7.78 | -7.57 | -6.46 | -5.88 | -4.14 | -1.7 | 2.3 | 8.37 | 15.96 | 27.98 | 43.02 | 63.39 | 90.08 | 125.46 | 175.57 | 231.84 | 313.47 | 391.8 | 476.71 | 571.62 |
| 916.0 | -8.31 | -7.71 | -7.48 | -6.41 | -5.88 | -4.15 | -1.81 | 2.1 | 8.14 | 15.56 | 27.4 | 42.06 | 62.21 | 88.59 | 123.26 | 172.36 | 227.84 | 307.93 | 385.12 | 468.65 | 562.39 |
| 917.0 | -8.43 | -7.81 | -7.55 | -6.47 | -6.05 | -4.3 | -2.02 | 1.85 | 7.85 | 15.06 | 26.79 | 41.21 | 60.83 | 86.67 | 120.89 | 168.88 | 223.8 | 302.64 | 378.41 | 459.85 | 552.9 |
| 918.0 | -8.46 | -7.91 | -7.62 | -6.62 | -6.09 | -4.45 | -2.1 | 1.51 | 7.39 | 14.42 | 26.06 | 40.15 | 59.47 | 84.9 | 118.31 | 165.39 | 219.57 | 296.5 | 371.19 | 451.3 | 542.67 |
| 919.0 | -8.39 | -7.86 | -7.74 | -6.65 | -6 | -4.45 | -2.08 | 1.3 | 7.08 | 14.12 | 25.39 | 39.26 | 58 | 82.82 | 115.58 | 161.89 | 214.78 | 290.45 | 363.64 | 442.08 | 532.04 |
| 920.0 | -8.38 | -7.79 | -7.55 | -6.58 | -6.01 | -4.45 | -2.17 | 1.22 | 6.87 | 13.77 | 24.69 | 38.46 | 56.69 | 81.01 | 112.93 | 158.31 | 210.3 | 284.61 | 356.39 | 433.03 | 521.17 |
| 921.0 | -8.4 | -7.71 | -7.61 | -6.53 | -5.92 | -4.5 | -2.21 | 1.08 | 6.55 | 13.32 | 23.85 | 37.69 | 55.32 | 79.18 | 110.23 | 154.79 | 205.44 | 278.46 | 348.75 | 424 | 510.08 |
| 922.0 | -8.54 | -7.8 | -7.61 | -6.75 | -6.03 | -4.66 | -2.41 | 0.83 | 6.12 | 12.83 | 23.03 | 36.63 | 53.81 | 77.11 | 107.6 | 150.89 | 200.5 | 271.9 | 340.61 | 414.2 | 498.28 |
| 923.0 | -8.59 | -7.89 | -7.62 | -6.9 | -6.11 | -4.83 | -2.59 | 0.59 | 5.75 | 12.31 | 22.3 | 35.59 | 52.35 | 74.96 | 104.78 | 146.76 | 195.1 | 264.76 | 332.15 | 404.17 | 486.13 |
| 924.0 | -8.53 | -8 | -7.66 | -7.06 | -6.17 | -4.96 | -2.73 | 0.36 | 5.32 | 11.76 | 21.51 | 34.39 | 50.79 | 72.79 | 101.78 | 142.72 | 189.51 | 257.56 | 323.47 | 393.69 | 473.41 |
| 925.0 | -8.59 | -8.11 | -7.8 | -7.28 | -6.36 | -5.2 | -3.15 | 0.05 | 4.68 | 11.06 | 20.49 | 33.05 | 48.94 | 70.52 | 98.63 | 138.17 | 183.64 | 250.05 | 314 | 382.42 | 459.99 |
| 926.0 | -8.6 | -8.19 | -7.91 | -7.35 | -6.4 | -5.31 | -3.32 | -0.16 | 4.23 | 10.41 | 19.55 | 31.91 | 47.26 | 68.27 | 95.19 | 133.55 | 177.78 | 241.9 | 303.87 | 370.61 | 445.39 |
| 927.0 | -8.73 | -8.21 | -7.85 | -7.35 | -6.56 | -5.52 | -3.44 | -0.47 | 3.9 | 9.69 | 18.51 | 30.67 | 45.36 | 65.6 | 91.63 | 128.31 | 171.17 | 233 | 292.81 | 357.48 | 429.86 |
| 928.0 | -8.8 | -8.38 | -8.05 | -7.54 | -6.67 | -5.64 | -3.64 | -0.8 | 3.32 | 8.92 | 17.38 | 29.07 | 43.16 | 62.59 | 87.63 | 123.04 | 164.03 | 223.24 | 280.83 | 342.99 | 412.65 |
| 929.0 | -8.82 | -8.29 | -8.06 | -7.59 | -6.76 | -5.67 | -3.72 | -1.01 | 2.85 | 8.24 | 16.35 | 27.45 | 41.05 | 59.6 | 83.67 | 117.36 | 156.71 | 213.22 | 268.14 | 327.75 | 394.54 |
| 930.0 | -8.75 | -8.2 | -7.99 | -7.57 | -6.81 | -5.78 | -3.92 | -1.28 | 2.38 | 7.54 | 15.42 | 25.81 | 38.88 | 56.63 | 79.32 | 111.57 | 148.92 | 202.75 | 254.97 | 311.93 | 375.57 |
| 931.0 | -8.73 | -8.2 | -7.98 | -7.52 | -6.86 | -5.89 | -4.16 | -1.46 | 1.94 | 6.76 | 14.38 | 24.18 | 36.41 | 53.52 | 75.02 | 105.48 | 140.86 | 191.93 | 241.4 | 295.85 | 355.88 |
| 932.0 | -8.78 | -8.37 | -8.07 | -7.59 | -7 | -6.14 | -4.51 | -1.91 | 1.35 | 5.85 | 13.19 | 22.34 | 33.76 | 50.2 | 70.57 | 99.16 | 132.66 | 180.86 | 227.86 | 279.37 | 336.04 |
| 933.0 | -8.84 | -8.56 | -8.23 | -7.89 | -7.15 | -6.42 | -4.81 | -2.28 | 0.69 | 4.96 | 11.97 | 20.55 | 31.28 | 46.7 | 66.04 | 92.89 | 124.61 | 169.68 | 214.07 | 262.68 | 316.46 |
| 934.0 | -8.98 | -8.61 | -8.32 | -8.03 | -7.3 | -6.64 | -5.05 | -2.73 | 0.06 | 4.06 | 10.59 | 18.95 | 28.84 | 43.45 | 61.56 | 86.73 | 116.45 | 158.81 | 200.39 | 246.07 | 296.79 |
| 935.0 | -8.89 | -8.59 | -8.33 | -8.04 | -7.31 | -6.62 | -5.14 | -2.93 | -0.5 | 3.25 | 9.43 | 17.35 | 26.61 | 40.32 | 57.45 | 81.14 | 108.68 | 148.49 | 187.3 | 229.87 | 277.75 |
| 936.0 | -8.71 | -8.48 | -8.29 | -8.03 | -7.29 | -6.71 | -5.35 | -3.26 | -0.97 | 2.53 | 8.25 | 15.79 | 24.54 | 37.34 | 53.2 | 75.48 | 101.21 | 138.37 | 174.78 | 214.53 | 259.14 |
| 937.0 | -8.74 | -8.49 | -8.28 | -8.09 | -7.28 | -6.79 | -5.57 | -3.45 | -1.46 | 1.91 | 7.05 | 14.37 | 22.49 | 34.3 | 49.16 | 69.95 | 94.11 | 128.87 | 162.87 | 199.76 | 241.28 |
| 938.0 | -8.65 | -8.42 | -8.2 | -7.97 | -7.24 | -6.76 | -5.71 | -3.63 | -1.79 | 1.28 | 5.99 | 13.03 | 20.67 | 31.74 | 45.42 | 64.89 | 87.32 | 119.55 | 151.22 | 186.03 | 224.43 |
| 939.0 | -8.54 | -8.29 | -8.23 | -7.84 | -7.29 | -6.83 | -5.78 | -3.77 | -2.11 | 0.72 | 5.19 | 11.7 | 19 | 29.12 | 42.02 | 60.04 | 80.5 | 111.14 | 140.37 | 172.76 | 208.48 |
| 940.0 | -8.72 | -8.5 | -8.22 | -8.04 | -7.51 | -7.02 | -6.19 | -4.09 | -2.6 | 0 | 4.23 | 10.28 | 17.05 | 26.61 | 38.57 | 55.15 | 74.27 | 102.99 | 129.9 | 160.16 | 193.47 |
| 941.0 | -8.6 | -8.56 | -8.36 | -8.19 | -7.49 | -7.17 | -6.39 | -4.31 | -3.03 | -0.69 | 3.35 | 9.06 | 15.36 | 24.27 | 35.42 | 50.59 | 68.44 | 95 | 120.2 | 148.28 | 179.37 |
| 942.0 | -8.47 | -8.61 | -8.21 | -8.14 | -7.51 | -7.22 | -6.46 | -4.48 | -3.32 | -1.12 | 2.71 | 7.89 | 13.87 | 22.11 | 32.52 | 46.48 | 63.17 | 87.65 | 111.02 | 136.95 | 166.27 |
| 943.0 | -8.36 | -8.61 | -8.36 | -8.1 | -7.52 | -7.27 | -6.58 | -4.77 | -3.66 | -1.68 | 1.95 | 6.77 | 12.36 | 20.15 | 29.66 | 42.71 | 58.27 | 81.07 | 102.55 | 126.73 | 154.09 |
| 944.0 | -8.32 | -8.5 | -8.31 | -8 | -7.55 | -7.31 | -6.64 | -4.87 | -3.88 | -2.17 | 1.29 | 5.89 | 11.15 | 18.48 | 27.2 | 39.4 | 53.85 | 75.28 | 95.15 | 117.44 | 143.19 |
| 945.0 | -8.32 | -8.38 | -8.36 | -7.94 | -7.62 | -7.24 | -6.78 | -4.97 | -3.99 | -2.63 | 0.72 | 4.9 | 9.91 | 16.91 | 24.99 | 36.37 | 49.96 | 69.85 | 88.59 | 109.52 | 133.55 |
| 946.0 | -8.25 | -8.33 | -8.29 | -7.81 | -7.58 | -7.17 | -6.7 | -5.02 | -4.03 | -2.91 | 0.38 | 4.23 | 9.04 | 15.54 | 23.25 | 33.99 | 46.75 | 65.32 | 82.93 | 102.85 | 125.26 |
| 947.0 | -8.19 | -8.35 | -8.27 | -7.86 | -7.75 | -7.07 | -6.74 | -5.27 | -4.16 | -3.17 | 0.1 | 3.61 | 8.11 | 14.34 | 21.69 | 31.9 | 43.88 | 61.86 | 78.45 | 97.26 | 118.84 |
| 948.0 | -8.24 | -8.4 | -8.35 | -7.98 | -7.71 | -7.08 | -6.83 | -5.44 | -4.41 | -3.28 | -0.14 | 3 | 7.41 | 13.42 | 20.42 | 30.57 | 41.91 | 59.09 | 75.22 | 93.47 | 113.88 |
| 949.0 | -8.28 | -8.25 | -8.24 | -7.98 | -7.71 | -7.26 | -7.09 | -5.63 | -4.5 | -3.38 | -0.31 | 2.76 | 7.04 | 13.14 | 19.81 | 29.58 | 40.66 | 57.51 | 73.37 | 91.26 | 111.06 |
| 950.0 | -8.23 | -8.25 | -8.2 | -7.96 | -7.67 | -7.23 | -7.02 | -5.63 | -4.54 | -3.29 | -0.42 | 2.61 | 6.8 | 12.9 | 19.65 | 29.38 | 40.25 | 56.88 | 72.88 | 90.69 | 110.24 |
| 951.0 | -8.13 | -8.24 | -8.15 | -7.95 | -7.68 | -7.11 | -6.96 | -5.68 | -4.49 | -3.31 | -0.46 | 2.75 | 6.74 | 12.95 | 19.84 | 29.56 | 40.31 | 57.06 | 73.32 | 91.05 | 111.03 |
| 952.0 | -8.12 | -8.12 | -8.11 | -7.96 | -7.48 | -7 | -6.77 | -5.79 | -4.44 | -3.25 | -0.4 | 2.88 | 7.03 | 13.24 | 20.41 | 30.13 | 41.07 | 58.06 | 74.56 | 92.77 | 112.94 |
| 953.0 | -8.12 | -8.13 | -8.13 | -8.08 | -7.6 | -7.05 | -6.8 | -5.86 | -4.41 | -3.16 | -0.28 | 3.03 | 7.38 | 13.7 | 20.93 | 30.9 | 42.15 | 59.47 | 76 | 94.92 | 115.84 |
| 954.0 | -8.13 | -8.07 | -8.23 | -8.07 | -7.72 | -7.02 | -6.83 | -5.88 | -4.37 | -3.19 | -0.19 | 3.25 | 7.76 | 14.15 | 21.5 | 31.79 | 43.46 | 61.22 | 78.33 | 97.57 | 118.87 |
| 955.0 | -7.88 | -8.05 | -8.12 | -7.92 | -7.59 | -6.9 | -6.58 | -5.71 | -4.13 | -2.92 | 0.18 | 3.57 | 8.34 | 14.76 | 22.34 | 32.9 | 44.87 | 63.1 | 80.87 | 100.98 | 122.66 |
| 956.0 | -7.89 | -8.07 | -8.16 | -7.92 | -7.65 | -6.95 | -6.6 | -5.68 | -4.07 | -2.82 | 0.45 | 3.91 | 8.77 | 15.37 | 23.01 | 34.07 | 46.3 | 65.06 | 83.48 | 104.14 | 126.59 |
| 957.0 | -8.01 | -8.07 | -8.04 | -7.94 | -7.6 | -6.99 | -6.61 | -5.58 | -4.05 | -2.65 | 0.74 | 4.33 | 9.2 | 15.97 | 24.03 | 35.37 | 47.87 | 67.04 | 85.98 | 107.22 | 130.5 |
| 958.0 | -8.06 | -8.11 | -8.08 | -7.96 | -7.65 | -7.02 | -6.54 | -5.57 | -3.9 | -2.53 | 1.03 | 4.62 | 9.58 | 16.56 | 24.85 | 36.5 | 49.36 | 69 | 88.46 | 110.34 | 134.32 |
| 959.0 | -8.08 | -8.18 | -8.12 | -7.91 | -7.68 | -7.03 | -6.52 | -5.62 | -3.92 | -2.43 | 1.27 | 4.83 | 9.9 | 16.99 | 25.58 | 37.6 | 50.8 | 70.87 | 91.01 | 113.47 | 137.8 |
| 960.0 | -8.08 | -8.19 | -8.08 | -7.92 | -7.68 | -6.93 | -6.43 | -5.61 | -3.88 | -2.26 | 1.48 | 5.15 | 10.25 | 17.63 | 26.27 | 38.74 | 52.25 | 72.54 | 93.27 | 116.53 | 141.27 |
| 961.0 | -7.92 | -8.23 | -8.05 | -7.92 | -7.67 | -6.99 | -6.27 | -5.53 | -3.82 | -2.03 | 1.7 | 5.5 | 10.82 | 18.13 | 27.23 | 39.92 | 53.5 | 74.07 | 95.42 | 119.35 | 144.35 |
| 962.0 | -8.09 | -8.37 | -8.05 | -8 | -7.97 | -7.06 | -6.18 | -5.57 | -3.87 | -1.91 | 1.71 | 5.66 | 11.03 | 18.56 | 27.81 | 40.65 | 54.5 | 75.5 | 97.13 | 121.33 | 146.95 |
| 963.0 | -8.14 | -8.34 | -8.05 | -8 | -7.93 | -6.99 | -6.24 | -5.54 | -3.78 | -1.8 | 1.82 | 6.01 | 11.36 | 19 | 28.46 | 41.48 | 55.5 | 76.88 | 98.85 | 123.38 | 149.44 |
| 964.0 | -8.25 | -8.39 | -8.06 | -7.98 | -8.03 | -7.12 | -6.32 | -5.43 | -3.77 | -1.78 | 1.93 | 6.13 | 11.57 | 19.23 | 28.89 | 42.1 | 56.13 | 77.89 | 100.11 | 125.01 | 151.51 |
| 965.0 | -8.28 | -8.37 | -8.19 | -8.04 | -8.05 | -7.16 | -6.36 | -5.45 | -3.85 | -1.69 | 1.96 | 6.36 | 11.69 | 19.3 | 29.29 | 42.64 | 56.63 | 78.67 | 101.22 | 126.3 | 153.28 |
| 966.0 | -8.24 | -8.52 | -8.12 | -8 | -8.04 | -7.16 | -6.27 | -5.44 | -3.84 | -1.64 | 2.09 | 6.7 | 11.96 | 19.55 | 29.59 | 42.95 | 57.32 | 79.41 | 101.96 | 127.08 | 154.63 |
| 967.0 | -8.29 | -8.39 | -8.08 | -8.01 | -8.08 | -7.25 | -6.4 | -5.42 | -3.87 | -1.63 | 2.06 | 6.84 | 12.06 | 19.67 | 29.75 | 43.19 | 57.69 | 79.87 | 102.37 | 127.74 | 155.41 |
| 968.0 | -8.38 | -8.26 | -7.99 | -7.95 | -7.96 | -7.25 | -6.31 | -5.27 | -3.73 | -1.39 | 2.01 | 6.9 | 12.32 | 19.95 | 29.86 | 43.41 | 58.09 | 80.23 | 102.82 | 128.04 | 155.98 |
| 969.0 | -8.23 | -8.27 | -7.88 | -7.89 | -7.91 | -7.25 | -6.35 | -5.13 | -3.71 | -1.43 | 2 | 6.83 | 12.42 | 20.05 | 30.06 | 43.38 | 58.19 | 80.38 | 102.97 | 128.1 | 156.28 |
| 970.0 | -8.13 | -8.25 | -7.76 | -7.77 | -7.83 | -7.07 | -6.2 | -4.96 | -3.62 | -1.49 | 2.12 | 6.79 | 12.49 | 19.92 | 30.04 | 43.48 | 58.34 | 80.52 | 102.91 | 128.14 | 156.15 |
| 971.0 | -8.19 | -8.38 | -7.86 | -7.9 | -7.91 | -7.2 | -6.38 | -4.99 | -3.64 | -1.65 | 2.04 | 6.84 | 12.42 | 19.78 | 29.71 | 43.19 | 58.12 | 80.36 | 102.49 | 127.62 | 155.64 |
| 972.0 | -8.2 | -8.27 | -7.87 | -7.91 | -7.86 | -7.2 | -6.34 | -4.91 | -3.63 | -1.54 | 2.03 | 6.76 | 12.56 | 19.71 | 29.55 | 42.97 | 57.89 | 80.08 | 101.96 | 127.31 | 155.01 |
| 973.0 | -8.18 | -8.4 | -7.89 | -7.93 | -8.04 | -7.28 | -6.55 | -4.87 | -3.78 | -1.57 | 1.95 | 6.6 | 12.46 | 19.49 | 29.23 | 42.75 | 57.43 | 79.5 | 101.12 | 126.25 | 154.02 |
| 974.0 | -8.17 | -8.4 | -7.9 | -7.85 | -7.86 | -7.19 | -6.53 | -4.86 | -3.77 | -1.49 | 1.8 | 6.65 | 12.31 | 19.18 | 29.09 | 42.51 | 57.01 | 78.82 | 100.59 | 125.22 | 152.6 |
| 975.0 | -8.11 | -8.28 | -7.83 | -7.78 | -7.75 | -7.22 | -6.51 | -4.87 | -3.61 | -1.36 | 1.87 | 6.56 | 12.31 | 19.12 | 28.91 | 42.22 | 56.39 | 78.13 | 99.63 | 123.85 | 151.33 |
| 976.0 | -8.08 | -8.22 | -7.82 | -7.8 | -7.76 | -7.24 | -6.63 | -4.77 | -3.61 | -1.48 | 1.71 | 6.43 | 12.14 | 18.95 | 28.55 | 41.75 | 55.81 | 77.36 | 98.62 | 122.31 | 149.71 |
| 977.0 | -8.16 | -8.16 | -7.82 | -7.86 | -7.86 | -7.28 | -6.62 | -4.78 | -3.67 | -1.54 | 1.56 | 6.29 | 11.91 | 18.65 | 28.34 | 41.09 | 55.18 | 76.51 | 97.43 | 120.82 | 147.65 |
| 978.0 | -8.24 | -8.14 | -8.01 | -7.91 | -7.9 | -7.24 | -6.57 | -4.85 | -3.69 | -1.52 | 1.41 | 6.11 | 11.68 | 18.26 | 27.71 | 40.41 | 54.39 | 75.32 | 96.04 | 119.22 | 145.55 |
| 979.0 | -8.14 | -8.14 | -7.98 | -7.83 | -7.87 | -7.21 | -6.54 | -4.84 | -3.82 | -1.59 | 1.38 | 5.96 | 11.46 | 17.97 | 27.39 | 39.86 | 53.63 | 74.23 | 94.56 | 117.44 | 143.48 |
| 980.0 | -7.99 | -7.96 | -7.85 | -7.77 | -7.78 | -7.1 | -6.42 | -4.73 | -3.7 | -1.41 | 1.53 | 5.99 | 11.29 | 17.83 | 27.12 | 39.31 | 52.93 | 73.22 | 93.03 | 115.6 | 141.51 |
| 981.0 | -8.1 | -7.99 | -7.89 | -7.82 | -7.79 | -7.16 | -6.59 | -4.88 | -3.75 | -1.44 | 1.37 | 5.7 | 10.91 | 17.36 | 26.67 | 38.51 | 52 | 72.15 | 91.48 | 113.44 | 138.97 |
| 982.0 | -8.07 | -7.84 | -7.83 | -7.69 | -7.75 | -7 | -6.56 | -4.86 | -3.69 | -1.45 | 1.32 | 5.59 | 10.65 | 17.05 | 26.05 | 37.72 | 51.33 | 71.09 | 89.97 | 111.36 | 136.43 |
| 983.0 | -8.01 | -7.69 | -7.83 | -7.57 | -7.52 | -6.9 | -6.55 | -4.77 | -3.58 | -1.55 | 1.31 | 5.5 | 10.59 | 16.8 | 25.68 | 37.26 | 50.5 | 69.86 | 88.35 | 109.59 | 134.13 |
| 984.0 | -8.11 | -7.79 | -8 | -7.73 | -7.7 | -7.03 | -6.66 | -4.93 | -3.73 | -1.83 | 0.98 | 5.2 | 10.14 | 16.39 | 24.92 | 36.34 | 49.43 | 68.36 | 86.55 | 107.26 | 131.49 |
| 985.0 | -8.08 | -7.68 | -7.92 | -7.73 | -7.65 | -6.91 | -6.5 | -4.97 | -3.75 | -1.88 | 0.83 | 5.01 | 10.01 | 16 | 24.45 | 35.59 | 48.44 | 67.03 | 84.96 | 105.31 | 128.79 |
| 986.0 | -8.26 | -7.94 | -8.09 | -7.91 | -7.83 | -7.05 | -6.76 | -5.34 | -3.93 | -2.16 | 0.6 | 4.49 | 9.54 | 15.46 | 23.69 | 34.64 | 47.36 | 65.4 | 82.97 | 102.91 | 125.73 |
| 987.0 | -8.13 | -7.71 | -7.99 | -7.87 | -7.71 | -6.97 | -6.65 | -5.33 | -3.94 | -2.11 | 0.49 | 4.33 | 9.33 | 15.18 | 23.2 | 34.04 | 46.33 | 64.1 | 81.24 | 100.92 | 123 |
| 988.0 | -8.05 | -7.68 | -7.95 | -7.76 | -7.58 | -6.86 | -6.51 | -5.37 | -3.89 | -2.03 | 0.44 | 4.14 | 9.13 | 14.99 | 22.77 | 33.34 | 45.4 | 62.78 | 79.75 | 98.67 | 120.54 |
| 989.0 | -7.99 | -7.64 | -7.92 | -7.76 | -7.55 | -6.88 | -6.56 | -5.38 | -4.04 | -2.2 | 0.34 | 4.04 | 8.86 | 14.52 | 22.31 | 32.57 | 44.33 | 61.25 | 77.95 | 96.74 | 117.79 |
| 990.0 | -8.04 | -7.64 | -8 | -7.78 | -7.6 | -6.89 | -6.56 | -5.54 | -4.09 | -2.26 | 0.25 | 3.99 | 8.64 | 14.07 | 21.66 | 31.81 | 43.28 | 59.8 | 76.21 | 94.37 | 115.13 |
| 991.0 | -9.65 | -8.6 | -8.8 | -8.04 | -8.22 | -7.2 | -7.52 | -7.75 | -5.78 | -1.74 | -0.51 | 2.29 | 6.24 | 12.04 | 21.22 | 29.51 | 41.97 | 60.7 | 74.79 | 91.04 | 108.69 |
| 992.0 | -6.54 | -8.02 | -6.27 | -7.02 | -7.86 | -6.07 | -5.31 | -4.37 | -2.72 | -0.8 | 1.69 | 4.47 | 8.16 | 11.99 | 22.04 | 29.85 | 43.77 | 60.19 | 73.05 | 91.48 | 108.1 |
| 993.0 | -8.28 | -7.3 | -8.39 | -6.64 | -6.5 | -7.04 | -5.16 | -3.74 | -2.95 | -2.86 | -0.52 | 4.03 | 9.6 | 15.21 | 21.65 | 32.95 | 40.7 | 56.16 | 69.44 | 87.86 | 108.73 |
| 994.0 | -9.38 | -8.81 | -9.59 | -9.55 | -9 | -8.01 | -7.8 | -6.77 | -4.18 | -5 | -2.79 | 3.21 | 5 | 13.2 | 17.05 | 27.22 | 37.97 | 52.43 | 68.74 | 82.75 | 104.02 |
| 995.0 | -8.65 | -6.92 | -7.99 | -7.13 | -7.93 | -6.54 | -5.04 | -5.34 | -4.83 | -2.73 | -1.7 | 0.84 | 8.01 | 11.18 | 18 | 28.35 | 35.24 | 50.36 | 65.56 | 84.54 | 100.53 |
| 996.0 | -11.73 | -11.95 | -12.07 | -11.88 | -11.83 | -10.31 | -11.87 | -11.66 | -8.23 | -7.61 | -3.21 | -1.38 | 3.46 | 6.6 | 14.77 | 22.85 | 31.55 | 45.14 | 60.53 | 76.5 | 93.36 |
| 997.0 | -4.52 | -5.24 | -5.97 | -5.86 | -5.83 | -4.65 | -3.55 | -4.71 | -2.42 | -0.96 | -0.15 | 5.19 | 8.54 | 13.44 | 19.61 | 28.52 | 37.1 | 50.9 | 65.23 | 81.13 | 96.84 |
| 998.0 | -7.67 | -6.2 | -6.81 | -6.29 | -6.08 | -6.3 | -5.46 | -5.47 | -3.97 | -0.76 | 0.02 | 2.52 | 7.66 | 14.58 | 19 | 26.87 | 36.91 | 50.01 | 67.97 | 76.77 | 96.33 |
| 999.0 | -8.35 | -5.61 | -6.47 | -7.83 | -7.33 | -6.46 | -5.94 | -4.95 | -4.89 | -2.61 | 0.24 | 4.4 | 7.22 | 11.39 | 17.58 | 24.74 | 35.02 | 46.04 | 60.5 | 76.75 | 89.64 |
| 1000.0 | -8.17 | -8.84 | -8.52 | -9.18 | -8.22 | -7.76 | -8.34 | -7.33 | -5.09 | -2.86 | -2.24 | 0.96 | 6.35 | 9.64 | 13.54 | 22.55 | 32.41 | 44.15 | 59.74 | 69.36 | 88.59 |